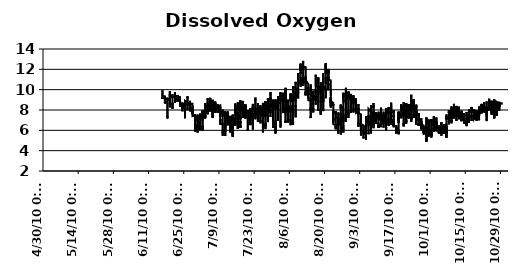
| Category | mg/L |
|---|---|
| 6/16/10 | 9.1 |
| 6/16/10 | 9.17 |
| 6/16/10 | 9.24 |
| 6/16/10 | 9.32 |
| 6/16/10 | 9.3 |
| 6/16/10 | 9.09 |
| 6/16/10 | 9.05 |
| 6/16/10 | 9.18 |
| 6/16/10 | 9.31 |
| 6/16/10 | 9.5 |
| 6/16/10 | 9.72 |
| 6/16/10 | 9.78 |
| 6/16/10 | 9.81 |
| 6/16/10 | 9.93 |
| 6/16/10 | 9.86 |
| 6/16/10 | 9.81 |
| 6/16/10 | 9.65 |
| 6/16/10 | 9.55 |
| 6/16/10 | 9.56 |
| 6/16/10 | 9.61 |
| 6/16/10 | 9.53 |
| 6/16/10 | 9.47 |
| 6/16/10 | 9.35 |
| 6/16/10 | 9.38 |
| 6/17/10 | 9.34 |
| 6/17/10 | 9.34 |
| 6/17/10 | 9.23 |
| 6/17/10 | 9.28 |
| 6/17/10 | 9.24 |
| 6/17/10 | 9.18 |
| 6/17/10 | 9.17 |
| 6/17/10 | 9.1 |
| 6/17/10 | 9.03 |
| 6/17/10 | 8.98 |
| 6/17/10 | 8.93 |
| 6/17/10 | 8.78 |
| 6/17/10 | 8.77 |
| 6/17/10 | 8.71 |
| 6/17/10 | 8.76 |
| 6/17/10 | 8.66 |
| 6/17/10 | 8.7 |
| 6/17/10 | 8.74 |
| 6/17/10 | 8.7 |
| 6/17/10 | 8.8 |
| 6/17/10 | 8.75 |
| 6/17/10 | 8.82 |
| 6/17/10 | 8.71 |
| 6/17/10 | 8.66 |
| 6/17/10 | 8.68 |
| 6/17/10 | 8.69 |
| 6/17/10 | 8.69 |
| 6/17/10 | 8.8 |
| 6/17/10 | 8.84 |
| 6/17/10 | 8.91 |
| 6/17/10 | 9 |
| 6/17/10 | 9.09 |
| 6/17/10 | 9.12 |
| 6/17/10 | 9.22 |
| 6/17/10 | 9.06 |
| 6/17/10 | 9.19 |
| 6/17/10 | 9.03 |
| 6/17/10 | 9.12 |
| 6/17/10 | 9.18 |
| 6/17/10 | 9.17 |
| 6/17/10 | 9.26 |
| 6/17/10 | 9.27 |
| 6/17/10 | 9.21 |
| 6/17/10 | 9.08 |
| 6/17/10 | 9.09 |
| 6/17/10 | 8.96 |
| 6/17/10 | 8.83 |
| 6/17/10 | 8.82 |
| 6/18/10 | 8.69 |
| 6/18/10 | 8.54 |
| 6/18/10 | 8.51 |
| 6/18/10 | 8.37 |
| 6/18/10 | 8.11 |
| 6/18/10 | 7.91 |
| 6/18/10 | 7.91 |
| 6/18/10 | 7.83 |
| 6/18/10 | 7.82 |
| 6/18/10 | 7.41 |
| 6/18/10 | 7.49 |
| 6/18/10 | 7.45 |
| 6/18/10 | 7.3 |
| 6/18/10 | 7.25 |
| 6/18/10 | 7.17 |
| 6/18/10 | 7.2 |
| 6/18/10 | 7.19 |
| 6/18/10 | 7.12 |
| 6/18/10 | 7.1 |
| 6/18/10 | 7.11 |
| 6/18/10 | 7.13 |
| 6/18/10 | 7.08 |
| 6/18/10 | 7.45 |
| 6/18/10 | 7.43 |
| 6/18/10 | 7.73 |
| 6/18/10 | 7.86 |
| 6/18/10 | 7.83 |
| 6/18/10 | 8.17 |
| 6/18/10 | 8.37 |
| 6/18/10 | 8.55 |
| 6/18/10 | 8.67 |
| 6/18/10 | 8.72 |
| 6/18/10 | 8.95 |
| 6/18/10 | 8.88 |
| 6/18/10 | 9 |
| 6/18/10 | 8.98 |
| 6/18/10 | 9.08 |
| 6/18/10 | 9.11 |
| 6/18/10 | 9.2 |
| 6/18/10 | 8.96 |
| 6/18/10 | 9.2 |
| 6/18/10 | 9.17 |
| 6/18/10 | 9.21 |
| 6/18/10 | 9.06 |
| 6/18/10 | 9.09 |
| 6/18/10 | 9.04 |
| 6/18/10 | 9.04 |
| 6/18/10 | 9.01 |
| 6/19/10 | 8.92 |
| 6/19/10 | 8.75 |
| 6/19/10 | 8.81 |
| 6/19/10 | 8.81 |
| 6/19/10 | 8.72 |
| 6/19/10 | 8.6 |
| 6/19/10 | 8.59 |
| 6/19/10 | 8.8 |
| 6/19/10 | 8.72 |
| 6/19/10 | 8.84 |
| 6/19/10 | 8.88 |
| 6/19/10 | 8.79 |
| 6/19/10 | 8.79 |
| 6/19/10 | 8.6 |
| 6/19/10 | 8.58 |
| 6/19/10 | 8.48 |
| 6/19/10 | 8.59 |
| 6/19/10 | 8.57 |
| 6/19/10 | 8.64 |
| 6/19/10 | 8.76 |
| 6/19/10 | 9 |
| 6/19/10 | 9.03 |
| 6/19/10 | 8.27 |
| 6/19/10 | 8.65 |
| 6/19/10 | 9.17 |
| 6/19/10 | 8.94 |
| 6/19/10 | 9.82 |
| 6/19/10 | 9.31 |
| 6/19/10 | 9.61 |
| 6/19/10 | 9.59 |
| 6/19/10 | 9.63 |
| 6/19/10 | 9.69 |
| 6/19/10 | 9.68 |
| 6/19/10 | 9.28 |
| 6/19/10 | 9.72 |
| 6/19/10 | 9.87 |
| 6/19/10 | 9.76 |
| 6/19/10 | 9.4 |
| 6/19/10 | 9.04 |
| 6/19/10 | 8.8 |
| 6/19/10 | 8.99 |
| 6/19/10 | 9 |
| 6/19/10 | 8.87 |
| 6/19/10 | 8.74 |
| 6/19/10 | 8.71 |
| 6/19/10 | 8.59 |
| 6/19/10 | 8.66 |
| 6/19/10 | 8.65 |
| 6/20/10 | 8.6 |
| 6/20/10 | 8.53 |
| 6/20/10 | 8.56 |
| 6/20/10 | 8.56 |
| 6/20/10 | 8.54 |
| 6/20/10 | 8.46 |
| 6/20/10 | 8.43 |
| 6/20/10 | 8.4 |
| 6/20/10 | 8.32 |
| 6/20/10 | 8.39 |
| 6/20/10 | 8.32 |
| 6/20/10 | 8.3 |
| 6/20/10 | 8.22 |
| 6/20/10 | 8.31 |
| 6/20/10 | 8.27 |
| 6/20/10 | 8.16 |
| 6/20/10 | 8.36 |
| 6/20/10 | 8.46 |
| 6/20/10 | 8.46 |
| 6/20/10 | 8.61 |
| 6/20/10 | 8.72 |
| 6/20/10 | 8.75 |
| 6/20/10 | 8.64 |
| 6/20/10 | 8.68 |
| 6/20/10 | 8.57 |
| 6/20/10 | 8.11 |
| 6/20/10 | 8.3 |
| 6/20/10 | 8.39 |
| 6/20/10 | 8.52 |
| 6/20/10 | 8.77 |
| 6/20/10 | 8.71 |
| 6/20/10 | 8.83 |
| 6/20/10 | 8.8 |
| 6/20/10 | 9.07 |
| 6/20/10 | 9.19 |
| 6/20/10 | 9.23 |
| 6/20/10 | 9.25 |
| 6/20/10 | 9.18 |
| 6/20/10 | 9.32 |
| 6/20/10 | 9.24 |
| 6/20/10 | 9.21 |
| 6/20/10 | 9.32 |
| 6/20/10 | 9.54 |
| 6/20/10 | 9.49 |
| 6/20/10 | 9.3 |
| 6/20/10 | 9.34 |
| 6/20/10 | 9.32 |
| 6/20/10 | 9.29 |
| 6/21/10 | 9.23 |
| 6/21/10 | 9.2 |
| 6/21/10 | 9.11 |
| 6/21/10 | 9.11 |
| 6/21/10 | 9.05 |
| 6/21/10 | 8.96 |
| 6/21/10 | 8.93 |
| 6/21/10 | 8.91 |
| 6/21/10 | 8.88 |
| 6/21/10 | 8.93 |
| 6/21/10 | 8.84 |
| 6/21/10 | 8.87 |
| 6/21/10 | 8.72 |
| 6/21/10 | 8.74 |
| 6/21/10 | 8.73 |
| 6/21/10 | 8.8 |
| 6/21/10 | 8.77 |
| 6/21/10 | 8.73 |
| 6/21/10 | 8.77 |
| 6/21/10 | 8.85 |
| 6/21/10 | 8.96 |
| 6/21/10 | 8.97 |
| 6/21/10 | 9 |
| 6/21/10 | 9.03 |
| 6/21/10 | 8.95 |
| 6/21/10 | 9.04 |
| 6/21/10 | 9.21 |
| 6/21/10 | 9.37 |
| 6/21/10 | 9.32 |
| 6/21/10 | 9.36 |
| 6/21/10 | 9.38 |
| 6/21/10 | 9.55 |
| 6/21/10 | 9.59 |
| 6/21/10 | 9.6 |
| 6/21/10 | 9.58 |
| 6/21/10 | 9.48 |
| 6/21/10 | 9.59 |
| 6/21/10 | 9.75 |
| 6/21/10 | 9.74 |
| 6/21/10 | 9.72 |
| 6/21/10 | 9.68 |
| 6/21/10 | 9.7 |
| 6/21/10 | 9.71 |
| 6/21/10 | 9.56 |
| 6/21/10 | 9.49 |
| 6/21/10 | 9.5 |
| 6/21/10 | 9.23 |
| 6/21/10 | 9.39 |
| 6/22/10 | 9.37 |
| 6/22/10 | 9.35 |
| 6/22/10 | 9.39 |
| 6/22/10 | 9.14 |
| 6/22/10 | 9.02 |
| 6/22/10 | 8.89 |
| 6/22/10 | 8.96 |
| 6/22/10 | 8.8 |
| 6/22/10 | 8.83 |
| 6/22/10 | 8.94 |
| 6/22/10 | 8.85 |
| 6/22/10 | 8.87 |
| 6/22/10 | 8.84 |
| 6/22/10 | 8.79 |
| 6/22/10 | 8.8 |
| 6/22/10 | 8.82 |
| 6/22/10 | 8.88 |
| 6/22/10 | 8.95 |
| 6/22/10 | 8.87 |
| 6/22/10 | 8.84 |
| 6/22/10 | 8.86 |
| 6/22/10 | 8.97 |
| 6/22/10 | 8.99 |
| 6/22/10 | 9.04 |
| 6/22/10 | 9.14 |
| 6/22/10 | 9.21 |
| 6/22/10 | 9.25 |
| 6/22/10 | 9.2 |
| 6/22/10 | 9.33 |
| 6/22/10 | 9.29 |
| 6/22/10 | 9.27 |
| 6/22/10 | 9.48 |
| 6/22/10 | 9.27 |
| 6/22/10 | 9.37 |
| 6/22/10 | 8.96 |
| 6/22/10 | 9.18 |
| 6/22/10 | 9.15 |
| 6/22/10 | 9.29 |
| 6/22/10 | 9.32 |
| 6/22/10 | 9.36 |
| 6/22/10 | 9.24 |
| 6/22/10 | 9.15 |
| 6/22/10 | 9.43 |
| 6/22/10 | 9.34 |
| 6/22/10 | 9.29 |
| 6/22/10 | 9.28 |
| 6/22/10 | 9.29 |
| 6/22/10 | 9.12 |
| 6/23/10 | 9.13 |
| 6/23/10 | 9.13 |
| 6/23/10 | 9.08 |
| 6/23/10 | 9.09 |
| 6/23/10 | 9.03 |
| 6/23/10 | 9.01 |
| 6/23/10 | 8.96 |
| 6/23/10 | 8.97 |
| 6/23/10 | 8.97 |
| 6/23/10 | 8.86 |
| 6/23/10 | 8.85 |
| 6/23/10 | 8.77 |
| 6/23/10 | 8.67 |
| 6/23/10 | 8.76 |
| 6/23/10 | 8.72 |
| 6/23/10 | 8.69 |
| 6/23/10 | 8.6 |
| 6/23/10 | 8.7 |
| 6/23/10 | 8.74 |
| 6/23/10 | 8.79 |
| 6/23/10 | 8.86 |
| 6/23/10 | 8.85 |
| 6/23/10 | 9.01 |
| 6/23/10 | 9.03 |
| 6/23/10 | 8.98 |
| 6/23/10 | 9.1 |
| 6/23/10 | 9.14 |
| 6/23/10 | 8.97 |
| 6/23/10 | 9.07 |
| 6/23/10 | 9.24 |
| 6/23/10 | 9.08 |
| 6/23/10 | 9.33 |
| 6/23/10 | 9.23 |
| 6/23/10 | 9.29 |
| 6/23/10 | 8.76 |
| 6/23/10 | 8.85 |
| 6/23/10 | 9 |
| 6/23/10 | 9.23 |
| 6/23/10 | 9.09 |
| 6/23/10 | 9 |
| 6/23/10 | 8.91 |
| 6/23/10 | 8.75 |
| 6/23/10 | 8.7 |
| 6/23/10 | 8.55 |
| 6/23/10 | 8.44 |
| 6/23/10 | 8.45 |
| 6/23/10 | 8.33 |
| 6/23/10 | 8.46 |
| 6/24/10 | 8.46 |
| 6/24/10 | 8.54 |
| 6/24/10 | 8.46 |
| 6/24/10 | 8.41 |
| 6/24/10 | 8.37 |
| 6/24/10 | 8.4 |
| 6/24/10 | 8.25 |
| 6/24/10 | 8.19 |
| 6/24/10 | 8.14 |
| 6/24/10 | 8.23 |
| 6/24/10 | 8.01 |
| 6/24/10 | 8.08 |
| 6/24/10 | 7.87 |
| 6/24/10 | 7.96 |
| 6/24/10 | 7.91 |
| 6/24/10 | 8.05 |
| 6/24/10 | 8.01 |
| 6/24/10 | 8.14 |
| 6/24/10 | 8.14 |
| 6/24/10 | 8.3 |
| 6/24/10 | 8.34 |
| 6/24/10 | 8.32 |
| 6/24/10 | 8.47 |
| 6/24/10 | 8.41 |
| 6/24/10 | 8.38 |
| 6/24/10 | 8.48 |
| 6/24/10 | 8.45 |
| 6/24/10 | 8.4 |
| 6/24/10 | 8.22 |
| 6/24/10 | 8.41 |
| 6/24/10 | 8.33 |
| 6/24/10 | 8.47 |
| 6/24/10 | 8.33 |
| 6/24/10 | 8.66 |
| 6/24/10 | 8.21 |
| 6/24/10 | 8.08 |
| 6/24/10 | 8.53 |
| 6/24/10 | 8.42 |
| 6/24/10 | 8.58 |
| 6/24/10 | 8.61 |
| 6/24/10 | 8.72 |
| 6/24/10 | 8.78 |
| 6/24/10 | 8.64 |
| 6/24/10 | 8.55 |
| 6/24/10 | 8.51 |
| 6/24/10 | 8.65 |
| 6/24/10 | 8.59 |
| 6/24/10 | 8.58 |
| 6/25/10 | 8.48 |
| 6/25/10 | 8.48 |
| 6/25/10 | 8.41 |
| 6/25/10 | 8.34 |
| 6/25/10 | 8.24 |
| 6/25/10 | 8.22 |
| 6/25/10 | 8.13 |
| 6/25/10 | 8.09 |
| 6/25/10 | 7.92 |
| 6/25/10 | 7.86 |
| 6/25/10 | 7.75 |
| 6/25/10 | 7.68 |
| 6/25/10 | 7.42 |
| 6/25/10 | 7.32 |
| 6/25/10 | 7.2 |
| 6/25/10 | 7.24 |
| 6/25/10 | 7.22 |
| 6/25/10 | 7.29 |
| 6/25/10 | 7.28 |
| 6/25/10 | 7.2 |
| 6/25/10 | 7.26 |
| 6/25/10 | 7.33 |
| 6/25/10 | 7.59 |
| 6/25/10 | 7.77 |
| 6/25/10 | 7.85 |
| 6/25/10 | 8.06 |
| 6/25/10 | 8.17 |
| 6/25/10 | 8.27 |
| 6/25/10 | 8.33 |
| 6/25/10 | 8.32 |
| 6/25/10 | 8.47 |
| 6/25/10 | 8.62 |
| 6/25/10 | 8.6 |
| 6/25/10 | 8.63 |
| 6/25/10 | 8.81 |
| 6/25/10 | 8.89 |
| 6/25/10 | 8.79 |
| 6/25/10 | 8.85 |
| 6/25/10 | 8.78 |
| 6/25/10 | 8.73 |
| 6/25/10 | 8.78 |
| 6/25/10 | 8.91 |
| 6/25/10 | 8.97 |
| 6/25/10 | 8.93 |
| 6/25/10 | 9 |
| 6/25/10 | 8.95 |
| 6/25/10 | 8.88 |
| 6/25/10 | 8.89 |
| 6/26/10 | 8.75 |
| 6/26/10 | 8.54 |
| 6/26/10 | 8.57 |
| 6/26/10 | 8.3 |
| 6/26/10 | 8.36 |
| 6/26/10 | 8.36 |
| 6/26/10 | 8.34 |
| 6/26/10 | 8.34 |
| 6/26/10 | 8.26 |
| 6/26/10 | 8.12 |
| 6/26/10 | 8.07 |
| 6/26/10 | 8.14 |
| 6/26/10 | 8.17 |
| 6/26/10 | 8.11 |
| 6/26/10 | 7.98 |
| 6/26/10 | 7.91 |
| 6/26/10 | 8.05 |
| 6/26/10 | 7.92 |
| 6/26/10 | 8.19 |
| 6/26/10 | 8.31 |
| 6/26/10 | 8.29 |
| 6/26/10 | 8.36 |
| 6/26/10 | 8.3 |
| 6/26/10 | 8.41 |
| 6/26/10 | 8.57 |
| 6/26/10 | 8.45 |
| 6/26/10 | 8.64 |
| 6/26/10 | 8.58 |
| 6/26/10 | 8.63 |
| 6/26/10 | 8.81 |
| 6/26/10 | 8.97 |
| 6/26/10 | 8.98 |
| 6/26/10 | 9 |
| 6/26/10 | 8.97 |
| 6/26/10 | 9.18 |
| 6/26/10 | 9.32 |
| 6/26/10 | 9.41 |
| 6/26/10 | 9.35 |
| 6/26/10 | 9.32 |
| 6/26/10 | 9.22 |
| 6/26/10 | 9.32 |
| 6/26/10 | 9.17 |
| 6/26/10 | 9.04 |
| 6/26/10 | 8.77 |
| 6/26/10 | 8.81 |
| 6/26/10 | 8.7 |
| 6/26/10 | 8.73 |
| 6/26/10 | 8.59 |
| 6/27/10 | 8.65 |
| 6/27/10 | 8.79 |
| 6/27/10 | 8.66 |
| 6/27/10 | 8.68 |
| 6/27/10 | 8.63 |
| 6/27/10 | 8.61 |
| 6/27/10 | 8.55 |
| 6/27/10 | 8.56 |
| 6/27/10 | 8.52 |
| 6/27/10 | 8.42 |
| 6/27/10 | 8.43 |
| 6/27/10 | 8.48 |
| 6/27/10 | 8.41 |
| 6/27/10 | 8.32 |
| 6/27/10 | 8.23 |
| 6/27/10 | 8.26 |
| 6/27/10 | 8.36 |
| 6/27/10 | 8.47 |
| 6/27/10 | 8.49 |
| 6/27/10 | 8.57 |
| 6/27/10 | 8.65 |
| 6/27/10 | 8.68 |
| 6/27/10 | 8.7 |
| 6/27/10 | 8.72 |
| 6/27/10 | 8.77 |
| 6/27/10 | 8.68 |
| 6/27/10 | 8.9 |
| 6/27/10 | 7.92 |
| 6/27/10 | 7.99 |
| 6/27/10 | 7.87 |
| 6/27/10 | 7.96 |
| 6/27/10 | 8.17 |
| 6/27/10 | 8.23 |
| 6/27/10 | 7.91 |
| 6/27/10 | 7.95 |
| 6/27/10 | 8.28 |
| 6/27/10 | 7.87 |
| 6/27/10 | 8.64 |
| 6/27/10 | 8.83 |
| 6/27/10 | 8.69 |
| 6/27/10 | 8.47 |
| 6/27/10 | 8.5 |
| 6/27/10 | 8.58 |
| 6/27/10 | 8.59 |
| 6/27/10 | 8.75 |
| 6/27/10 | 8.48 |
| 6/27/10 | 8.58 |
| 6/27/10 | 8.65 |
| 6/28/10 | 8.61 |
| 6/28/10 | 8.58 |
| 6/28/10 | 8.62 |
| 6/28/10 | 8.56 |
| 6/28/10 | 8.4 |
| 6/28/10 | 8.38 |
| 6/28/10 | 8.25 |
| 6/28/10 | 8.24 |
| 6/28/10 | 7.99 |
| 6/28/10 | 7.85 |
| 6/28/10 | 8.06 |
| 6/28/10 | 7.89 |
| 6/28/10 | 7.83 |
| 6/28/10 | 7.75 |
| 6/28/10 | 7.76 |
| 6/28/10 | 7.8 |
| 6/28/10 | 7.64 |
| 6/28/10 | 7.71 |
| 6/28/10 | 7.86 |
| 6/28/10 | 7.78 |
| 6/28/10 | 7.74 |
| 6/28/10 | 7.68 |
| 6/28/10 | 7.89 |
| 6/28/10 | 7.88 |
| 6/28/10 | 7.88 |
| 6/28/10 | 7.86 |
| 6/28/10 | 7.79 |
| 6/28/10 | 8.02 |
| 6/28/10 | 7.99 |
| 6/28/10 | 7.96 |
| 6/28/10 | 7.56 |
| 6/28/10 | 8.16 |
| 6/28/10 | 8.3 |
| 6/28/10 | 8.22 |
| 6/28/10 | 8.24 |
| 6/28/10 | 8.24 |
| 6/28/10 | 8.37 |
| 6/28/10 | 8.42 |
| 6/28/10 | 8.27 |
| 6/28/10 | 8.3 |
| 6/28/10 | 8.01 |
| 6/28/10 | 7.9 |
| 6/28/10 | 7.91 |
| 6/28/10 | 7.99 |
| 6/28/10 | 7.87 |
| 6/28/10 | 7.52 |
| 6/28/10 | 7.53 |
| 6/28/10 | 7.4 |
| 6/29/10 | 7.47 |
| 6/29/10 | 7.4 |
| 6/29/10 | 7.11 |
| 6/29/10 | 7.12 |
| 6/29/10 | 6.91 |
| 6/29/10 | 6.74 |
| 6/29/10 | 6.76 |
| 6/29/10 | 6.56 |
| 6/29/10 | 6.47 |
| 6/29/10 | 6.32 |
| 6/29/10 | 6.21 |
| 6/29/10 | 6.19 |
| 6/29/10 | 5.86 |
| 6/29/10 | 6.1 |
| 6/29/10 | 5.96 |
| 6/29/10 | 5.94 |
| 6/29/10 | 6.01 |
| 6/29/10 | 6.17 |
| 6/29/10 | 6.21 |
| 6/29/10 | 6.4 |
| 6/29/10 | 6.52 |
| 6/29/10 | 6.64 |
| 6/29/10 | 6.73 |
| 6/29/10 | 6.8 |
| 6/29/10 | 6.78 |
| 6/29/10 | 6.95 |
| 6/29/10 | 7.09 |
| 6/29/10 | 6.99 |
| 6/29/10 | 6.99 |
| 6/29/10 | 6.68 |
| 6/29/10 | 6.97 |
| 6/29/10 | 7.18 |
| 6/29/10 | 7.29 |
| 6/29/10 | 7.09 |
| 6/29/10 | 7.35 |
| 6/29/10 | 7.23 |
| 6/29/10 | 7.55 |
| 6/29/10 | 7.42 |
| 6/29/10 | 7.56 |
| 6/29/10 | 7.5 |
| 6/29/10 | 7.61 |
| 6/29/10 | 7.51 |
| 6/29/10 | 7.38 |
| 6/29/10 | 7.15 |
| 6/29/10 | 6.81 |
| 6/29/10 | 7.05 |
| 6/29/10 | 6.81 |
| 6/29/10 | 6.64 |
| 6/30/10 | 6.49 |
| 6/30/10 | 6.35 |
| 6/30/10 | 6.4 |
| 6/30/10 | 6.19 |
| 6/30/10 | 6.44 |
| 6/30/10 | 6.36 |
| 6/30/10 | 6.28 |
| 6/30/10 | 6.28 |
| 6/30/10 | 6.23 |
| 6/30/10 | 6.2 |
| 6/30/10 | 6.22 |
| 6/30/10 | 6.12 |
| 6/30/10 | 6.05 |
| 6/30/10 | 5.93 |
| 6/30/10 | 5.89 |
| 6/30/10 | 5.94 |
| 6/30/10 | 6.05 |
| 6/30/10 | 6.05 |
| 6/30/10 | 5.91 |
| 6/30/10 | 5.78 |
| 6/30/10 | 6.25 |
| 6/30/10 | 6.35 |
| 6/30/10 | 6.44 |
| 6/30/10 | 6.51 |
| 6/30/10 | 6.48 |
| 6/30/10 | 6.45 |
| 6/30/10 | 5.92 |
| 6/30/10 | 6.53 |
| 6/30/10 | 6.33 |
| 6/30/10 | 6.4 |
| 6/30/10 | 6.46 |
| 6/30/10 | 6.32 |
| 6/30/10 | 6.61 |
| 6/30/10 | 6.8 |
| 6/30/10 | 6.79 |
| 6/30/10 | 6.95 |
| 6/30/10 | 6.85 |
| 6/30/10 | 7.23 |
| 6/30/10 | 7.42 |
| 6/30/10 | 7.55 |
| 6/30/10 | 7.07 |
| 6/30/10 | 7.51 |
| 6/30/10 | 7.34 |
| 6/30/10 | 7.23 |
| 6/30/10 | 7.13 |
| 6/30/10 | 7 |
| 6/30/10 | 6.9 |
| 6/30/10 | 6.79 |
| 7/1/10 | 6.65 |
| 7/1/10 | 6.66 |
| 7/1/10 | 6.51 |
| 7/1/10 | 6.55 |
| 7/1/10 | 6.48 |
| 7/1/10 | 6.47 |
| 7/1/10 | 6.36 |
| 7/1/10 | 6.26 |
| 7/1/10 | 6.35 |
| 7/1/10 | 6.27 |
| 7/1/10 | 6.12 |
| 7/1/10 | 6.13 |
| 7/1/10 | 6.13 |
| 7/1/10 | 6.08 |
| 7/1/10 | 6.06 |
| 7/1/10 | 6.01 |
| 7/1/10 | 5.98 |
| 7/1/10 | 6.08 |
| 7/1/10 | 6.01 |
| 7/1/10 | 6.07 |
| 7/1/10 | 6.26 |
| 7/1/10 | 6.44 |
| 7/1/10 | 6.64 |
| 7/1/10 | 6.66 |
| 7/1/10 | 6.61 |
| 7/1/10 | 6.75 |
| 7/1/10 | 6.6 |
| 7/1/10 | 6.9 |
| 7/1/10 | 6.91 |
| 7/1/10 | 6.94 |
| 7/1/10 | 6.98 |
| 7/1/10 | 7.02 |
| 7/1/10 | 7.04 |
| 7/1/10 | 7.2 |
| 7/1/10 | 7.09 |
| 7/1/10 | 7.13 |
| 7/1/10 | 7.26 |
| 7/1/10 | 7.39 |
| 7/1/10 | 7.38 |
| 7/1/10 | 7.45 |
| 7/1/10 | 7.23 |
| 7/1/10 | 7.26 |
| 7/1/10 | 7.46 |
| 7/1/10 | 7.65 |
| 7/1/10 | 7.57 |
| 7/1/10 | 7.54 |
| 7/1/10 | 7.38 |
| 7/1/10 | 7.39 |
| 7/2/10 | 7.38 |
| 7/2/10 | 7.34 |
| 7/2/10 | 7.14 |
| 7/2/10 | 7.21 |
| 7/2/10 | 7.12 |
| 7/2/10 | 6.99 |
| 7/2/10 | 6.8 |
| 7/2/10 | 6.84 |
| 7/2/10 | 6.66 |
| 7/2/10 | 6.11 |
| 7/2/10 | 6.43 |
| 7/2/10 | 6.34 |
| 7/2/10 | 6.36 |
| 7/2/10 | 6.39 |
| 7/2/10 | 6.23 |
| 7/2/10 | 6.14 |
| 7/2/10 | 6.21 |
| 7/2/10 | 6.28 |
| 7/2/10 | 6.22 |
| 7/2/10 | 6.21 |
| 7/2/10 | 5.95 |
| 7/2/10 | 6.09 |
| 7/2/10 | 6.6 |
| 7/2/10 | 6.68 |
| 7/2/10 | 6.74 |
| 7/2/10 | 6.69 |
| 7/2/10 | 6.88 |
| 7/2/10 | 6.88 |
| 7/2/10 | 7.15 |
| 7/2/10 | 7.23 |
| 7/2/10 | 7.31 |
| 7/2/10 | 6.95 |
| 7/2/10 | 7.08 |
| 7/2/10 | 7.14 |
| 7/2/10 | 7.54 |
| 7/2/10 | 7.08 |
| 7/2/10 | 7.87 |
| 7/2/10 | 7.8 |
| 7/2/10 | 7.82 |
| 7/2/10 | 7.92 |
| 7/2/10 | 7.98 |
| 7/2/10 | 7.84 |
| 7/2/10 | 7.7 |
| 7/2/10 | 7.77 |
| 7/2/10 | 7.88 |
| 7/2/10 | 7.55 |
| 7/2/10 | 7.48 |
| 7/2/10 | 7.3 |
| 7/3/10 | 7.48 |
| 7/3/10 | 7.25 |
| 7/3/10 | 7.52 |
| 7/3/10 | 7.5 |
| 7/3/10 | 7.39 |
| 7/3/10 | 7.54 |
| 7/3/10 | 7.76 |
| 7/3/10 | 7.7 |
| 7/3/10 | 7.24 |
| 7/3/10 | 7.3 |
| 7/3/10 | 7.43 |
| 7/3/10 | 7.42 |
| 7/3/10 | 7.38 |
| 7/3/10 | 7.36 |
| 7/3/10 | 7.33 |
| 7/3/10 | 7.32 |
| 7/3/10 | 7.27 |
| 7/3/10 | 7.34 |
| 7/3/10 | 7.45 |
| 7/3/10 | 7.17 |
| 7/3/10 | 7.37 |
| 7/3/10 | 7.27 |
| 7/3/10 | 7.32 |
| 7/3/10 | 7.44 |
| 7/3/10 | 7.72 |
| 7/3/10 | 7.58 |
| 7/3/10 | 7.83 |
| 7/3/10 | 7.74 |
| 7/3/10 | 7.91 |
| 7/3/10 | 7.99 |
| 7/3/10 | 7.62 |
| 7/3/10 | 8.06 |
| 7/3/10 | 8.19 |
| 7/3/10 | 8.28 |
| 7/3/10 | 8.44 |
| 7/3/10 | 8.54 |
| 7/3/10 | 8.57 |
| 7/3/10 | 8.45 |
| 7/3/10 | 8.69 |
| 7/3/10 | 8.38 |
| 7/3/10 | 7.91 |
| 7/3/10 | 8.59 |
| 7/3/10 | 8.48 |
| 7/3/10 | 8.56 |
| 7/3/10 | 7.81 |
| 7/3/10 | 8.16 |
| 7/3/10 | 8.07 |
| 7/3/10 | 8.22 |
| 7/4/10 | 8.29 |
| 7/4/10 | 8.35 |
| 7/4/10 | 8.42 |
| 7/4/10 | 8.34 |
| 7/4/10 | 8.25 |
| 7/4/10 | 8.42 |
| 7/4/10 | 8.2 |
| 7/4/10 | 8.15 |
| 7/4/10 | 8.22 |
| 7/4/10 | 8.15 |
| 7/4/10 | 8.08 |
| 7/4/10 | 7.94 |
| 7/4/10 | 7.81 |
| 7/4/10 | 7.8 |
| 7/4/10 | 7.85 |
| 7/4/10 | 7.84 |
| 7/4/10 | 7.92 |
| 7/4/10 | 8.01 |
| 7/4/10 | 8.06 |
| 7/4/10 | 8.01 |
| 7/4/10 | 7.9 |
| 7/4/10 | 7.87 |
| 7/4/10 | 7.57 |
| 7/4/10 | 8.22 |
| 7/4/10 | 8.36 |
| 7/4/10 | 8.46 |
| 7/4/10 | 8.28 |
| 7/4/10 | 8.27 |
| 7/4/10 | 8.28 |
| 7/4/10 | 8.43 |
| 7/4/10 | 8.34 |
| 7/4/10 | 8.75 |
| 7/4/10 | 8.84 |
| 7/4/10 | 8.91 |
| 7/4/10 | 8.98 |
| 7/4/10 | 8.86 |
| 7/4/10 | 9.01 |
| 7/4/10 | 9.16 |
| 7/4/10 | 9.14 |
| 7/4/10 | 9.18 |
| 7/4/10 | 9.02 |
| 7/4/10 | 8.94 |
| 7/4/10 | 8.84 |
| 7/4/10 | 8.76 |
| 7/4/10 | 8.46 |
| 7/4/10 | 8.72 |
| 7/4/10 | 8.5 |
| 7/4/10 | 8.43 |
| 7/5/10 | 8.25 |
| 7/5/10 | 8.66 |
| 7/5/10 | 8.46 |
| 7/5/10 | 8.32 |
| 7/5/10 | 8.5 |
| 7/5/10 | 8.58 |
| 7/5/10 | 8.28 |
| 7/5/10 | 8.34 |
| 7/5/10 | 8.41 |
| 7/5/10 | 8.33 |
| 7/5/10 | 8.26 |
| 7/5/10 | 8.27 |
| 7/5/10 | 8.2 |
| 7/5/10 | 8.09 |
| 7/5/10 | 8.05 |
| 7/5/10 | 8.14 |
| 7/5/10 | 8.04 |
| 7/5/10 | 7.84 |
| 7/5/10 | 8.07 |
| 7/5/10 | 8.32 |
| 7/5/10 | 8.33 |
| 7/5/10 | 8.11 |
| 7/5/10 | 8.37 |
| 7/5/10 | 8.28 |
| 7/5/10 | 8.32 |
| 7/5/10 | 8.32 |
| 7/5/10 | 8.53 |
| 7/5/10 | 8.53 |
| 7/5/10 | 8.75 |
| 7/5/10 | 8.76 |
| 7/5/10 | 8.8 |
| 7/5/10 | 8.86 |
| 7/5/10 | 8.98 |
| 7/5/10 | 9.01 |
| 7/5/10 | 9.2 |
| 7/5/10 | 9.19 |
| 7/5/10 | 9.29 |
| 7/5/10 | 9.18 |
| 7/5/10 | 9.01 |
| 7/5/10 | 9.18 |
| 7/5/10 | 8.86 |
| 7/5/10 | 8.96 |
| 7/5/10 | 9.05 |
| 7/5/10 | 8.97 |
| 7/5/10 | 8.86 |
| 7/5/10 | 9.03 |
| 7/5/10 | 8.2 |
| 7/5/10 | 8.87 |
| 7/6/10 | 8.93 |
| 7/6/10 | 8.42 |
| 7/6/10 | 8.94 |
| 7/6/10 | 8.51 |
| 7/6/10 | 8.77 |
| 7/6/10 | 8.7 |
| 7/6/10 | 8.39 |
| 7/6/10 | 8.46 |
| 7/6/10 | 8.5 |
| 7/6/10 | 8.33 |
| 7/6/10 | 8.33 |
| 7/6/10 | 8.34 |
| 7/6/10 | 8.38 |
| 7/6/10 | 8.3 |
| 7/6/10 | 8.32 |
| 7/6/10 | 8.32 |
| 7/6/10 | 8.26 |
| 7/6/10 | 8.42 |
| 7/6/10 | 8.42 |
| 7/6/10 | 8.42 |
| 7/6/10 | 8.38 |
| 7/6/10 | 8.25 |
| 7/6/10 | 7.86 |
| 7/6/10 | 7.96 |
| 7/6/10 | 7.85 |
| 7/6/10 | 7.98 |
| 7/6/10 | 7.85 |
| 7/6/10 | 8.12 |
| 7/6/10 | 7.86 |
| 7/6/10 | 8.1 |
| 7/6/10 | 8.15 |
| 7/6/10 | 8.27 |
| 7/6/10 | 8.33 |
| 7/6/10 | 7.88 |
| 7/6/10 | 8 |
| 7/6/10 | 7.28 |
| 7/6/10 | 8.43 |
| 7/6/10 | 8.5 |
| 7/6/10 | 8.7 |
| 7/6/10 | 8.68 |
| 7/6/10 | 8.78 |
| 7/6/10 | 8.6 |
| 7/6/10 | 8.43 |
| 7/6/10 | 8.11 |
| 7/6/10 | 8.03 |
| 7/6/10 | 7.21 |
| 7/6/10 | 7.8 |
| 7/6/10 | 8.1 |
| 7/7/10 | 8.2 |
| 7/7/10 | 8.38 |
| 7/7/10 | 8.46 |
| 7/7/10 | 8.21 |
| 7/7/10 | 8.38 |
| 7/7/10 | 8.34 |
| 7/7/10 | 7.96 |
| 7/7/10 | 8.32 |
| 7/7/10 | 8.36 |
| 7/7/10 | 8.32 |
| 7/7/10 | 8.19 |
| 7/7/10 | 8.26 |
| 7/7/10 | 8.24 |
| 7/7/10 | 8.25 |
| 7/7/10 | 8.16 |
| 7/7/10 | 8.23 |
| 7/7/10 | 8.25 |
| 7/7/10 | 8.21 |
| 7/7/10 | 8.48 |
| 7/7/10 | 8.06 |
| 7/7/10 | 8.22 |
| 7/7/10 | 8.29 |
| 7/7/10 | 7.71 |
| 7/7/10 | 7.93 |
| 7/7/10 | 8.14 |
| 7/7/10 | 8.47 |
| 7/7/10 | 8.42 |
| 7/7/10 | 8.34 |
| 7/7/10 | 8.39 |
| 7/7/10 | 8.47 |
| 7/7/10 | 8.59 |
| 7/7/10 | 8.56 |
| 7/7/10 | 8.71 |
| 7/7/10 | 8.5 |
| 7/7/10 | 8.57 |
| 7/7/10 | 8.83 |
| 7/7/10 | 8.81 |
| 7/7/10 | 8.81 |
| 7/7/10 | 8.82 |
| 7/7/10 | 8.76 |
| 7/7/10 | 8.75 |
| 7/7/10 | 8.32 |
| 7/7/10 | 8.56 |
| 7/7/10 | 8.44 |
| 7/7/10 | 8.71 |
| 7/7/10 | 8.53 |
| 7/7/10 | 8.37 |
| 7/7/10 | 8.5 |
| 7/8/10 | 8.4 |
| 7/8/10 | 8.33 |
| 7/8/10 | 8.39 |
| 7/8/10 | 8.05 |
| 7/8/10 | 8.44 |
| 7/8/10 | 8.22 |
| 7/8/10 | 8.16 |
| 7/8/10 | 8.13 |
| 7/8/10 | 8.1 |
| 7/8/10 | 8.12 |
| 7/8/10 | 7.86 |
| 7/8/10 | 7.94 |
| 7/8/10 | 8.07 |
| 7/8/10 | 8.13 |
| 7/8/10 | 8.06 |
| 7/8/10 | 8 |
| 7/8/10 | 8.04 |
| 7/8/10 | 8.02 |
| 7/8/10 | 7.73 |
| 7/8/10 | 8.14 |
| 7/8/10 | 7.97 |
| 7/8/10 | 7.8 |
| 7/8/10 | 7.83 |
| 7/8/10 | 8.02 |
| 7/8/10 | 8.13 |
| 7/8/10 | 7.98 |
| 7/8/10 | 7.98 |
| 7/8/10 | 8 |
| 7/8/10 | 7.86 |
| 7/8/10 | 7.96 |
| 7/8/10 | 8.21 |
| 7/8/10 | 8.25 |
| 7/8/10 | 8.36 |
| 7/8/10 | 8.27 |
| 7/8/10 | 8.05 |
| 7/8/10 | 8.36 |
| 7/8/10 | 8.13 |
| 7/8/10 | 8.13 |
| 7/8/10 | 8.09 |
| 7/8/10 | 8.1 |
| 7/8/10 | 8.45 |
| 7/8/10 | 8.2 |
| 7/8/10 | 8.58 |
| 7/8/10 | 8.61 |
| 7/8/10 | 8.57 |
| 7/8/10 | 8.44 |
| 7/8/10 | 8.32 |
| 7/8/10 | 8.24 |
| 7/9/10 | 8.45 |
| 7/9/10 | 8.35 |
| 7/9/10 | 8.34 |
| 7/9/10 | 8.2 |
| 7/9/10 | 8.23 |
| 7/9/10 | 8.12 |
| 7/9/10 | 7.74 |
| 7/9/10 | 7.94 |
| 7/9/10 | 8.04 |
| 7/9/10 | 8.1 |
| 7/9/10 | 7.99 |
| 7/9/10 | 7.81 |
| 7/9/10 | 7.74 |
| 7/9/10 | 7.88 |
| 7/9/10 | 7.65 |
| 7/9/10 | 7.7 |
| 7/9/10 | 7.84 |
| 7/9/10 | 7.66 |
| 7/9/10 | 7.9 |
| 7/9/10 | 7.85 |
| 7/9/10 | 7.64 |
| 7/9/10 | 7.8 |
| 7/9/10 | 7.83 |
| 7/9/10 | 7.83 |
| 7/9/10 | 7.85 |
| 7/9/10 | 7.96 |
| 7/9/10 | 8.04 |
| 7/9/10 | 8.24 |
| 7/9/10 | 8.38 |
| 7/9/10 | 8.04 |
| 7/9/10 | 8.09 |
| 7/9/10 | 7.32 |
| 7/9/10 | 7.68 |
| 7/9/10 | 7.68 |
| 7/9/10 | 7.5 |
| 7/9/10 | 7.41 |
| 7/9/10 | 7.45 |
| 7/9/10 | 7.62 |
| 7/9/10 | 7.38 |
| 7/9/10 | 7.14 |
| 7/9/10 | 6.96 |
| 7/9/10 | 7.09 |
| 7/9/10 | 7.1 |
| 7/9/10 | 6.89 |
| 7/9/10 | 6.65 |
| 7/9/10 | 7.08 |
| 7/9/10 | 6.62 |
| 7/9/10 | 6.68 |
| 7/10/10 | 6.64 |
| 7/10/10 | 6.54 |
| 7/10/10 | 6.46 |
| 7/10/10 | 6.56 |
| 7/10/10 | 6.47 |
| 7/10/10 | 6.21 |
| 7/10/10 | 6.27 |
| 7/10/10 | 6.24 |
| 7/10/10 | 6.04 |
| 7/10/10 | 5.9 |
| 7/10/10 | 5.94 |
| 7/10/10 | 5.68 |
| 7/10/10 | 5.57 |
| 7/10/10 | 5.59 |
| 7/10/10 | 5.55 |
| 7/10/10 | 5.47 |
| 7/10/10 | 5.71 |
| 7/10/10 | 5.86 |
| 7/10/10 | 5.86 |
| 7/10/10 | 5.73 |
| 7/10/10 | 5.96 |
| 7/10/10 | 6.19 |
| 7/10/10 | 6.44 |
| 7/10/10 | 6.91 |
| 7/10/10 | 7.01 |
| 7/10/10 | 7.1 |
| 7/10/10 | 7.22 |
| 7/10/10 | 7.35 |
| 7/10/10 | 7.5 |
| 7/10/10 | 7.4 |
| 7/10/10 | 7.39 |
| 7/10/10 | 7.49 |
| 7/10/10 | 7.63 |
| 7/10/10 | 7.74 |
| 7/10/10 | 7.77 |
| 7/10/10 | 7.91 |
| 7/10/10 | 8.03 |
| 7/10/10 | 7.85 |
| 7/10/10 | 7.6 |
| 7/10/10 | 7.76 |
| 7/10/10 | 7.66 |
| 7/10/10 | 7.65 |
| 7/10/10 | 7.66 |
| 7/10/10 | 7.57 |
| 7/10/10 | 7.48 |
| 7/10/10 | 7.49 |
| 7/10/10 | 7.45 |
| 7/10/10 | 7.49 |
| 7/11/10 | 7.4 |
| 7/11/10 | 7.21 |
| 7/11/10 | 7.14 |
| 7/11/10 | 6.94 |
| 7/11/10 | 7.01 |
| 7/11/10 | 7 |
| 7/11/10 | 6.81 |
| 7/11/10 | 6.89 |
| 7/11/10 | 7 |
| 7/11/10 | 6.84 |
| 7/11/10 | 6.69 |
| 7/11/10 | 6.59 |
| 7/11/10 | 6.52 |
| 7/11/10 | 6.35 |
| 7/11/10 | 6.32 |
| 7/11/10 | 6.22 |
| 7/11/10 | 6.16 |
| 7/11/10 | 6.2 |
| 7/11/10 | 6.25 |
| 7/11/10 | 6.27 |
| 7/11/10 | 6.15 |
| 7/11/10 | 5.96 |
| 7/11/10 | 5.44 |
| 7/11/10 | 6.52 |
| 7/11/10 | 6.23 |
| 7/11/10 | 5.86 |
| 7/11/10 | 6.63 |
| 7/11/10 | 6.6 |
| 7/11/10 | 7.11 |
| 7/11/10 | 7.04 |
| 7/11/10 | 7.25 |
| 7/11/10 | 7.22 |
| 7/11/10 | 7.49 |
| 7/11/10 | 7.5 |
| 7/11/10 | 7.48 |
| 7/11/10 | 6.35 |
| 7/11/10 | 7.56 |
| 7/11/10 | 7.84 |
| 7/11/10 | 7.79 |
| 7/11/10 | 7.58 |
| 7/11/10 | 7.48 |
| 7/11/10 | 7.86 |
| 7/11/10 | 7.6 |
| 7/11/10 | 7.65 |
| 7/11/10 | 7.61 |
| 7/11/10 | 7.64 |
| 7/11/10 | 7.57 |
| 7/11/10 | 7.68 |
| 7/12/10 | 7.39 |
| 7/12/10 | 6.89 |
| 7/12/10 | 7.39 |
| 7/12/10 | 7.33 |
| 7/12/10 | 7.17 |
| 7/12/10 | 7.24 |
| 7/12/10 | 7.36 |
| 7/12/10 | 7.37 |
| 7/12/10 | 7.38 |
| 7/12/10 | 7.31 |
| 7/12/10 | 7.28 |
| 7/12/10 | 7.19 |
| 7/12/10 | 7.12 |
| 7/12/10 | 7 |
| 7/12/10 | 6.87 |
| 7/12/10 | 6.81 |
| 7/12/10 | 6.95 |
| 7/12/10 | 6.9 |
| 7/12/10 | 6.91 |
| 7/12/10 | 6.95 |
| 7/12/10 | 6.49 |
| 7/12/10 | 6.98 |
| 7/12/10 | 6.85 |
| 7/12/10 | 6.63 |
| 7/12/10 | 6.88 |
| 7/12/10 | 7.31 |
| 7/12/10 | 7.38 |
| 7/12/10 | 7.42 |
| 7/12/10 | 7.34 |
| 7/12/10 | 7.2 |
| 7/12/10 | 7.39 |
| 7/12/10 | 7.56 |
| 7/12/10 | 7.5 |
| 7/12/10 | 7.69 |
| 7/12/10 | 7.86 |
| 7/12/10 | 7.82 |
| 7/12/10 | 7.05 |
| 7/12/10 | 7.71 |
| 7/12/10 | 7.55 |
| 7/12/10 | 7.48 |
| 7/12/10 | 7.73 |
| 7/12/10 | 7.56 |
| 7/12/10 | 7.44 |
| 7/12/10 | 7.01 |
| 7/12/10 | 6.97 |
| 7/12/10 | 7.5 |
| 7/12/10 | 7.71 |
| 7/12/10 | 7.34 |
| 7/13/10 | 7.19 |
| 7/13/10 | 7.37 |
| 7/13/10 | 7.19 |
| 7/13/10 | 7.09 |
| 7/13/10 | 6.9 |
| 7/13/10 | 6.88 |
| 7/13/10 | 6.57 |
| 7/13/10 | 6.75 |
| 7/13/10 | 6.53 |
| 7/13/10 | 6.54 |
| 7/13/10 | 6.65 |
| 7/13/10 | 6.3 |
| 7/13/10 | 6.24 |
| 7/13/10 | 6.14 |
| 7/13/10 | 6.02 |
| 7/13/10 | 5.85 |
| 7/13/10 | 6.26 |
| 7/13/10 | 5.96 |
| 7/13/10 | 5.79 |
| 7/13/10 | 6.01 |
| 7/13/10 | 6.07 |
| 7/13/10 | 6.33 |
| 7/13/10 | 6.45 |
| 7/13/10 | 6.46 |
| 7/13/10 | 6.46 |
| 7/13/10 | 6.58 |
| 7/13/10 | 6.62 |
| 7/13/10 | 6 |
| 7/13/10 | 6.84 |
| 7/13/10 | 6.72 |
| 7/13/10 | 6.43 |
| 7/13/10 | 6.43 |
| 7/13/10 | 6.02 |
| 7/13/10 | 6.71 |
| 7/13/10 | 6.5 |
| 7/13/10 | 6.92 |
| 7/13/10 | 7.2 |
| 7/13/10 | 6.85 |
| 7/13/10 | 6.84 |
| 7/13/10 | 6.54 |
| 7/13/10 | 6.67 |
| 7/13/10 | 6.42 |
| 7/13/10 | 7.15 |
| 7/13/10 | 6.93 |
| 7/13/10 | 7.13 |
| 7/13/10 | 7.31 |
| 7/13/10 | 7.19 |
| 7/13/10 | 7.34 |
| 7/14/10 | 7.27 |
| 7/14/10 | 7.08 |
| 7/14/10 | 6.96 |
| 7/14/10 | 6.43 |
| 7/14/10 | 6.06 |
| 7/14/10 | 6.33 |
| 7/14/10 | 6.35 |
| 7/14/10 | 6.2 |
| 7/14/10 | 6.25 |
| 7/14/10 | 6.08 |
| 7/14/10 | 5.48 |
| 7/14/10 | 5.89 |
| 7/14/10 | 5.79 |
| 7/14/10 | 5.7 |
| 7/14/10 | 5.35 |
| 7/14/10 | 5.36 |
| 7/14/10 | 5.53 |
| 7/14/10 | 5.57 |
| 7/14/10 | 5.47 |
| 7/14/10 | 5.85 |
| 7/14/10 | 5.41 |
| 7/14/10 | 5.43 |
| 7/14/10 | 5.46 |
| 7/14/10 | 5.59 |
| 7/14/10 | 5.72 |
| 7/14/10 | 6.36 |
| 7/14/10 | 6.13 |
| 7/14/10 | 5.87 |
| 7/14/10 | 5.63 |
| 7/14/10 | 7.02 |
| 7/14/10 | 6.98 |
| 7/14/10 | 7.07 |
| 7/14/10 | 6.88 |
| 7/14/10 | 6.74 |
| 7/14/10 | 7.18 |
| 7/14/10 | 7.51 |
| 7/14/10 | 7.39 |
| 7/14/10 | 7.54 |
| 7/14/10 | 7.2 |
| 7/14/10 | 7.14 |
| 7/14/10 | 7.16 |
| 7/14/10 | 7.01 |
| 7/14/10 | 7.21 |
| 7/14/10 | 5.73 |
| 7/14/10 | 6.42 |
| 7/14/10 | 6.62 |
| 7/14/10 | 6.77 |
| 7/14/10 | 6.91 |
| 7/15/10 | 6.89 |
| 7/15/10 | 7.01 |
| 7/15/10 | 6.92 |
| 7/15/10 | 7.29 |
| 7/15/10 | 7.25 |
| 7/15/10 | 7.31 |
| 7/15/10 | 7.28 |
| 7/15/10 | 7.27 |
| 7/15/10 | 7 |
| 7/15/10 | 7.12 |
| 7/15/10 | 7.12 |
| 7/15/10 | 6.98 |
| 7/15/10 | 6.8 |
| 7/15/10 | 6.84 |
| 7/15/10 | 6.82 |
| 7/15/10 | 6.74 |
| 7/15/10 | 6.66 |
| 7/15/10 | 6.56 |
| 7/15/10 | 6.9 |
| 7/15/10 | 6.98 |
| 7/15/10 | 6.45 |
| 7/15/10 | 6.76 |
| 7/15/10 | 6.82 |
| 7/15/10 | 7.54 |
| 7/15/10 | 7.85 |
| 7/15/10 | 7.62 |
| 7/15/10 | 7.41 |
| 7/15/10 | 7.64 |
| 7/15/10 | 7.65 |
| 7/15/10 | 7.92 |
| 7/15/10 | 7.92 |
| 7/15/10 | 8.05 |
| 7/15/10 | 8.49 |
| 7/15/10 | 8.38 |
| 7/15/10 | 8.02 |
| 7/15/10 | 8.63 |
| 7/15/10 | 8.48 |
| 7/15/10 | 8.41 |
| 7/15/10 | 8.06 |
| 7/15/10 | 8.27 |
| 7/15/10 | 8.01 |
| 7/15/10 | 7.75 |
| 7/15/10 | 8.28 |
| 7/15/10 | 8.23 |
| 7/15/10 | 8.2 |
| 7/15/10 | 8.03 |
| 7/15/10 | 7.7 |
| 7/15/10 | 7.69 |
| 7/16/10 | 7.75 |
| 7/16/10 | 7.26 |
| 7/16/10 | 7.72 |
| 7/16/10 | 6.14 |
| 7/16/10 | 6.61 |
| 7/16/10 | 6.98 |
| 7/16/10 | 7.35 |
| 7/16/10 | 7.36 |
| 7/16/10 | 7.6 |
| 7/16/10 | 7.52 |
| 7/16/10 | 7.52 |
| 7/16/10 | 7.63 |
| 7/16/10 | 7.61 |
| 7/16/10 | 7.67 |
| 7/16/10 | 7.6 |
| 7/16/10 | 7.38 |
| 7/16/10 | 7.34 |
| 7/16/10 | 7.37 |
| 7/16/10 | 7.44 |
| 7/16/10 | 7.71 |
| 7/16/10 | 7.54 |
| 7/16/10 | 6.83 |
| 7/16/10 | 7.66 |
| 7/16/10 | 7.39 |
| 7/16/10 | 7.39 |
| 7/16/10 | 7.52 |
| 7/16/10 | 7.69 |
| 7/16/10 | 7.76 |
| 7/16/10 | 7.6 |
| 7/16/10 | 7.68 |
| 7/16/10 | 7.77 |
| 7/16/10 | 7.61 |
| 7/16/10 | 7.64 |
| 7/16/10 | 8.18 |
| 7/16/10 | 8.33 |
| 7/16/10 | 8.44 |
| 7/16/10 | 8.6 |
| 7/16/10 | 8.76 |
| 7/16/10 | 8.59 |
| 7/16/10 | 8.26 |
| 7/16/10 | 7.95 |
| 7/16/10 | 7.96 |
| 7/16/10 | 8.14 |
| 7/16/10 | 8.25 |
| 7/16/10 | 8.02 |
| 7/16/10 | 8.12 |
| 7/16/10 | 8.13 |
| 7/16/10 | 8.06 |
| 7/17/10 | 7.99 |
| 7/17/10 | 7.82 |
| 7/17/10 | 7.79 |
| 7/17/10 | 7.75 |
| 7/17/10 | 7.67 |
| 7/17/10 | 7.1 |
| 7/17/10 | 7.33 |
| 7/17/10 | 7.49 |
| 7/17/10 | 7.13 |
| 7/17/10 | 6.86 |
| 7/17/10 | 6.94 |
| 7/17/10 | 6.84 |
| 7/17/10 | 6.69 |
| 7/17/10 | 6.43 |
| 7/17/10 | 6.25 |
| 7/17/10 | 6.27 |
| 7/17/10 | 6.5 |
| 7/17/10 | 6.44 |
| 7/17/10 | 6.26 |
| 7/17/10 | 6.9 |
| 7/17/10 | 6.66 |
| 7/17/10 | 6.84 |
| 7/17/10 | 7.09 |
| 7/17/10 | 7.14 |
| 7/17/10 | 7.33 |
| 7/17/10 | 7.26 |
| 7/17/10 | 7.43 |
| 7/17/10 | 7.66 |
| 7/17/10 | 7.9 |
| 7/17/10 | 8.19 |
| 7/17/10 | 8.22 |
| 7/17/10 | 8.19 |
| 7/17/10 | 8.22 |
| 7/17/10 | 8.54 |
| 7/17/10 | 8.65 |
| 7/17/10 | 8.44 |
| 7/17/10 | 7.88 |
| 7/17/10 | 8.61 |
| 7/17/10 | 8.64 |
| 7/17/10 | 8.81 |
| 7/17/10 | 8.94 |
| 7/17/10 | 8.8 |
| 7/17/10 | 8.91 |
| 7/17/10 | 8.68 |
| 7/17/10 | 8.7 |
| 7/17/10 | 8.63 |
| 7/17/10 | 8.3 |
| 7/17/10 | 8.29 |
| 7/18/10 | 8.06 |
| 7/18/10 | 7.89 |
| 7/18/10 | 7.79 |
| 7/18/10 | 7.95 |
| 7/18/10 | 7.55 |
| 7/18/10 | 7.75 |
| 7/18/10 | 7.62 |
| 7/18/10 | 7.91 |
| 7/18/10 | 7.91 |
| 7/18/10 | 7.88 |
| 7/18/10 | 7.74 |
| 7/18/10 | 7.77 |
| 7/18/10 | 7.44 |
| 7/18/10 | 7.38 |
| 7/18/10 | 7.58 |
| 7/18/10 | 7.48 |
| 7/18/10 | 7.24 |
| 7/18/10 | 7.24 |
| 7/18/10 | 7.28 |
| 7/18/10 | 7.37 |
| 7/18/10 | 7.44 |
| 7/18/10 | 7.55 |
| 7/18/10 | 7.86 |
| 7/18/10 | 7.84 |
| 7/18/10 | 8.01 |
| 7/18/10 | 8.11 |
| 7/18/10 | 8.19 |
| 7/18/10 | 8.1 |
| 7/18/10 | 8.18 |
| 7/18/10 | 8.23 |
| 7/18/10 | 8.05 |
| 7/18/10 | 8.07 |
| 7/18/10 | 8.34 |
| 7/18/10 | 8.45 |
| 7/18/10 | 8.73 |
| 7/18/10 | 8.83 |
| 7/18/10 | 8.66 |
| 7/18/10 | 8.79 |
| 7/18/10 | 8.77 |
| 7/18/10 | 8.65 |
| 7/18/10 | 8.89 |
| 7/18/10 | 8.69 |
| 7/18/10 | 7.85 |
| 7/18/10 | 8.48 |
| 7/18/10 | 8.56 |
| 7/18/10 | 8.26 |
| 7/18/10 | 8.17 |
| 7/18/10 | 8.26 |
| 7/19/10 | 8.33 |
| 7/19/10 | 8.15 |
| 7/19/10 | 8.19 |
| 7/19/10 | 8.4 |
| 7/19/10 | 8.03 |
| 7/19/10 | 7.95 |
| 7/19/10 | 8.04 |
| 7/19/10 | 7.87 |
| 7/19/10 | 7.77 |
| 7/19/10 | 7.84 |
| 7/19/10 | 7.78 |
| 7/19/10 | 7.93 |
| 7/19/10 | 7.79 |
| 7/19/10 | 7.69 |
| 7/19/10 | 7.43 |
| 7/19/10 | 7.41 |
| 7/19/10 | 7.16 |
| 7/19/10 | 7.54 |
| 7/19/10 | 7.68 |
| 7/19/10 | 7.84 |
| 7/19/10 | 7.9 |
| 7/19/10 | 8 |
| 7/19/10 | 7.87 |
| 7/19/10 | 8.09 |
| 7/19/10 | 8.05 |
| 7/19/10 | 8 |
| 7/19/10 | 8.2 |
| 7/19/10 | 8.36 |
| 7/19/10 | 8.47 |
| 7/19/10 | 8.59 |
| 7/19/10 | 8.35 |
| 7/19/10 | 8.36 |
| 7/19/10 | 8.24 |
| 7/19/10 | 8.5 |
| 7/19/10 | 8.4 |
| 7/19/10 | 7.19 |
| 7/19/10 | 7.42 |
| 7/19/10 | 7.92 |
| 7/19/10 | 7.59 |
| 7/19/10 | 8.38 |
| 7/19/10 | 8.22 |
| 7/19/10 | 8.35 |
| 7/19/10 | 8.18 |
| 7/19/10 | 8.04 |
| 7/19/10 | 8.02 |
| 7/19/10 | 8.01 |
| 7/19/10 | 7.94 |
| 7/19/10 | 7.84 |
| 7/20/10 | 7.68 |
| 7/20/10 | 7.7 |
| 7/20/10 | 7.59 |
| 7/20/10 | 7.54 |
| 7/20/10 | 7.43 |
| 7/20/10 | 7.38 |
| 7/20/10 | 7.21 |
| 7/20/10 | 6.98 |
| 7/20/10 | 6.73 |
| 7/20/10 | 6.77 |
| 7/20/10 | 6.59 |
| 7/20/10 | 6.49 |
| 7/20/10 | 6.35 |
| 7/20/10 | 6.23 |
| 7/20/10 | 6.09 |
| 7/20/10 | 5.95 |
| 7/20/10 | 6.14 |
| 7/20/10 | 6.13 |
| 7/20/10 | 6.08 |
| 7/20/10 | 5.95 |
| 7/20/10 | 5.96 |
| 7/20/10 | 5.93 |
| 7/20/10 | 6.1 |
| 7/20/10 | 6.3 |
| 7/20/10 | 6.38 |
| 7/20/10 | 6.61 |
| 7/20/10 | 7.1 |
| 7/20/10 | 7.4 |
| 7/20/10 | 7.35 |
| 7/20/10 | 7.51 |
| 7/20/10 | 7.55 |
| 7/20/10 | 7.47 |
| 7/20/10 | 7.48 |
| 7/20/10 | 7.99 |
| 7/20/10 | 7.84 |
| 7/20/10 | 7.56 |
| 7/20/10 | 7.54 |
| 7/20/10 | 7.16 |
| 7/20/10 | 7.35 |
| 7/20/10 | 7.32 |
| 7/20/10 | 7.48 |
| 7/20/10 | 7.94 |
| 7/20/10 | 7.73 |
| 7/20/10 | 7.96 |
| 7/20/10 | 7.7 |
| 7/20/10 | 7.77 |
| 7/20/10 | 7.67 |
| 7/20/10 | 7.77 |
| 7/21/10 | 7.77 |
| 7/21/10 | 7.7 |
| 7/21/10 | 7.69 |
| 7/21/10 | 7.46 |
| 7/21/10 | 7.6 |
| 7/21/10 | 7.43 |
| 7/21/10 | 7.18 |
| 7/21/10 | 7.1 |
| 7/21/10 | 6.96 |
| 7/21/10 | 7.44 |
| 7/21/10 | 7.05 |
| 7/21/10 | 6.92 |
| 7/21/10 | 6.73 |
| 7/21/10 | 6.61 |
| 7/21/10 | 6.51 |
| 7/21/10 | 6.66 |
| 7/21/10 | 6.64 |
| 7/21/10 | 6.74 |
| 7/21/10 | 6.8 |
| 7/21/10 | 6.74 |
| 7/21/10 | 6.76 |
| 7/21/10 | 6.79 |
| 7/21/10 | 6.78 |
| 7/21/10 | 6.67 |
| 7/21/10 | 6.54 |
| 7/21/10 | 7.07 |
| 7/21/10 | 7.19 |
| 7/21/10 | 7.29 |
| 7/21/10 | 7.52 |
| 7/21/10 | 7.6 |
| 7/21/10 | 7.75 |
| 7/21/10 | 7.26 |
| 7/21/10 | 7.17 |
| 7/21/10 | 7.32 |
| 7/21/10 | 8.18 |
| 7/21/10 | 8.18 |
| 7/21/10 | 8.19 |
| 7/21/10 | 7.89 |
| 7/21/10 | 7.95 |
| 7/21/10 | 7.84 |
| 7/21/10 | 7.97 |
| 7/21/10 | 8.01 |
| 7/21/10 | 7.67 |
| 7/21/10 | 8.16 |
| 7/21/10 | 7.98 |
| 7/21/10 | 7.65 |
| 7/21/10 | 7.5 |
| 7/21/10 | 7.72 |
| 7/22/10 | 7.61 |
| 7/22/10 | 7.45 |
| 7/22/10 | 7.2 |
| 7/22/10 | 7.16 |
| 7/22/10 | 7.25 |
| 7/22/10 | 7.13 |
| 7/22/10 | 7.11 |
| 7/22/10 | 7.05 |
| 7/22/10 | 7.17 |
| 7/22/10 | 6.84 |
| 7/22/10 | 6.83 |
| 7/22/10 | 6.73 |
| 7/22/10 | 6.53 |
| 7/22/10 | 6.6 |
| 7/22/10 | 6.24 |
| 7/22/10 | 6.09 |
| 7/22/10 | 6.08 |
| 7/22/10 | 6.05 |
| 7/22/10 | 6.09 |
| 7/22/10 | 6.47 |
| 7/22/10 | 6.39 |
| 7/22/10 | 6.5 |
| 7/22/10 | 6.54 |
| 7/22/10 | 7.08 |
| 7/22/10 | 7.22 |
| 7/22/10 | 7.38 |
| 7/22/10 | 7.15 |
| 7/22/10 | 7.31 |
| 7/22/10 | 8.05 |
| 7/22/10 | 7.9 |
| 7/22/10 | 8.13 |
| 7/22/10 | 8.17 |
| 7/22/10 | 8.39 |
| 7/22/10 | 8.27 |
| 7/22/10 | 8.3 |
| 7/22/10 | 8.24 |
| 7/22/10 | 8.11 |
| 7/22/10 | 8.22 |
| 7/22/10 | 8.24 |
| 7/22/10 | 8.33 |
| 7/22/10 | 8.46 |
| 7/22/10 | 8.43 |
| 7/22/10 | 8.6 |
| 7/22/10 | 7.93 |
| 7/22/10 | 8.3 |
| 7/22/10 | 8.41 |
| 7/22/10 | 8.3 |
| 7/22/10 | 8.13 |
| 7/23/10 | 7.96 |
| 7/23/10 | 7.98 |
| 7/23/10 | 8.05 |
| 7/23/10 | 8.04 |
| 7/23/10 | 7.96 |
| 7/23/10 | 8.04 |
| 7/23/10 | 7.95 |
| 7/23/10 | 7.86 |
| 7/23/10 | 7.76 |
| 7/23/10 | 7.6 |
| 7/23/10 | 7.53 |
| 7/23/10 | 7.64 |
| 7/23/10 | 7.6 |
| 7/23/10 | 7.57 |
| 7/23/10 | 7.48 |
| 7/23/10 | 7.54 |
| 7/23/10 | 7.65 |
| 7/23/10 | 7.52 |
| 7/23/10 | 7.63 |
| 7/23/10 | 7.67 |
| 7/23/10 | 7.92 |
| 7/23/10 | 7.75 |
| 7/23/10 | 7.67 |
| 7/23/10 | 7.96 |
| 7/23/10 | 7.51 |
| 7/23/10 | 7.51 |
| 7/23/10 | 7.41 |
| 7/23/10 | 7.4 |
| 7/23/10 | 7.09 |
| 7/23/10 | 7.86 |
| 7/23/10 | 7.68 |
| 7/23/10 | 8.15 |
| 7/23/10 | 8.06 |
| 7/23/10 | 8.15 |
| 7/23/10 | 8 |
| 7/23/10 | 8.17 |
| 7/23/10 | 8.4 |
| 7/23/10 | 8.47 |
| 7/23/10 | 8.48 |
| 7/23/10 | 8.51 |
| 7/23/10 | 8.52 |
| 7/23/10 | 9.22 |
| 7/23/10 | 8.87 |
| 7/23/10 | 8.79 |
| 7/23/10 | 8.71 |
| 7/23/10 | 7.53 |
| 7/23/10 | 8.02 |
| 7/23/10 | 8.2 |
| 7/24/10 | 8.07 |
| 7/24/10 | 7.89 |
| 7/24/10 | 8.02 |
| 7/24/10 | 7.88 |
| 7/24/10 | 7.78 |
| 7/24/10 | 7.45 |
| 7/24/10 | 7.56 |
| 7/24/10 | 7.46 |
| 7/24/10 | 7.33 |
| 7/24/10 | 7.27 |
| 7/24/10 | 7.34 |
| 7/24/10 | 7.27 |
| 7/24/10 | 7.22 |
| 7/24/10 | 7.09 |
| 7/24/10 | 7 |
| 7/24/10 | 6.83 |
| 7/24/10 | 6.85 |
| 7/24/10 | 6.89 |
| 7/24/10 | 6.96 |
| 7/24/10 | 7.07 |
| 7/24/10 | 7.4 |
| 7/24/10 | 7.41 |
| 7/24/10 | 7.72 |
| 7/24/10 | 7.84 |
| 7/24/10 | 7.92 |
| 7/24/10 | 7.96 |
| 7/24/10 | 7.77 |
| 7/24/10 | 7.62 |
| 7/24/10 | 7.27 |
| 7/24/10 | 7.37 |
| 7/24/10 | 7.19 |
| 7/24/10 | 7.45 |
| 7/24/10 | 8.05 |
| 7/24/10 | 7.96 |
| 7/24/10 | 7.99 |
| 7/24/10 | 8.47 |
| 7/24/10 | 8.69 |
| 7/24/10 | 8.69 |
| 7/24/10 | 8.62 |
| 7/24/10 | 8.72 |
| 7/24/10 | 8.56 |
| 7/24/10 | 8.52 |
| 7/24/10 | 8.45 |
| 7/24/10 | 8.58 |
| 7/24/10 | 8.33 |
| 7/24/10 | 8.18 |
| 7/24/10 | 8.39 |
| 7/24/10 | 7.91 |
| 7/25/10 | 7.78 |
| 7/25/10 | 7.9 |
| 7/25/10 | 7.77 |
| 7/25/10 | 7.82 |
| 7/25/10 | 7.64 |
| 7/25/10 | 7.56 |
| 7/25/10 | 7.59 |
| 7/25/10 | 7.36 |
| 7/25/10 | 7.35 |
| 7/25/10 | 7.24 |
| 7/25/10 | 7.18 |
| 7/25/10 | 7.04 |
| 7/25/10 | 7.12 |
| 7/25/10 | 6.84 |
| 7/25/10 | 6.69 |
| 7/25/10 | 7.02 |
| 7/25/10 | 7.06 |
| 7/25/10 | 7.09 |
| 7/25/10 | 6.91 |
| 7/25/10 | 6.96 |
| 7/25/10 | 6.91 |
| 7/25/10 | 6.99 |
| 7/25/10 | 7.01 |
| 7/25/10 | 6.83 |
| 7/25/10 | 6.88 |
| 7/25/10 | 7.02 |
| 7/25/10 | 7.14 |
| 7/25/10 | 7.18 |
| 7/25/10 | 7.23 |
| 7/25/10 | 7.58 |
| 7/25/10 | 7.68 |
| 7/25/10 | 7.84 |
| 7/25/10 | 7.83 |
| 7/25/10 | 7.97 |
| 7/25/10 | 8.47 |
| 7/25/10 | 8.51 |
| 7/25/10 | 8.44 |
| 7/25/10 | 7.99 |
| 7/25/10 | 8.23 |
| 7/25/10 | 7.61 |
| 7/25/10 | 8.18 |
| 7/25/10 | 8.04 |
| 7/25/10 | 8.23 |
| 7/25/10 | 7.84 |
| 7/25/10 | 7.96 |
| 7/25/10 | 7.81 |
| 7/25/10 | 7.76 |
| 7/25/10 | 7.33 |
| 7/26/10 | 7.64 |
| 7/26/10 | 7.35 |
| 7/26/10 | 7.03 |
| 7/26/10 | 7.23 |
| 7/26/10 | 6.54 |
| 7/26/10 | 6.53 |
| 7/26/10 | 6.49 |
| 7/26/10 | 6.53 |
| 7/26/10 | 6.46 |
| 7/26/10 | 6.39 |
| 7/26/10 | 6.2 |
| 7/26/10 | 6.13 |
| 7/26/10 | 6.17 |
| 7/26/10 | 5.98 |
| 7/26/10 | 5.79 |
| 7/26/10 | 5.79 |
| 7/26/10 | 5.96 |
| 7/26/10 | 5.91 |
| 7/26/10 | 5.93 |
| 7/26/10 | 6.08 |
| 7/26/10 | 6.1 |
| 7/26/10 | 6.3 |
| 7/26/10 | 6.63 |
| 7/26/10 | 6.6 |
| 7/26/10 | 6.68 |
| 7/26/10 | 6.88 |
| 7/26/10 | 7.2 |
| 7/26/10 | 7.16 |
| 7/26/10 | 7.35 |
| 7/26/10 | 7.4 |
| 7/26/10 | 7.41 |
| 7/26/10 | 7.85 |
| 7/26/10 | 7.97 |
| 7/26/10 | 8.13 |
| 7/26/10 | 8.03 |
| 7/26/10 | 7.99 |
| 7/26/10 | 8.23 |
| 7/26/10 | 7.81 |
| 7/26/10 | 8.3 |
| 7/26/10 | 8.22 |
| 7/26/10 | 8.5 |
| 7/26/10 | 8.7 |
| 7/26/10 | 7.91 |
| 7/26/10 | 8.26 |
| 7/26/10 | 8.14 |
| 7/26/10 | 7.85 |
| 7/26/10 | 7.81 |
| 7/26/10 | 7.79 |
| 7/27/10 | 7.73 |
| 7/27/10 | 7.71 |
| 7/27/10 | 7.61 |
| 7/27/10 | 7.54 |
| 7/27/10 | 7.47 |
| 7/27/10 | 7.53 |
| 7/27/10 | 7.5 |
| 7/27/10 | 7.36 |
| 7/27/10 | 7.3 |
| 7/27/10 | 7.27 |
| 7/27/10 | 7.14 |
| 7/27/10 | 7.05 |
| 7/27/10 | 6.51 |
| 7/27/10 | 6.68 |
| 7/27/10 | 6.39 |
| 7/27/10 | 6.4 |
| 7/27/10 | 6.36 |
| 7/27/10 | 6.34 |
| 7/27/10 | 6.33 |
| 7/27/10 | 6.24 |
| 7/27/10 | 6.17 |
| 7/27/10 | 6.12 |
| 7/27/10 | 6.53 |
| 7/27/10 | 6.9 |
| 7/27/10 | 7.08 |
| 7/27/10 | 7.26 |
| 7/27/10 | 7.33 |
| 7/27/10 | 7.28 |
| 7/27/10 | 7.38 |
| 7/27/10 | 7.66 |
| 7/27/10 | 7.52 |
| 7/27/10 | 7.75 |
| 7/27/10 | 8.25 |
| 7/27/10 | 7.99 |
| 7/27/10 | 8.28 |
| 7/27/10 | 8.66 |
| 7/27/10 | 8.34 |
| 7/27/10 | 8.88 |
| 7/27/10 | 8.45 |
| 7/27/10 | 8.32 |
| 7/27/10 | 8.49 |
| 7/27/10 | 8.7 |
| 7/27/10 | 7.32 |
| 7/27/10 | 7.86 |
| 7/27/10 | 8.03 |
| 7/27/10 | 8.38 |
| 7/27/10 | 8.1 |
| 7/27/10 | 8.07 |
| 7/28/10 | 8.23 |
| 7/28/10 | 8.06 |
| 7/28/10 | 7.81 |
| 7/28/10 | 8.08 |
| 7/28/10 | 8.1 |
| 7/28/10 | 8.02 |
| 7/28/10 | 7.96 |
| 7/28/10 | 8.06 |
| 7/28/10 | 7.91 |
| 7/28/10 | 7.96 |
| 7/28/10 | 7.85 |
| 7/28/10 | 7.63 |
| 7/28/10 | 7.59 |
| 7/28/10 | 7.32 |
| 7/28/10 | 7.23 |
| 7/28/10 | 6.81 |
| 7/28/10 | 6.97 |
| 7/28/10 | 7.05 |
| 7/28/10 | 7.26 |
| 7/28/10 | 7.05 |
| 7/28/10 | 7.2 |
| 7/28/10 | 7.34 |
| 7/28/10 | 7.43 |
| 7/28/10 | 7.69 |
| 7/28/10 | 7.69 |
| 7/28/10 | 7.63 |
| 7/28/10 | 7.93 |
| 7/28/10 | 7.88 |
| 7/28/10 | 8.32 |
| 7/28/10 | 8.35 |
| 7/28/10 | 8.56 |
| 7/28/10 | 8.51 |
| 7/28/10 | 8.63 |
| 7/28/10 | 8.75 |
| 7/28/10 | 9.17 |
| 7/28/10 | 9 |
| 7/28/10 | 9.05 |
| 7/28/10 | 9.04 |
| 7/28/10 | 8.93 |
| 7/28/10 | 9.18 |
| 7/28/10 | 9 |
| 7/28/10 | 9.14 |
| 7/28/10 | 9.04 |
| 7/28/10 | 8.96 |
| 7/28/10 | 8.71 |
| 7/28/10 | 7.43 |
| 7/28/10 | 7.81 |
| 7/28/10 | 8.06 |
| 7/29/10 | 8.36 |
| 7/29/10 | 8.22 |
| 7/29/10 | 8.61 |
| 7/29/10 | 8.19 |
| 7/29/10 | 8.36 |
| 7/29/10 | 8.33 |
| 7/29/10 | 8.3 |
| 7/29/10 | 7.92 |
| 7/29/10 | 7.71 |
| 7/29/10 | 7.86 |
| 7/29/10 | 8.06 |
| 7/29/10 | 7.94 |
| 7/29/10 | 7.79 |
| 7/29/10 | 7.72 |
| 7/29/10 | 7.82 |
| 7/29/10 | 7.69 |
| 7/29/10 | 7.48 |
| 7/29/10 | 7.33 |
| 7/29/10 | 7.35 |
| 7/29/10 | 7.44 |
| 7/29/10 | 7.42 |
| 7/29/10 | 7.83 |
| 7/29/10 | 8.02 |
| 7/29/10 | 7.98 |
| 7/29/10 | 8.05 |
| 7/29/10 | 8.27 |
| 7/29/10 | 8.64 |
| 7/29/10 | 8.67 |
| 7/29/10 | 8.9 |
| 7/29/10 | 9.27 |
| 7/29/10 | 8.54 |
| 7/29/10 | 8.2 |
| 7/29/10 | 8.56 |
| 7/29/10 | 9.28 |
| 7/29/10 | 9.38 |
| 7/29/10 | 9.63 |
| 7/29/10 | 9.76 |
| 7/29/10 | 9.68 |
| 7/29/10 | 9.42 |
| 7/29/10 | 8.9 |
| 7/29/10 | 8.92 |
| 7/29/10 | 8.87 |
| 7/29/10 | 8.89 |
| 7/29/10 | 8.72 |
| 7/29/10 | 8.63 |
| 7/29/10 | 8.58 |
| 7/29/10 | 8.34 |
| 7/29/10 | 8.3 |
| 7/30/10 | 8.31 |
| 7/30/10 | 8.01 |
| 7/30/10 | 7.92 |
| 7/30/10 | 7.85 |
| 7/30/10 | 7.61 |
| 7/30/10 | 7.41 |
| 7/30/10 | 7.32 |
| 7/30/10 | 7.17 |
| 7/30/10 | 7 |
| 7/30/10 | 6.9 |
| 7/30/10 | 6.7 |
| 7/30/10 | 6.66 |
| 7/30/10 | 6.5 |
| 7/30/10 | 6.4 |
| 7/30/10 | 6.41 |
| 7/30/10 | 6.29 |
| 7/30/10 | 6.34 |
| 7/30/10 | 6.37 |
| 7/30/10 | 6.32 |
| 7/30/10 | 6.41 |
| 7/30/10 | 6.39 |
| 7/30/10 | 6.23 |
| 7/30/10 | 6.6 |
| 7/30/10 | 6.62 |
| 7/30/10 | 7.44 |
| 7/30/10 | 7.68 |
| 7/30/10 | 7.54 |
| 7/30/10 | 7.61 |
| 7/30/10 | 7.93 |
| 7/30/10 | 7.92 |
| 7/30/10 | 8.18 |
| 7/30/10 | 8.1 |
| 7/30/10 | 8.15 |
| 7/30/10 | 8.39 |
| 7/30/10 | 8.68 |
| 7/30/10 | 8.96 |
| 7/30/10 | 8.89 |
| 7/30/10 | 8.78 |
| 7/30/10 | 8.85 |
| 7/30/10 | 8.8 |
| 7/30/10 | 8.5 |
| 7/30/10 | 8.67 |
| 7/30/10 | 8.83 |
| 7/30/10 | 9.02 |
| 7/30/10 | 8.85 |
| 7/30/10 | 8.98 |
| 7/30/10 | 8.66 |
| 7/30/10 | 8.51 |
| 7/31/10 | 8.31 |
| 7/31/10 | 8.29 |
| 7/31/10 | 8.15 |
| 7/31/10 | 8.01 |
| 7/31/10 | 8.02 |
| 7/31/10 | 7.71 |
| 7/31/10 | 7.69 |
| 7/31/10 | 7.43 |
| 7/31/10 | 7.02 |
| 7/31/10 | 6.99 |
| 7/31/10 | 6.81 |
| 7/31/10 | 6.72 |
| 7/31/10 | 6.74 |
| 7/31/10 | 6.65 |
| 7/31/10 | 6.56 |
| 7/31/10 | 6.43 |
| 7/31/10 | 6.47 |
| 7/31/10 | 6.52 |
| 7/31/10 | 6.56 |
| 7/31/10 | 6.26 |
| 7/31/10 | 6.2 |
| 7/31/10 | 6.19 |
| 7/31/10 | 6.5 |
| 7/31/10 | 6.97 |
| 7/31/10 | 5.69 |
| 7/31/10 | 6.56 |
| 7/31/10 | 6.63 |
| 7/31/10 | 8.02 |
| 7/31/10 | 7.96 |
| 7/31/10 | 8.19 |
| 7/31/10 | 8.05 |
| 7/31/10 | 8.26 |
| 7/31/10 | 8.87 |
| 7/31/10 | 8.9 |
| 7/31/10 | 8.94 |
| 7/31/10 | 8.78 |
| 7/31/10 | 8.58 |
| 7/31/10 | 8.35 |
| 7/31/10 | 8.23 |
| 7/31/10 | 9.04 |
| 7/31/10 | 8.64 |
| 7/31/10 | 8.62 |
| 7/31/10 | 8.68 |
| 7/31/10 | 8.53 |
| 7/31/10 | 8.41 |
| 7/31/10 | 8.41 |
| 7/31/10 | 8.46 |
| 7/31/10 | 8.34 |
| 8/1/10 | 8.19 |
| 8/1/10 | 8.22 |
| 8/1/10 | 8.31 |
| 8/1/10 | 8.33 |
| 8/1/10 | 8.36 |
| 8/1/10 | 8.44 |
| 8/1/10 | 8.34 |
| 8/1/10 | 8.25 |
| 8/1/10 | 8.09 |
| 8/1/10 | 8.06 |
| 8/1/10 | 7.96 |
| 8/1/10 | 7.7 |
| 8/1/10 | 7.62 |
| 8/1/10 | 7.31 |
| 8/1/10 | 7.22 |
| 8/1/10 | 7.03 |
| 8/1/10 | 6.93 |
| 8/1/10 | 7.01 |
| 8/1/10 | 7.04 |
| 8/1/10 | 7.01 |
| 8/1/10 | 7 |
| 8/1/10 | 6.97 |
| 8/1/10 | 7.12 |
| 8/1/10 | 7.25 |
| 8/1/10 | 7.64 |
| 8/1/10 | 8.06 |
| 8/1/10 | 8.09 |
| 8/1/10 | 8.2 |
| 8/1/10 | 8.44 |
| 8/1/10 | 8.52 |
| 8/1/10 | 8.7 |
| 8/1/10 | 8.74 |
| 8/1/10 | 8.94 |
| 8/1/10 | 9.04 |
| 8/1/10 | 9.24 |
| 8/1/10 | 9.21 |
| 8/1/10 | 9.22 |
| 8/1/10 | 9.36 |
| 8/1/10 | 9.4 |
| 8/1/10 | 9.35 |
| 8/1/10 | 8.75 |
| 8/1/10 | 9.03 |
| 8/1/10 | 8.91 |
| 8/1/10 | 8.7 |
| 8/1/10 | 8.69 |
| 8/1/10 | 8.54 |
| 8/1/10 | 8.67 |
| 8/1/10 | 8.72 |
| 8/2/10 | 8.7 |
| 8/2/10 | 8.73 |
| 8/2/10 | 8.57 |
| 8/2/10 | 8.38 |
| 8/2/10 | 8.31 |
| 8/2/10 | 8.33 |
| 8/2/10 | 8.33 |
| 8/2/10 | 8.21 |
| 8/2/10 | 8.06 |
| 8/2/10 | 7.98 |
| 8/2/10 | 7.71 |
| 8/2/10 | 7.56 |
| 8/2/10 | 7.33 |
| 8/2/10 | 7.3 |
| 8/2/10 | 7.02 |
| 8/2/10 | 6.28 |
| 8/2/10 | 6.96 |
| 8/2/10 | 6.91 |
| 8/2/10 | 6.99 |
| 8/2/10 | 6.96 |
| 8/2/10 | 6.91 |
| 8/2/10 | 6.91 |
| 8/2/10 | 6.99 |
| 8/2/10 | 7.23 |
| 8/2/10 | 7.42 |
| 8/2/10 | 7.39 |
| 8/2/10 | 7.84 |
| 8/2/10 | 7.9 |
| 8/2/10 | 8.06 |
| 8/2/10 | 8.17 |
| 8/2/10 | 8.24 |
| 8/2/10 | 8.36 |
| 8/2/10 | 8.39 |
| 8/2/10 | 8.74 |
| 8/2/10 | 8.85 |
| 8/2/10 | 9.37 |
| 8/2/10 | 9.41 |
| 8/2/10 | 9.5 |
| 8/2/10 | 9.56 |
| 8/2/10 | 9.33 |
| 8/2/10 | 9.74 |
| 8/2/10 | 9.56 |
| 8/2/10 | 9.45 |
| 8/2/10 | 8.91 |
| 8/2/10 | 9.24 |
| 8/2/10 | 9 |
| 8/2/10 | 8.82 |
| 8/2/10 | 8.97 |
| 8/3/10 | 8.91 |
| 8/3/10 | 8.73 |
| 8/3/10 | 8.67 |
| 8/3/10 | 8.57 |
| 8/3/10 | 8.47 |
| 8/3/10 | 8.34 |
| 8/3/10 | 8.06 |
| 8/3/10 | 8.21 |
| 8/3/10 | 7.97 |
| 8/3/10 | 8.14 |
| 8/3/10 | 8.07 |
| 8/3/10 | 8.24 |
| 8/3/10 | 8.22 |
| 8/3/10 | 8.31 |
| 8/3/10 | 8.19 |
| 8/3/10 | 8.24 |
| 8/3/10 | 8.22 |
| 8/3/10 | 8.16 |
| 8/3/10 | 8.12 |
| 8/3/10 | 8.38 |
| 8/3/10 | 8.3 |
| 8/3/10 | 7.97 |
| 8/3/10 | 7.7 |
| 8/3/10 | 8.13 |
| 8/3/10 | 8.13 |
| 8/3/10 | 8.17 |
| 8/3/10 | 8.12 |
| 8/3/10 | 8.32 |
| 8/3/10 | 8.3 |
| 8/3/10 | 8.23 |
| 8/3/10 | 8.24 |
| 8/3/10 | 8.42 |
| 8/3/10 | 8.5 |
| 8/3/10 | 8.3 |
| 8/3/10 | 8.69 |
| 8/3/10 | 8.69 |
| 8/3/10 | 8.98 |
| 8/3/10 | 9.41 |
| 8/3/10 | 9.18 |
| 8/3/10 | 9.04 |
| 8/3/10 | 9.16 |
| 8/3/10 | 8.94 |
| 8/3/10 | 9.48 |
| 8/3/10 | 9.7 |
| 8/3/10 | 9.47 |
| 8/3/10 | 9.37 |
| 8/3/10 | 9.26 |
| 8/3/10 | 9.11 |
| 8/4/10 | 9.06 |
| 8/4/10 | 8.83 |
| 8/4/10 | 8.56 |
| 8/4/10 | 8.33 |
| 8/4/10 | 8.36 |
| 8/4/10 | 8.11 |
| 8/4/10 | 7.68 |
| 8/4/10 | 7.55 |
| 8/4/10 | 7.48 |
| 8/4/10 | 7.4 |
| 8/4/10 | 7.31 |
| 8/4/10 | 7.27 |
| 8/4/10 | 6.95 |
| 8/4/10 | 6.74 |
| 8/4/10 | 6.76 |
| 8/4/10 | 6.82 |
| 8/4/10 | 6.69 |
| 8/4/10 | 6.81 |
| 8/4/10 | 6.9 |
| 8/4/10 | 6.78 |
| 8/4/10 | 6.82 |
| 8/4/10 | 6.97 |
| 8/4/10 | 7.1 |
| 8/4/10 | 7.63 |
| 8/4/10 | 7.59 |
| 8/4/10 | 7.8 |
| 8/4/10 | 8.08 |
| 8/4/10 | 8.14 |
| 8/4/10 | 8.13 |
| 8/4/10 | 8.36 |
| 8/4/10 | 8.42 |
| 8/4/10 | 8.41 |
| 8/4/10 | 9.27 |
| 8/4/10 | 9.73 |
| 8/4/10 | 9.12 |
| 8/4/10 | 10.18 |
| 8/4/10 | 8.71 |
| 8/4/10 | 9.55 |
| 8/4/10 | 9.12 |
| 8/4/10 | 9.41 |
| 8/4/10 | 9.22 |
| 8/4/10 | 9.06 |
| 8/4/10 | 8.32 |
| 8/4/10 | 8.25 |
| 8/4/10 | 7.83 |
| 8/4/10 | 7.66 |
| 8/4/10 | 8.28 |
| 8/4/10 | 8.54 |
| 8/5/10 | 7.63 |
| 8/5/10 | 8.15 |
| 8/5/10 | 8.4 |
| 8/5/10 | 8.39 |
| 8/5/10 | 8.2 |
| 8/5/10 | 8.18 |
| 8/5/10 | 8.26 |
| 8/5/10 | 8.09 |
| 8/5/10 | 7.86 |
| 8/5/10 | 7.76 |
| 8/5/10 | 7.74 |
| 8/5/10 | 7.93 |
| 8/5/10 | 6.79 |
| 8/5/10 | 6.86 |
| 8/5/10 | 6.96 |
| 8/5/10 | 7.37 |
| 8/5/10 | 7.48 |
| 8/5/10 | 7.35 |
| 8/5/10 | 7.29 |
| 8/5/10 | 7.37 |
| 8/5/10 | 7.28 |
| 8/5/10 | 7.28 |
| 8/5/10 | 7.42 |
| 8/5/10 | 7.41 |
| 8/5/10 | 7.29 |
| 8/5/10 | 7.46 |
| 8/5/10 | 7.62 |
| 8/5/10 | 7.59 |
| 8/5/10 | 6.8 |
| 8/5/10 | 7.33 |
| 8/5/10 | 7.7 |
| 8/5/10 | 8.13 |
| 8/5/10 | 8.49 |
| 8/5/10 | 8.54 |
| 8/5/10 | 8.92 |
| 8/5/10 | 9.02 |
| 8/5/10 | 9.01 |
| 8/5/10 | 8.56 |
| 8/5/10 | 8.44 |
| 8/5/10 | 8.26 |
| 8/5/10 | 8.96 |
| 8/5/10 | 9 |
| 8/5/10 | 8.79 |
| 8/5/10 | 8.78 |
| 8/5/10 | 8.73 |
| 8/5/10 | 8.16 |
| 8/5/10 | 7.83 |
| 8/5/10 | 7.85 |
| 8/6/10 | 7.86 |
| 8/6/10 | 8 |
| 8/6/10 | 8.19 |
| 8/6/10 | 8.34 |
| 8/6/10 | 8.04 |
| 8/6/10 | 7.93 |
| 8/6/10 | 7.84 |
| 8/6/10 | 7.67 |
| 8/6/10 | 7.38 |
| 8/6/10 | 7.32 |
| 8/6/10 | 7.2 |
| 8/6/10 | 6.97 |
| 8/6/10 | 6.75 |
| 8/6/10 | 6.68 |
| 8/6/10 | 6.51 |
| 8/6/10 | 6.53 |
| 8/6/10 | 6.81 |
| 8/6/10 | 7.03 |
| 8/6/10 | 6.81 |
| 8/6/10 | 7.09 |
| 8/6/10 | 7.27 |
| 8/6/10 | 7.37 |
| 8/6/10 | 7.5 |
| 8/6/10 | 7.44 |
| 8/6/10 | 7.76 |
| 8/6/10 | 8.17 |
| 8/6/10 | 7.97 |
| 8/6/10 | 8.21 |
| 8/6/10 | 8.44 |
| 8/6/10 | 8.43 |
| 8/6/10 | 8.31 |
| 8/6/10 | 8.32 |
| 8/6/10 | 8.03 |
| 8/6/10 | 8.05 |
| 8/6/10 | 8.45 |
| 8/6/10 | 8.49 |
| 8/6/10 | 8.94 |
| 8/6/10 | 9.03 |
| 8/6/10 | 9.65 |
| 8/6/10 | 9.46 |
| 8/6/10 | 9.38 |
| 8/6/10 | 8.83 |
| 8/6/10 | 9.53 |
| 8/6/10 | 9.3 |
| 8/6/10 | 9.06 |
| 8/6/10 | 9.17 |
| 8/6/10 | 9.04 |
| 8/6/10 | 8.89 |
| 8/7/10 | 8.81 |
| 8/7/10 | 8.57 |
| 8/7/10 | 8.2 |
| 8/7/10 | 8.1 |
| 8/7/10 | 7.97 |
| 8/7/10 | 7.83 |
| 8/7/10 | 7.66 |
| 8/7/10 | 7.51 |
| 8/7/10 | 7.39 |
| 8/7/10 | 7.34 |
| 8/7/10 | 7.1 |
| 8/7/10 | 7 |
| 8/7/10 | 6.81 |
| 8/7/10 | 6.72 |
| 8/7/10 | 6.81 |
| 8/7/10 | 6.77 |
| 8/7/10 | 6.76 |
| 8/7/10 | 6.55 |
| 8/7/10 | 6.68 |
| 8/7/10 | 7.04 |
| 8/7/10 | 7.31 |
| 8/7/10 | 7.52 |
| 8/7/10 | 7.7 |
| 8/7/10 | 7.94 |
| 8/7/10 | 8.21 |
| 8/7/10 | 8.11 |
| 8/7/10 | 8.51 |
| 8/7/10 | 8.55 |
| 8/7/10 | 8.66 |
| 8/7/10 | 9.1 |
| 8/7/10 | 9.05 |
| 8/7/10 | 8.92 |
| 8/7/10 | 9.39 |
| 8/7/10 | 9.9 |
| 8/7/10 | 9.7 |
| 8/7/10 | 9.95 |
| 8/7/10 | 9.91 |
| 8/7/10 | 10.33 |
| 8/7/10 | 10.34 |
| 8/7/10 | 10.32 |
| 8/7/10 | 10.2 |
| 8/7/10 | 10.15 |
| 8/7/10 | 10.36 |
| 8/7/10 | 10.2 |
| 8/7/10 | 10.34 |
| 8/7/10 | 10.2 |
| 8/7/10 | 10.11 |
| 8/7/10 | 9.85 |
| 8/8/10 | 9.58 |
| 8/8/10 | 9.25 |
| 8/8/10 | 9.02 |
| 8/8/10 | 8.84 |
| 8/8/10 | 9.57 |
| 8/8/10 | 9.5 |
| 8/8/10 | 9.31 |
| 8/8/10 | 9.15 |
| 8/8/10 | 9.25 |
| 8/8/10 | 9.07 |
| 8/8/10 | 8.81 |
| 8/8/10 | 8.49 |
| 8/8/10 | 8.32 |
| 8/8/10 | 8.09 |
| 8/8/10 | 8.02 |
| 8/8/10 | 7.9 |
| 8/8/10 | 7.81 |
| 8/8/10 | 7.85 |
| 8/8/10 | 7.71 |
| 8/8/10 | 7.71 |
| 8/8/10 | 7.66 |
| 8/8/10 | 7.72 |
| 8/8/10 | 7.28 |
| 8/8/10 | 8.09 |
| 8/8/10 | 8.42 |
| 8/8/10 | 8.29 |
| 8/8/10 | 8.42 |
| 8/8/10 | 8.86 |
| 8/8/10 | 9.19 |
| 8/8/10 | 9.67 |
| 8/8/10 | 9.59 |
| 8/8/10 | 9.75 |
| 8/8/10 | 10.27 |
| 8/8/10 | 10.43 |
| 8/8/10 | 10.43 |
| 8/8/10 | 10.49 |
| 8/8/10 | 10.55 |
| 8/8/10 | 10.77 |
| 8/8/10 | 10.55 |
| 8/8/10 | 10.63 |
| 8/8/10 | 10.63 |
| 8/8/10 | 9.31 |
| 8/8/10 | 9.21 |
| 8/8/10 | 9.84 |
| 8/8/10 | 9.9 |
| 8/8/10 | 10.06 |
| 8/8/10 | 9.96 |
| 8/8/10 | 10.14 |
| 8/9/10 | 9.94 |
| 8/9/10 | 10.06 |
| 8/9/10 | 10.04 |
| 8/9/10 | 10.07 |
| 8/9/10 | 10.09 |
| 8/9/10 | 10.19 |
| 8/9/10 | 10.03 |
| 8/9/10 | 9.61 |
| 8/9/10 | 9.61 |
| 8/9/10 | 9.84 |
| 8/9/10 | 9.87 |
| 8/9/10 | 9.86 |
| 8/9/10 | 9.59 |
| 8/9/10 | 9.55 |
| 8/9/10 | 9.44 |
| 8/9/10 | 9.35 |
| 8/9/10 | 9.47 |
| 8/9/10 | 9.37 |
| 8/9/10 | 9.39 |
| 8/9/10 | 9.42 |
| 8/9/10 | 9.14 |
| 8/9/10 | 9.14 |
| 8/9/10 | 9.19 |
| 8/9/10 | 9.47 |
| 8/9/10 | 9.69 |
| 8/9/10 | 9.63 |
| 8/9/10 | 9.74 |
| 8/9/10 | 10.06 |
| 8/9/10 | 10.3 |
| 8/9/10 | 10.51 |
| 8/9/10 | 10.63 |
| 8/9/10 | 10.85 |
| 8/9/10 | 10.85 |
| 8/9/10 | 11.48 |
| 8/9/10 | 11.15 |
| 8/9/10 | 11.22 |
| 8/9/10 | 11.51 |
| 8/9/10 | 11.4 |
| 8/9/10 | 11.3 |
| 8/9/10 | 11.6 |
| 8/9/10 | 11.58 |
| 8/9/10 | 11.61 |
| 8/9/10 | 11.21 |
| 8/9/10 | 11.24 |
| 8/9/10 | 10.99 |
| 8/9/10 | 10.44 |
| 8/9/10 | 10.78 |
| 8/9/10 | 10.86 |
| 8/10/10 | 10.65 |
| 8/10/10 | 10.89 |
| 8/10/10 | 10.59 |
| 8/10/10 | 10.7 |
| 8/10/10 | 11.1 |
| 8/10/10 | 11.09 |
| 8/10/10 | 11.24 |
| 8/10/10 | 11.24 |
| 8/10/10 | 11.09 |
| 8/10/10 | 11.02 |
| 8/10/10 | 10.89 |
| 8/10/10 | 10.8 |
| 8/10/10 | 10.67 |
| 8/10/10 | 10.64 |
| 8/10/10 | 10.52 |
| 8/10/10 | 10.29 |
| 8/10/10 | 10.29 |
| 8/10/10 | 10.34 |
| 8/10/10 | 10.39 |
| 8/10/10 | 10.55 |
| 8/10/10 | 10.54 |
| 8/10/10 | 10.59 |
| 8/10/10 | 10.74 |
| 8/10/10 | 10.82 |
| 8/10/10 | 10.85 |
| 8/10/10 | 10.84 |
| 8/10/10 | 10.95 |
| 8/10/10 | 10.71 |
| 8/10/10 | 10.48 |
| 8/10/10 | 10.55 |
| 8/10/10 | 11.01 |
| 8/10/10 | 11.7 |
| 8/10/10 | 11.55 |
| 8/10/10 | 11.66 |
| 8/10/10 | 11.59 |
| 8/10/10 | 11.55 |
| 8/10/10 | 12.17 |
| 8/10/10 | 12.01 |
| 8/10/10 | 12.14 |
| 8/10/10 | 12.5 |
| 8/10/10 | 11.86 |
| 8/10/10 | 12.33 |
| 8/10/10 | 12.09 |
| 8/10/10 | 12.25 |
| 8/10/10 | 12.57 |
| 8/10/10 | 11.88 |
| 8/10/10 | 12.27 |
| 8/10/10 | 12.03 |
| 8/11/10 | 12.05 |
| 8/11/10 | 11.89 |
| 8/11/10 | 11.85 |
| 8/11/10 | 11.81 |
| 8/11/10 | 11.66 |
| 8/11/10 | 11.75 |
| 8/11/10 | 11.64 |
| 8/11/10 | 11.69 |
| 8/11/10 | 11.6 |
| 8/11/10 | 11.1 |
| 8/11/10 | 10.73 |
| 8/11/10 | 10.62 |
| 8/11/10 | 10.6 |
| 8/11/10 | 10.5 |
| 8/11/10 | 10.48 |
| 8/11/10 | 10.5 |
| 8/11/10 | 10.41 |
| 8/11/10 | 10.49 |
| 8/11/10 | 10.56 |
| 8/11/10 | 10.85 |
| 8/11/10 | 10.79 |
| 8/11/10 | 10.38 |
| 8/11/10 | 10.3 |
| 8/11/10 | 10.66 |
| 8/11/10 | 10.72 |
| 8/11/10 | 10.91 |
| 8/11/10 | 11.22 |
| 8/11/10 | 11.31 |
| 8/11/10 | 11.62 |
| 8/11/10 | 11.65 |
| 8/11/10 | 11.85 |
| 8/11/10 | 12.06 |
| 8/11/10 | 12.12 |
| 8/11/10 | 12.18 |
| 8/11/10 | 12.27 |
| 8/11/10 | 12.46 |
| 8/11/10 | 12.62 |
| 8/11/10 | 12.53 |
| 8/11/10 | 12.83 |
| 8/11/10 | 12.66 |
| 8/11/10 | 12.75 |
| 8/11/10 | 12.63 |
| 8/11/10 | 12.46 |
| 8/11/10 | 12.33 |
| 8/11/10 | 12.07 |
| 8/11/10 | 12.27 |
| 8/11/10 | 12.31 |
| 8/11/10 | 12.22 |
| 8/12/10 | 12.21 |
| 8/12/10 | 12.19 |
| 8/12/10 | 12.21 |
| 8/12/10 | 11.96 |
| 8/12/10 | 11.93 |
| 8/12/10 | 11.26 |
| 8/12/10 | 10.4 |
| 8/12/10 | 10.12 |
| 8/12/10 | 10.02 |
| 8/12/10 | 10.02 |
| 8/12/10 | 10 |
| 8/12/10 | 9.8 |
| 8/12/10 | 9.67 |
| 8/12/10 | 9.65 |
| 8/12/10 | 9.58 |
| 8/12/10 | 9.63 |
| 8/12/10 | 9.7 |
| 8/12/10 | 9.8 |
| 8/12/10 | 9.86 |
| 8/12/10 | 9.78 |
| 8/12/10 | 9.46 |
| 8/12/10 | 9.66 |
| 8/12/10 | 9.61 |
| 8/12/10 | 9.66 |
| 8/12/10 | 9.61 |
| 8/12/10 | 9.45 |
| 8/12/10 | 9.49 |
| 8/12/10 | 9.45 |
| 8/12/10 | 9.49 |
| 8/12/10 | 9.65 |
| 8/12/10 | 9.61 |
| 8/12/10 | 10.21 |
| 8/12/10 | 10.61 |
| 8/12/10 | 11.2 |
| 8/12/10 | 10.96 |
| 8/12/10 | 10.96 |
| 8/12/10 | 10.86 |
| 8/12/10 | 11.12 |
| 8/12/10 | 10.66 |
| 8/12/10 | 11.32 |
| 8/12/10 | 11.01 |
| 8/12/10 | 11.03 |
| 8/12/10 | 10.97 |
| 8/12/10 | 10.86 |
| 8/12/10 | 10.84 |
| 8/12/10 | 10.96 |
| 8/12/10 | 10.84 |
| 8/12/10 | 10.94 |
| 8/13/10 | 10.58 |
| 8/13/10 | 10.54 |
| 8/13/10 | 10.42 |
| 8/13/10 | 10.29 |
| 8/13/10 | 10.17 |
| 8/13/10 | 10.06 |
| 8/13/10 | 10 |
| 8/13/10 | 9.87 |
| 8/13/10 | 9.66 |
| 8/13/10 | 9.55 |
| 8/13/10 | 9.48 |
| 8/13/10 | 9.37 |
| 8/13/10 | 9.45 |
| 8/13/10 | 9.36 |
| 8/13/10 | 9.35 |
| 8/13/10 | 9.12 |
| 8/13/10 | 9.14 |
| 8/13/10 | 9.09 |
| 8/13/10 | 9.11 |
| 8/13/10 | 9.24 |
| 8/13/10 | 9.24 |
| 8/13/10 | 9.33 |
| 8/13/10 | 9.45 |
| 8/13/10 | 9.53 |
| 8/13/10 | 9.52 |
| 8/13/10 | 9.7 |
| 8/13/10 | 9.77 |
| 8/13/10 | 9.78 |
| 8/13/10 | 9.88 |
| 8/13/10 | 9.95 |
| 8/13/10 | 9.88 |
| 8/13/10 | 10.09 |
| 8/13/10 | 10.22 |
| 8/13/10 | 10.12 |
| 8/13/10 | 10.27 |
| 8/13/10 | 10.21 |
| 8/13/10 | 10.13 |
| 8/13/10 | 9.98 |
| 8/13/10 | 9.94 |
| 8/13/10 | 9.96 |
| 8/13/10 | 9.79 |
| 8/13/10 | 9.88 |
| 8/13/10 | 9.68 |
| 8/13/10 | 9.5 |
| 8/13/10 | 9.23 |
| 8/13/10 | 9.1 |
| 8/13/10 | 9.09 |
| 8/13/10 | 8.97 |
| 8/14/10 | 8.86 |
| 8/14/10 | 8.77 |
| 8/14/10 | 8.66 |
| 8/14/10 | 8.62 |
| 8/14/10 | 8.47 |
| 8/14/10 | 8.34 |
| 8/14/10 | 8.22 |
| 8/14/10 | 8.18 |
| 8/14/10 | 7.99 |
| 8/14/10 | 7.99 |
| 8/14/10 | 7.9 |
| 8/14/10 | 7.87 |
| 8/14/10 | 7.69 |
| 8/14/10 | 7.57 |
| 8/14/10 | 7.49 |
| 8/14/10 | 7.4 |
| 8/14/10 | 7.21 |
| 8/14/10 | 7.33 |
| 8/14/10 | 7.21 |
| 8/14/10 | 7.38 |
| 8/14/10 | 7.99 |
| 8/14/10 | 8.08 |
| 8/14/10 | 8.22 |
| 8/14/10 | 7.93 |
| 8/14/10 | 8.71 |
| 8/14/10 | 8.82 |
| 8/14/10 | 9.14 |
| 8/14/10 | 8.85 |
| 8/14/10 | 9.23 |
| 8/14/10 | 9.64 |
| 8/14/10 | 9.48 |
| 8/14/10 | 9.93 |
| 8/14/10 | 9.98 |
| 8/14/10 | 9.79 |
| 8/14/10 | 10.23 |
| 8/14/10 | 10.51 |
| 8/14/10 | 10.43 |
| 8/14/10 | 10.36 |
| 8/14/10 | 10.2 |
| 8/14/10 | 10.24 |
| 8/14/10 | 10.09 |
| 8/14/10 | 10.02 |
| 8/14/10 | 10.02 |
| 8/14/10 | 9.75 |
| 8/14/10 | 9.44 |
| 8/14/10 | 9.41 |
| 8/14/10 | 9.41 |
| 8/14/10 | 9.5 |
| 8/15/10 | 9.28 |
| 8/15/10 | 9.13 |
| 8/15/10 | 9.04 |
| 8/15/10 | 8.91 |
| 8/15/10 | 8.75 |
| 8/15/10 | 8.61 |
| 8/15/10 | 8.66 |
| 8/15/10 | 8.69 |
| 8/15/10 | 8.57 |
| 8/15/10 | 8.57 |
| 8/15/10 | 8.61 |
| 8/15/10 | 8.51 |
| 8/15/10 | 8.4 |
| 8/15/10 | 8.36 |
| 8/15/10 | 8.28 |
| 8/15/10 | 8.23 |
| 8/15/10 | 8.23 |
| 8/15/10 | 8.17 |
| 8/15/10 | 8.2 |
| 8/15/10 | 8.03 |
| 8/15/10 | 8.15 |
| 8/15/10 | 8.15 |
| 8/15/10 | 8.18 |
| 8/15/10 | 7.77 |
| 8/15/10 | 7.71 |
| 8/15/10 | 7.7 |
| 8/15/10 | 7.99 |
| 8/15/10 | 8.18 |
| 8/15/10 | 8.41 |
| 8/15/10 | 8.57 |
| 8/15/10 | 8.63 |
| 8/15/10 | 8.99 |
| 8/15/10 | 9.65 |
| 8/15/10 | 9.71 |
| 8/15/10 | 9.61 |
| 8/15/10 | 9.67 |
| 8/15/10 | 9.74 |
| 8/15/10 | 9.41 |
| 8/15/10 | 9.67 |
| 8/15/10 | 9.77 |
| 8/15/10 | 9.9 |
| 8/15/10 | 9.9 |
| 8/15/10 | 9.86 |
| 8/15/10 | 9.87 |
| 8/15/10 | 9.49 |
| 8/15/10 | 9.23 |
| 8/15/10 | 9 |
| 8/15/10 | 9.26 |
| 8/16/10 | 9.38 |
| 8/16/10 | 9.29 |
| 8/16/10 | 9.08 |
| 8/16/10 | 9.01 |
| 8/16/10 | 8.95 |
| 8/16/10 | 9.47 |
| 8/16/10 | 9.29 |
| 8/16/10 | 9.4 |
| 8/16/10 | 9.26 |
| 8/16/10 | 9.29 |
| 8/16/10 | 9.25 |
| 8/16/10 | 8.91 |
| 8/16/10 | 8.85 |
| 8/16/10 | 8.69 |
| 8/16/10 | 8.74 |
| 8/16/10 | 8.53 |
| 8/16/10 | 8.52 |
| 8/16/10 | 8.61 |
| 8/16/10 | 8.67 |
| 8/16/10 | 8.79 |
| 8/16/10 | 8.96 |
| 8/16/10 | 8.99 |
| 8/16/10 | 8.93 |
| 8/16/10 | 9.42 |
| 8/16/10 | 9.39 |
| 8/16/10 | 8.88 |
| 8/16/10 | 9.95 |
| 8/16/10 | 10.05 |
| 8/16/10 | 10.01 |
| 8/16/10 | 9.84 |
| 8/16/10 | 9.7 |
| 8/16/10 | 9.79 |
| 8/16/10 | 9.69 |
| 8/16/10 | 9.87 |
| 8/16/10 | 10.01 |
| 8/16/10 | 10.04 |
| 8/16/10 | 10.54 |
| 8/16/10 | 10.76 |
| 8/16/10 | 11.14 |
| 8/16/10 | 11.47 |
| 8/16/10 | 11.44 |
| 8/16/10 | 11.22 |
| 8/16/10 | 10.94 |
| 8/16/10 | 10.64 |
| 8/16/10 | 10.58 |
| 8/16/10 | 10.64 |
| 8/16/10 | 10.52 |
| 8/16/10 | 10.34 |
| 8/17/10 | 10.29 |
| 8/17/10 | 10.2 |
| 8/17/10 | 10 |
| 8/17/10 | 9.79 |
| 8/17/10 | 9.72 |
| 8/17/10 | 9.68 |
| 8/17/10 | 9.51 |
| 8/17/10 | 9.43 |
| 8/17/10 | 9.27 |
| 8/17/10 | 9.04 |
| 8/17/10 | 9.06 |
| 8/17/10 | 8.92 |
| 8/17/10 | 8.68 |
| 8/17/10 | 8.5 |
| 8/17/10 | 8.53 |
| 8/17/10 | 8.19 |
| 8/17/10 | 8.06 |
| 8/17/10 | 7.9 |
| 8/17/10 | 7.94 |
| 8/17/10 | 8.11 |
| 8/17/10 | 8.33 |
| 8/17/10 | 8.47 |
| 8/17/10 | 8.59 |
| 8/17/10 | 8.91 |
| 8/17/10 | 9.22 |
| 8/17/10 | 9.23 |
| 8/17/10 | 9.33 |
| 8/17/10 | 9.25 |
| 8/17/10 | 9.72 |
| 8/17/10 | 9.54 |
| 8/17/10 | 9.87 |
| 8/17/10 | 10.34 |
| 8/17/10 | 10.05 |
| 8/17/10 | 10.29 |
| 8/17/10 | 10.85 |
| 8/17/10 | 11.2 |
| 8/17/10 | 11.06 |
| 8/17/10 | 10.79 |
| 8/17/10 | 11.17 |
| 8/17/10 | 11.11 |
| 8/17/10 | 11.25 |
| 8/17/10 | 11.03 |
| 8/17/10 | 10.65 |
| 8/17/10 | 10.75 |
| 8/17/10 | 10.62 |
| 8/17/10 | 10.52 |
| 8/17/10 | 10.55 |
| 8/17/10 | 10.31 |
| 8/18/10 | 10.32 |
| 8/18/10 | 10.29 |
| 8/18/10 | 10.19 |
| 8/18/10 | 10.1 |
| 8/18/10 | 10.01 |
| 8/18/10 | 9.95 |
| 8/18/10 | 9.68 |
| 8/18/10 | 9.61 |
| 8/18/10 | 9.4 |
| 8/18/10 | 9.23 |
| 8/18/10 | 9.09 |
| 8/18/10 | 8.88 |
| 8/18/10 | 8.47 |
| 8/18/10 | 8.05 |
| 8/18/10 | 7.9 |
| 8/18/10 | 7.78 |
| 8/18/10 | 7.74 |
| 8/18/10 | 7.68 |
| 8/18/10 | 7.8 |
| 8/18/10 | 7.86 |
| 8/18/10 | 8.08 |
| 8/18/10 | 8.02 |
| 8/18/10 | 8.02 |
| 8/18/10 | 7.83 |
| 8/18/10 | 7.51 |
| 8/18/10 | 8.08 |
| 8/18/10 | 8.36 |
| 8/18/10 | 8.74 |
| 8/18/10 | 8.88 |
| 8/18/10 | 8.75 |
| 8/18/10 | 9.91 |
| 8/18/10 | 9.82 |
| 8/18/10 | 9.8 |
| 8/18/10 | 10.17 |
| 8/18/10 | 9.91 |
| 8/18/10 | 9.69 |
| 8/18/10 | 10 |
| 8/18/10 | 10.02 |
| 8/18/10 | 10.32 |
| 8/18/10 | 10.07 |
| 8/18/10 | 10.38 |
| 8/18/10 | 10.55 |
| 8/18/10 | 10.72 |
| 8/18/10 | 10.48 |
| 8/18/10 | 10.5 |
| 8/18/10 | 10.47 |
| 8/18/10 | 10.48 |
| 8/18/10 | 10.28 |
| 8/19/10 | 10.31 |
| 8/19/10 | 10.26 |
| 8/19/10 | 10.24 |
| 8/19/10 | 10.16 |
| 8/19/10 | 10.01 |
| 8/19/10 | 9.94 |
| 8/19/10 | 9.78 |
| 8/19/10 | 9.64 |
| 8/19/10 | 9.49 |
| 8/19/10 | 9.24 |
| 8/19/10 | 8.99 |
| 8/19/10 | 8.85 |
| 8/19/10 | 8.71 |
| 8/19/10 | 8.58 |
| 8/19/10 | 8.52 |
| 8/19/10 | 8.47 |
| 8/19/10 | 8.38 |
| 8/19/10 | 8.36 |
| 8/19/10 | 8.1 |
| 8/19/10 | 7.89 |
| 8/19/10 | 7.81 |
| 8/19/10 | 8.01 |
| 8/19/10 | 8.31 |
| 8/19/10 | 8.73 |
| 8/19/10 | 8.98 |
| 8/19/10 | 8.81 |
| 8/19/10 | 9.15 |
| 8/19/10 | 9.04 |
| 8/19/10 | 9.75 |
| 8/19/10 | 10.18 |
| 8/19/10 | 9.92 |
| 8/19/10 | 10.34 |
| 8/19/10 | 10.6 |
| 8/19/10 | 10.82 |
| 8/19/10 | 11.22 |
| 8/19/10 | 11.31 |
| 8/19/10 | 11.45 |
| 8/19/10 | 11.61 |
| 8/19/10 | 11.53 |
| 8/19/10 | 11.61 |
| 8/19/10 | 11.41 |
| 8/19/10 | 11.11 |
| 8/19/10 | 10.68 |
| 8/19/10 | 10.51 |
| 8/19/10 | 10.2 |
| 8/19/10 | 10.39 |
| 8/19/10 | 10.36 |
| 8/19/10 | 10.31 |
| 8/20/10 | 10.04 |
| 8/20/10 | 10.04 |
| 8/20/10 | 9.93 |
| 8/20/10 | 10.08 |
| 8/20/10 | 9.9 |
| 8/20/10 | 10.08 |
| 8/20/10 | 10.13 |
| 8/20/10 | 10.03 |
| 8/20/10 | 10.04 |
| 8/20/10 | 9.88 |
| 8/20/10 | 9.86 |
| 8/20/10 | 9.62 |
| 8/20/10 | 9.61 |
| 8/20/10 | 9.53 |
| 8/20/10 | 9.4 |
| 8/20/10 | 9.33 |
| 8/20/10 | 9.16 |
| 8/20/10 | 9.29 |
| 8/20/10 | 9.51 |
| 8/20/10 | 9.42 |
| 8/20/10 | 9.63 |
| 8/20/10 | 9.61 |
| 8/20/10 | 9.73 |
| 8/20/10 | 10.08 |
| 8/20/10 | 10.43 |
| 8/20/10 | 10.79 |
| 8/20/10 | 10.75 |
| 8/20/10 | 10.96 |
| 8/20/10 | 11.26 |
| 8/20/10 | 10.61 |
| 8/20/10 | 11.14 |
| 8/20/10 | 11.44 |
| 8/20/10 | 11.75 |
| 8/20/10 | 11.84 |
| 8/20/10 | 12.4 |
| 8/20/10 | 11.54 |
| 8/20/10 | 12.62 |
| 8/20/10 | 12.67 |
| 8/20/10 | 12.14 |
| 8/20/10 | 12.39 |
| 8/20/10 | 12.5 |
| 8/20/10 | 12.29 |
| 8/20/10 | 12.01 |
| 8/20/10 | 12.17 |
| 8/20/10 | 12.07 |
| 8/20/10 | 12.01 |
| 8/20/10 | 11.67 |
| 8/20/10 | 11.6 |
| 8/21/10 | 11.68 |
| 8/21/10 | 11.44 |
| 8/21/10 | 11.31 |
| 8/21/10 | 11.18 |
| 8/21/10 | 11.24 |
| 8/21/10 | 11.32 |
| 8/21/10 | 11.37 |
| 8/21/10 | 11.24 |
| 8/21/10 | 11.17 |
| 8/21/10 | 11.18 |
| 8/21/10 | 11.08 |
| 8/21/10 | 11.08 |
| 8/21/10 | 10.84 |
| 8/21/10 | 10.65 |
| 8/21/10 | 10.55 |
| 8/21/10 | 10.43 |
| 8/21/10 | 10.4 |
| 8/21/10 | 10.52 |
| 8/21/10 | 10.61 |
| 8/21/10 | 10.53 |
| 8/21/10 | 10.35 |
| 8/21/10 | 9.94 |
| 8/21/10 | 10.4 |
| 8/21/10 | 10.39 |
| 8/21/10 | 11.21 |
| 8/21/10 | 11.88 |
| 8/21/10 | 11.84 |
| 8/21/10 | 11.65 |
| 8/21/10 | 11.77 |
| 8/21/10 | 11.61 |
| 8/21/10 | 11.92 |
| 8/21/10 | 11.42 |
| 8/21/10 | 11.73 |
| 8/21/10 | 12.04 |
| 8/21/10 | 12 |
| 8/21/10 | 11.94 |
| 8/21/10 | 11.78 |
| 8/21/10 | 11.99 |
| 8/21/10 | 11.7 |
| 8/21/10 | 11.63 |
| 8/21/10 | 11.53 |
| 8/21/10 | 11.46 |
| 8/21/10 | 11.15 |
| 8/21/10 | 11.2 |
| 8/21/10 | 11.25 |
| 8/21/10 | 10.92 |
| 8/21/10 | 11.15 |
| 8/21/10 | 11.04 |
| 8/22/10 | 10.9 |
| 8/22/10 | 10.62 |
| 8/22/10 | 10.35 |
| 8/22/10 | 10.23 |
| 8/22/10 | 10.18 |
| 8/22/10 | 10.06 |
| 8/22/10 | 10.12 |
| 8/22/10 | 9.94 |
| 8/22/10 | 10.04 |
| 8/22/10 | 9.95 |
| 8/22/10 | 9.39 |
| 8/22/10 | 9.43 |
| 8/22/10 | 9.2 |
| 8/22/10 | 8.94 |
| 8/22/10 | 8.88 |
| 8/22/10 | 8.6 |
| 8/22/10 | 8.55 |
| 8/22/10 | 8.4 |
| 8/22/10 | 8.42 |
| 8/22/10 | 8.52 |
| 8/22/10 | 8.51 |
| 8/22/10 | 8.68 |
| 8/22/10 | 8.4 |
| 8/22/10 | 8.23 |
| 8/22/10 | 8.3 |
| 8/22/10 | 8.5 |
| 8/22/10 | 8.62 |
| 8/22/10 | 8.61 |
| 8/22/10 | 8.56 |
| 8/22/10 | 8.78 |
| 8/22/10 | 9.15 |
| 8/22/10 | 9.24 |
| 8/22/10 | 8.86 |
| 8/22/10 | 8.84 |
| 8/22/10 | 9.1 |
| 8/22/10 | 9.24 |
| 8/22/10 | 8.63 |
| 8/22/10 | 8.85 |
| 8/22/10 | 8.7 |
| 8/22/10 | 8.76 |
| 8/22/10 | 8.85 |
| 8/22/10 | 8.71 |
| 8/22/10 | 9.03 |
| 8/22/10 | 9.27 |
| 8/22/10 | 9.23 |
| 8/22/10 | 9.15 |
| 8/22/10 | 8.77 |
| 8/22/10 | 8.91 |
| 8/23/10 | 8.67 |
| 8/23/10 | 8.44 |
| 8/23/10 | 8.56 |
| 8/23/10 | 8.38 |
| 8/23/10 | 8.19 |
| 8/23/10 | 8.07 |
| 8/23/10 | 8 |
| 8/23/10 | 7.79 |
| 8/23/10 | 7.52 |
| 8/23/10 | 7.27 |
| 8/23/10 | 7.15 |
| 8/23/10 | 7.11 |
| 8/23/10 | 7.2 |
| 8/23/10 | 7.13 |
| 8/23/10 | 7.03 |
| 8/23/10 | 7.1 |
| 8/23/10 | 7.05 |
| 8/23/10 | 7.02 |
| 8/23/10 | 7 |
| 8/23/10 | 7.13 |
| 8/23/10 | 7.08 |
| 8/23/10 | 7.18 |
| 8/23/10 | 7.26 |
| 8/23/10 | 7.19 |
| 8/23/10 | 6.89 |
| 8/23/10 | 6.74 |
| 8/23/10 | 6.86 |
| 8/23/10 | 6.94 |
| 8/23/10 | 7.41 |
| 8/23/10 | 7.95 |
| 8/23/10 | 7.58 |
| 8/23/10 | 7.83 |
| 8/23/10 | 7.66 |
| 8/23/10 | 7.9 |
| 8/23/10 | 7.95 |
| 8/23/10 | 7.9 |
| 8/23/10 | 7.69 |
| 8/23/10 | 7.62 |
| 8/23/10 | 7.47 |
| 8/23/10 | 7.51 |
| 8/23/10 | 7.4 |
| 8/23/10 | 7.09 |
| 8/23/10 | 6.84 |
| 8/23/10 | 6.85 |
| 8/23/10 | 6.75 |
| 8/23/10 | 6.76 |
| 8/23/10 | 6.74 |
| 8/23/10 | 6.6 |
| 8/24/10 | 6.54 |
| 8/24/10 | 6.47 |
| 8/24/10 | 6.52 |
| 8/24/10 | 6.39 |
| 8/24/10 | 6.37 |
| 8/24/10 | 6.36 |
| 8/24/10 | 6.21 |
| 8/24/10 | 6.18 |
| 8/24/10 | 6.29 |
| 8/24/10 | 6.19 |
| 8/24/10 | 6.17 |
| 8/24/10 | 6.14 |
| 8/24/10 | 6.11 |
| 8/24/10 | 6.13 |
| 8/24/10 | 6.21 |
| 8/24/10 | 6.28 |
| 8/24/10 | 6.28 |
| 8/24/10 | 6.39 |
| 8/24/10 | 6.29 |
| 8/24/10 | 6.29 |
| 8/24/10 | 6.34 |
| 8/24/10 | 6.5 |
| 8/24/10 | 6.12 |
| 8/24/10 | 6.13 |
| 8/24/10 | 6.15 |
| 8/24/10 | 6.26 |
| 8/24/10 | 6.58 |
| 8/24/10 | 6.7 |
| 8/24/10 | 6.76 |
| 8/24/10 | 6.88 |
| 8/24/10 | 7.1 |
| 8/24/10 | 7.15 |
| 8/24/10 | 7.17 |
| 8/24/10 | 7.41 |
| 8/24/10 | 7.56 |
| 8/24/10 | 7.5 |
| 8/24/10 | 7.57 |
| 8/24/10 | 7.76 |
| 8/24/10 | 7.89 |
| 8/24/10 | 7.93 |
| 8/24/10 | 7.88 |
| 8/24/10 | 7.64 |
| 8/24/10 | 7.52 |
| 8/24/10 | 7.6 |
| 8/24/10 | 7.51 |
| 8/24/10 | 7.43 |
| 8/24/10 | 7.38 |
| 8/24/10 | 7.25 |
| 8/25/10 | 7.17 |
| 8/25/10 | 7.15 |
| 8/25/10 | 7.06 |
| 8/25/10 | 7 |
| 8/25/10 | 6.87 |
| 8/25/10 | 6.78 |
| 8/25/10 | 6.59 |
| 8/25/10 | 6.5 |
| 8/25/10 | 6.5 |
| 8/25/10 | 6.39 |
| 8/25/10 | 6.3 |
| 8/25/10 | 6.26 |
| 8/25/10 | 6.12 |
| 8/25/10 | 6.07 |
| 8/25/10 | 6.01 |
| 8/25/10 | 5.77 |
| 8/25/10 | 5.71 |
| 8/25/10 | 5.67 |
| 8/25/10 | 5.69 |
| 8/25/10 | 5.91 |
| 8/25/10 | 6.03 |
| 8/25/10 | 6.2 |
| 8/25/10 | 6.4 |
| 8/25/10 | 6.55 |
| 8/25/10 | 6.68 |
| 8/25/10 | 6.56 |
| 8/25/10 | 6.57 |
| 8/25/10 | 6.66 |
| 8/25/10 | 6.66 |
| 8/25/10 | 6.48 |
| 8/25/10 | 6.5 |
| 8/25/10 | 6.72 |
| 8/25/10 | 6.63 |
| 8/25/10 | 6.61 |
| 8/25/10 | 6.99 |
| 8/25/10 | 6.83 |
| 8/25/10 | 7.26 |
| 8/25/10 | 7.76 |
| 8/25/10 | 7.8 |
| 8/25/10 | 7.71 |
| 8/25/10 | 7.57 |
| 8/25/10 | 7.39 |
| 8/25/10 | 7.11 |
| 8/25/10 | 7.1 |
| 8/25/10 | 7.01 |
| 8/25/10 | 6.74 |
| 8/25/10 | 6.83 |
| 8/25/10 | 6.9 |
| 8/26/10 | 7.22 |
| 8/26/10 | 7.66 |
| 8/26/10 | 7.42 |
| 8/26/10 | 7.49 |
| 8/26/10 | 7.12 |
| 8/26/10 | 6.97 |
| 8/26/10 | 6.97 |
| 8/26/10 | 6.9 |
| 8/26/10 | 6.58 |
| 8/26/10 | 6.4 |
| 8/26/10 | 6.27 |
| 8/26/10 | 5.78 |
| 8/26/10 | 5.59 |
| 8/26/10 | 5.65 |
| 8/26/10 | 5.6 |
| 8/26/10 | 5.58 |
| 8/26/10 | 5.5 |
| 8/26/10 | 5.63 |
| 8/26/10 | 5.68 |
| 8/26/10 | 5.74 |
| 8/26/10 | 5.84 |
| 8/26/10 | 5.78 |
| 8/26/10 | 5.88 |
| 8/26/10 | 6.16 |
| 8/26/10 | 6.12 |
| 8/26/10 | 6.23 |
| 8/26/10 | 6.32 |
| 8/26/10 | 6.39 |
| 8/26/10 | 6.62 |
| 8/26/10 | 6.5 |
| 8/26/10 | 7.12 |
| 8/26/10 | 7.32 |
| 8/26/10 | 7.24 |
| 8/26/10 | 7.19 |
| 8/26/10 | 7.37 |
| 8/26/10 | 7.62 |
| 8/26/10 | 7.46 |
| 8/26/10 | 7.67 |
| 8/26/10 | 8.31 |
| 8/26/10 | 8.1 |
| 8/26/10 | 8.31 |
| 8/26/10 | 8.49 |
| 8/26/10 | 8.2 |
| 8/26/10 | 8.53 |
| 8/26/10 | 8.59 |
| 8/26/10 | 8.51 |
| 8/26/10 | 8.55 |
| 8/26/10 | 8.38 |
| 8/27/10 | 8.21 |
| 8/27/10 | 8.01 |
| 8/27/10 | 7.87 |
| 8/27/10 | 7.88 |
| 8/27/10 | 7.66 |
| 8/27/10 | 7.38 |
| 8/27/10 | 7.15 |
| 8/27/10 | 7.03 |
| 8/27/10 | 6.87 |
| 8/27/10 | 6.66 |
| 8/27/10 | 6.62 |
| 8/27/10 | 6.51 |
| 8/27/10 | 6.33 |
| 8/27/10 | 6.32 |
| 8/27/10 | 6.32 |
| 8/27/10 | 6.28 |
| 8/27/10 | 6.35 |
| 8/27/10 | 6.32 |
| 8/27/10 | 6.29 |
| 8/27/10 | 6.14 |
| 8/27/10 | 6.15 |
| 8/27/10 | 5.96 |
| 8/27/10 | 5.79 |
| 8/27/10 | 6.53 |
| 8/27/10 | 6.98 |
| 8/27/10 | 7.53 |
| 8/27/10 | 7.39 |
| 8/27/10 | 6.81 |
| 8/27/10 | 7.68 |
| 8/27/10 | 7.84 |
| 8/27/10 | 8.09 |
| 8/27/10 | 8.15 |
| 8/27/10 | 8.63 |
| 8/27/10 | 8.68 |
| 8/27/10 | 8.67 |
| 8/27/10 | 9.24 |
| 8/27/10 | 9.62 |
| 8/27/10 | 9.17 |
| 8/27/10 | 9.25 |
| 8/27/10 | 9.47 |
| 8/27/10 | 9.7 |
| 8/27/10 | 9.69 |
| 8/27/10 | 9.35 |
| 8/27/10 | 9.5 |
| 8/27/10 | 9.38 |
| 8/27/10 | 9.19 |
| 8/27/10 | 9.1 |
| 8/27/10 | 8.86 |
| 8/28/10 | 9.05 |
| 8/28/10 | 8.81 |
| 8/28/10 | 8.7 |
| 8/28/10 | 8.79 |
| 8/28/10 | 8.95 |
| 8/28/10 | 8.93 |
| 8/28/10 | 8.76 |
| 8/28/10 | 8.51 |
| 8/28/10 | 8.3 |
| 8/28/10 | 8.16 |
| 8/28/10 | 7.82 |
| 8/28/10 | 7.81 |
| 8/28/10 | 7.55 |
| 8/28/10 | 7.45 |
| 8/28/10 | 7.29 |
| 8/28/10 | 7.2 |
| 8/28/10 | 7.14 |
| 8/28/10 | 7.04 |
| 8/28/10 | 7.15 |
| 8/28/10 | 7.04 |
| 8/28/10 | 6.85 |
| 8/28/10 | 6.85 |
| 8/28/10 | 7.17 |
| 8/28/10 | 7.15 |
| 8/28/10 | 7.26 |
| 8/28/10 | 7.37 |
| 8/28/10 | 7.53 |
| 8/28/10 | 7.77 |
| 8/28/10 | 8.4 |
| 8/28/10 | 8.48 |
| 8/28/10 | 8.36 |
| 8/28/10 | 8.88 |
| 8/28/10 | 9.28 |
| 8/28/10 | 8.79 |
| 8/28/10 | 8.7 |
| 8/28/10 | 8.56 |
| 8/28/10 | 8.83 |
| 8/28/10 | 8.78 |
| 8/28/10 | 8.86 |
| 8/28/10 | 9.08 |
| 8/28/10 | 9.7 |
| 8/28/10 | 9.72 |
| 8/28/10 | 9.44 |
| 8/28/10 | 9.25 |
| 8/28/10 | 9.38 |
| 8/28/10 | 10.01 |
| 8/28/10 | 10.18 |
| 8/28/10 | 9.61 |
| 8/29/10 | 9.38 |
| 8/29/10 | 9.39 |
| 8/29/10 | 9.22 |
| 8/29/10 | 9.36 |
| 8/29/10 | 9.58 |
| 8/29/10 | 9.31 |
| 8/29/10 | 9.21 |
| 8/29/10 | 9.26 |
| 8/29/10 | 9.22 |
| 8/29/10 | 9.27 |
| 8/29/10 | 9.1 |
| 8/29/10 | 9.1 |
| 8/29/10 | 8.87 |
| 8/29/10 | 8.75 |
| 8/29/10 | 8.41 |
| 8/29/10 | 8.23 |
| 8/29/10 | 7.82 |
| 8/29/10 | 7.51 |
| 8/29/10 | 7.45 |
| 8/29/10 | 7.21 |
| 8/29/10 | 7.85 |
| 8/29/10 | 7.56 |
| 8/29/10 | 7.66 |
| 8/29/10 | 7.82 |
| 8/29/10 | 7.95 |
| 8/29/10 | 7.98 |
| 8/29/10 | 8.19 |
| 8/29/10 | 8.41 |
| 8/29/10 | 8.47 |
| 8/29/10 | 8.61 |
| 8/29/10 | 8.92 |
| 8/29/10 | 8.88 |
| 8/29/10 | 9.28 |
| 8/29/10 | 9.84 |
| 8/29/10 | 9.07 |
| 8/29/10 | 9.79 |
| 8/29/10 | 9.7 |
| 8/29/10 | 9.65 |
| 8/29/10 | 9.6 |
| 8/29/10 | 9.58 |
| 8/29/10 | 9.46 |
| 8/29/10 | 9.77 |
| 8/29/10 | 9.33 |
| 8/29/10 | 9.7 |
| 8/29/10 | 9.41 |
| 8/29/10 | 9.59 |
| 8/29/10 | 9.19 |
| 8/29/10 | 9.32 |
| 8/30/10 | 9.02 |
| 8/30/10 | 9.05 |
| 8/30/10 | 8.92 |
| 8/30/10 | 9.15 |
| 8/30/10 | 9.36 |
| 8/30/10 | 9.25 |
| 8/30/10 | 9.27 |
| 8/30/10 | 9.12 |
| 8/30/10 | 9.33 |
| 8/30/10 | 9.24 |
| 8/30/10 | 8.98 |
| 8/30/10 | 8.95 |
| 8/30/10 | 8.78 |
| 8/30/10 | 8.63 |
| 8/30/10 | 8.4 |
| 8/30/10 | 8.51 |
| 8/30/10 | 8.35 |
| 8/30/10 | 8.22 |
| 8/30/10 | 7.84 |
| 8/30/10 | 7.77 |
| 8/30/10 | 7.76 |
| 8/30/10 | 7.83 |
| 8/30/10 | 7.72 |
| 8/30/10 | 7.85 |
| 8/30/10 | 7.9 |
| 8/30/10 | 8.42 |
| 8/30/10 | 8.23 |
| 8/30/10 | 8.41 |
| 8/30/10 | 8.53 |
| 8/30/10 | 8.94 |
| 8/30/10 | 9.3 |
| 8/30/10 | 8.95 |
| 8/30/10 | 9.38 |
| 8/30/10 | 8.99 |
| 8/30/10 | 9.5 |
| 8/30/10 | 9.52 |
| 8/30/10 | 9.29 |
| 8/30/10 | 9.58 |
| 8/30/10 | 9.59 |
| 8/30/10 | 9.4 |
| 8/30/10 | 9.34 |
| 8/30/10 | 9.17 |
| 8/30/10 | 9.33 |
| 8/30/10 | 9.39 |
| 8/30/10 | 9.27 |
| 8/30/10 | 9.43 |
| 8/30/10 | 9.4 |
| 8/30/10 | 9.31 |
| 8/31/10 | 9.3 |
| 8/31/10 | 9.33 |
| 8/31/10 | 9.46 |
| 8/31/10 | 9.21 |
| 8/31/10 | 9.17 |
| 8/31/10 | 9.1 |
| 8/31/10 | 9.12 |
| 8/31/10 | 9.12 |
| 8/31/10 | 8.73 |
| 8/31/10 | 8.68 |
| 8/31/10 | 8.64 |
| 8/31/10 | 8.8 |
| 8/31/10 | 8.82 |
| 8/31/10 | 8.68 |
| 8/31/10 | 8.38 |
| 8/31/10 | 8.16 |
| 8/31/10 | 7.96 |
| 8/31/10 | 7.76 |
| 8/31/10 | 7.71 |
| 8/31/10 | 7.73 |
| 8/31/10 | 7.7 |
| 8/31/10 | 8.05 |
| 8/31/10 | 7.91 |
| 8/31/10 | 8.13 |
| 8/31/10 | 7.9 |
| 8/31/10 | 8.01 |
| 8/31/10 | 8.04 |
| 8/31/10 | 8.14 |
| 8/31/10 | 8.47 |
| 8/31/10 | 8.63 |
| 8/31/10 | 8.8 |
| 8/31/10 | 8.6 |
| 8/31/10 | 8.98 |
| 8/31/10 | 8.98 |
| 8/31/10 | 9.14 |
| 8/31/10 | 9.1 |
| 8/31/10 | 8.76 |
| 8/31/10 | 9.2 |
| 8/31/10 | 9.3 |
| 8/31/10 | 9.21 |
| 8/31/10 | 9.08 |
| 8/31/10 | 9.15 |
| 8/31/10 | 8.86 |
| 8/31/10 | 9.09 |
| 8/31/10 | 8.85 |
| 8/31/10 | 9.08 |
| 8/31/10 | 8.93 |
| 8/31/10 | 9.02 |
| 9/1/10 | 8.86 |
| 9/1/10 | 8.98 |
| 9/1/10 | 8.84 |
| 9/1/10 | 8.96 |
| 9/1/10 | 8.84 |
| 9/1/10 | 8.7 |
| 9/1/10 | 8.5 |
| 9/1/10 | 8.76 |
| 9/1/10 | 8.52 |
| 9/1/10 | 8.61 |
| 9/1/10 | 8.54 |
| 9/1/10 | 8.56 |
| 9/1/10 | 8.42 |
| 9/1/10 | 8.24 |
| 9/1/10 | 8.07 |
| 9/1/10 | 8.1 |
| 9/1/10 | 7.93 |
| 9/1/10 | 7.93 |
| 9/1/10 | 7.84 |
| 9/1/10 | 7.94 |
| 9/1/10 | 7.99 |
| 9/1/10 | 7.78 |
| 9/1/10 | 7.87 |
| 9/1/10 | 7.71 |
| 9/1/10 | 7.98 |
| 9/1/10 | 7.86 |
| 9/1/10 | 8.15 |
| 9/1/10 | 8.28 |
| 9/1/10 | 8.23 |
| 9/1/10 | 8.41 |
| 9/1/10 | 8.25 |
| 9/1/10 | 8.22 |
| 9/1/10 | 8.68 |
| 9/1/10 | 8.85 |
| 9/1/10 | 8.84 |
| 9/1/10 | 9.14 |
| 9/1/10 | 8.98 |
| 9/1/10 | 8.71 |
| 9/1/10 | 8.69 |
| 9/1/10 | 8.68 |
| 9/1/10 | 8.54 |
| 9/1/10 | 8.06 |
| 9/1/10 | 8.11 |
| 9/1/10 | 8.03 |
| 9/1/10 | 8.19 |
| 9/1/10 | 7.93 |
| 9/1/10 | 8.07 |
| 9/1/10 | 7.7 |
| 9/2/10 | 7.86 |
| 9/2/10 | 7.92 |
| 9/2/10 | 7.79 |
| 9/2/10 | 7.85 |
| 9/2/10 | 7.57 |
| 9/2/10 | 7.71 |
| 9/2/10 | 7.71 |
| 9/2/10 | 7.71 |
| 9/2/10 | 7.82 |
| 9/2/10 | 7.68 |
| 9/2/10 | 7.67 |
| 9/2/10 | 7.6 |
| 9/2/10 | 7.38 |
| 9/2/10 | 7.17 |
| 9/2/10 | 7.08 |
| 9/2/10 | 7.04 |
| 9/2/10 | 6.97 |
| 9/2/10 | 6.95 |
| 9/2/10 | 6.61 |
| 9/2/10 | 6.69 |
| 9/2/10 | 6.74 |
| 9/2/10 | 6.36 |
| 9/2/10 | 6.32 |
| 9/2/10 | 6.75 |
| 9/2/10 | 6.79 |
| 9/2/10 | 6.94 |
| 9/2/10 | 7.24 |
| 9/2/10 | 7.37 |
| 9/2/10 | 7.52 |
| 9/2/10 | 7.79 |
| 9/2/10 | 7.83 |
| 9/2/10 | 7.77 |
| 9/2/10 | 7.81 |
| 9/2/10 | 7.9 |
| 9/2/10 | 8.15 |
| 9/2/10 | 8.02 |
| 9/2/10 | 8.03 |
| 9/2/10 | 8.24 |
| 9/2/10 | 8.2 |
| 9/2/10 | 8.21 |
| 9/2/10 | 8.58 |
| 9/2/10 | 8.44 |
| 9/2/10 | 8.18 |
| 9/2/10 | 7.81 |
| 9/2/10 | 7.78 |
| 9/2/10 | 7.66 |
| 9/2/10 | 7.56 |
| 9/2/10 | 7.71 |
| 9/3/10 | 7.56 |
| 9/3/10 | 7.59 |
| 9/3/10 | 7.38 |
| 9/3/10 | 7.26 |
| 9/3/10 | 7.09 |
| 9/3/10 | 6.95 |
| 9/3/10 | 7.1 |
| 9/3/10 | 7.03 |
| 9/3/10 | 6.79 |
| 9/3/10 | 6.79 |
| 9/3/10 | 6.72 |
| 9/3/10 | 6.59 |
| 9/3/10 | 6.47 |
| 9/3/10 | 6.39 |
| 9/3/10 | 6.23 |
| 9/3/10 | 6.09 |
| 9/3/10 | 5.73 |
| 9/3/10 | 5.68 |
| 9/3/10 | 5.62 |
| 9/3/10 | 5.49 |
| 9/3/10 | 5.65 |
| 9/3/10 | 5.77 |
| 9/3/10 | 5.75 |
| 9/3/10 | 6.12 |
| 9/3/10 | 6.36 |
| 9/3/10 | 6.63 |
| 9/3/10 | 6.59 |
| 9/3/10 | 6.89 |
| 9/3/10 | 7.02 |
| 9/3/10 | 6.76 |
| 9/3/10 | 7.09 |
| 9/3/10 | 7.25 |
| 9/3/10 | 7.11 |
| 9/3/10 | 5.92 |
| 9/3/10 | 6.52 |
| 9/3/10 | 6.89 |
| 9/3/10 | 7.23 |
| 9/3/10 | 7.29 |
| 9/3/10 | 7.06 |
| 9/3/10 | 6.9 |
| 9/3/10 | 6.88 |
| 9/3/10 | 6.93 |
| 9/3/10 | 7.07 |
| 9/3/10 | 6.92 |
| 9/3/10 | 6.81 |
| 9/3/10 | 6.86 |
| 9/3/10 | 6.74 |
| 9/3/10 | 6.61 |
| 9/4/10 | 6.49 |
| 9/4/10 | 6.28 |
| 9/4/10 | 6.15 |
| 9/4/10 | 6.08 |
| 9/4/10 | 6.09 |
| 9/4/10 | 6.01 |
| 9/4/10 | 5.94 |
| 9/4/10 | 5.79 |
| 9/4/10 | 5.94 |
| 9/4/10 | 5.96 |
| 9/4/10 | 5.87 |
| 9/4/10 | 5.82 |
| 9/4/10 | 5.75 |
| 9/4/10 | 5.72 |
| 9/4/10 | 5.64 |
| 9/4/10 | 5.61 |
| 9/4/10 | 5.6 |
| 9/4/10 | 5.7 |
| 9/4/10 | 5.61 |
| 9/4/10 | 5.7 |
| 9/4/10 | 5.4 |
| 9/4/10 | 5.2 |
| 9/4/10 | 5.29 |
| 9/4/10 | 5.36 |
| 9/4/10 | 5.47 |
| 9/4/10 | 5.63 |
| 9/4/10 | 5.69 |
| 9/4/10 | 5.62 |
| 9/4/10 | 5.72 |
| 9/4/10 | 5.85 |
| 9/4/10 | 6.09 |
| 9/4/10 | 6.31 |
| 9/4/10 | 6.31 |
| 9/4/10 | 6.32 |
| 9/4/10 | 6.4 |
| 9/4/10 | 6.38 |
| 9/4/10 | 6.48 |
| 9/4/10 | 6.35 |
| 9/4/10 | 6.31 |
| 9/4/10 | 6.34 |
| 9/4/10 | 6.39 |
| 9/4/10 | 6.22 |
| 9/4/10 | 6.12 |
| 9/4/10 | 6.08 |
| 9/4/10 | 5.93 |
| 9/4/10 | 5.88 |
| 9/4/10 | 5.79 |
| 9/4/10 | 5.66 |
| 9/5/10 | 5.69 |
| 9/5/10 | 5.6 |
| 9/5/10 | 5.06 |
| 9/5/10 | 5.41 |
| 9/5/10 | 5.35 |
| 9/5/10 | 5.33 |
| 9/5/10 | 5.27 |
| 9/5/10 | 5.33 |
| 9/5/10 | 5.45 |
| 9/5/10 | 5.32 |
| 9/5/10 | 5.41 |
| 9/5/10 | 5.4 |
| 9/5/10 | 5.36 |
| 9/5/10 | 5.47 |
| 9/5/10 | 5.37 |
| 9/5/10 | 5.32 |
| 9/5/10 | 5.31 |
| 9/5/10 | 5.33 |
| 9/5/10 | 5.51 |
| 9/5/10 | 5.43 |
| 9/5/10 | 5.22 |
| 9/5/10 | 5.56 |
| 9/5/10 | 5.66 |
| 9/5/10 | 5.89 |
| 9/5/10 | 5.95 |
| 9/5/10 | 6.16 |
| 9/5/10 | 6.25 |
| 9/5/10 | 5.59 |
| 9/5/10 | 5.41 |
| 9/5/10 | 6.21 |
| 9/5/10 | 6.3 |
| 9/5/10 | 6.31 |
| 9/5/10 | 6.39 |
| 9/5/10 | 6.77 |
| 9/5/10 | 6.96 |
| 9/5/10 | 6.78 |
| 9/5/10 | 6.92 |
| 9/5/10 | 6.89 |
| 9/5/10 | 6.83 |
| 9/5/10 | 7.16 |
| 9/5/10 | 7.41 |
| 9/5/10 | 7.33 |
| 9/5/10 | 7.42 |
| 9/5/10 | 7.2 |
| 9/5/10 | 7.17 |
| 9/5/10 | 7.06 |
| 9/5/10 | 6.99 |
| 9/5/10 | 6.88 |
| 9/6/10 | 6.72 |
| 9/6/10 | 6.56 |
| 9/6/10 | 6.5 |
| 9/6/10 | 6.47 |
| 9/6/10 | 6.36 |
| 9/6/10 | 6.25 |
| 9/6/10 | 6.25 |
| 9/6/10 | 6.18 |
| 9/6/10 | 6.17 |
| 9/6/10 | 6.12 |
| 9/6/10 | 6.04 |
| 9/6/10 | 6.01 |
| 9/6/10 | 5.97 |
| 9/6/10 | 5.93 |
| 9/6/10 | 5.88 |
| 9/6/10 | 5.74 |
| 9/6/10 | 5.77 |
| 9/6/10 | 5.78 |
| 9/6/10 | 5.81 |
| 9/6/10 | 5.67 |
| 9/6/10 | 5.72 |
| 9/6/10 | 5.62 |
| 9/6/10 | 5.74 |
| 9/6/10 | 5.88 |
| 9/6/10 | 6.28 |
| 9/6/10 | 6.39 |
| 9/6/10 | 6.61 |
| 9/6/10 | 6.61 |
| 9/6/10 | 7 |
| 9/6/10 | 7.07 |
| 9/6/10 | 7.04 |
| 9/6/10 | 6.69 |
| 9/6/10 | 6.81 |
| 9/6/10 | 6.44 |
| 9/6/10 | 7.05 |
| 9/6/10 | 7.4 |
| 9/6/10 | 7.5 |
| 9/6/10 | 7.29 |
| 9/6/10 | 6.93 |
| 9/6/10 | 6.72 |
| 9/6/10 | 7.13 |
| 9/6/10 | 6.86 |
| 9/6/10 | 6.7 |
| 9/6/10 | 6.8 |
| 9/6/10 | 6.68 |
| 9/6/10 | 7.06 |
| 9/6/10 | 7.79 |
| 9/6/10 | 8.12 |
| 9/7/10 | 7.84 |
| 9/7/10 | 7.7 |
| 9/7/10 | 7.45 |
| 9/7/10 | 7.13 |
| 9/7/10 | 6.88 |
| 9/7/10 | 6.56 |
| 9/7/10 | 6.46 |
| 9/7/10 | 6.19 |
| 9/7/10 | 6.13 |
| 9/7/10 | 5.99 |
| 9/7/10 | 5.99 |
| 9/7/10 | 5.97 |
| 9/7/10 | 5.91 |
| 9/7/10 | 5.88 |
| 9/7/10 | 5.94 |
| 9/7/10 | 5.87 |
| 9/7/10 | 5.86 |
| 9/7/10 | 5.69 |
| 9/7/10 | 5.74 |
| 9/7/10 | 5.69 |
| 9/7/10 | 5.73 |
| 9/7/10 | 5.69 |
| 9/7/10 | 6.09 |
| 9/7/10 | 6.49 |
| 9/7/10 | 6.41 |
| 9/7/10 | 6.66 |
| 9/7/10 | 6.65 |
| 9/7/10 | 6.45 |
| 9/7/10 | 6.47 |
| 9/7/10 | 7.58 |
| 9/7/10 | 8.16 |
| 9/7/10 | 7.46 |
| 9/7/10 | 8.04 |
| 9/7/10 | 7.35 |
| 9/7/10 | 7.23 |
| 9/7/10 | 7.98 |
| 9/7/10 | 7.9 |
| 9/7/10 | 8.46 |
| 9/7/10 | 8.05 |
| 9/7/10 | 7.83 |
| 9/7/10 | 7.77 |
| 9/7/10 | 7.64 |
| 9/7/10 | 7.72 |
| 9/7/10 | 7.3 |
| 9/7/10 | 7.36 |
| 9/7/10 | 7.39 |
| 9/7/10 | 7.46 |
| 9/7/10 | 7.81 |
| 9/8/10 | 7.68 |
| 9/8/10 | 7.12 |
| 9/8/10 | 7.6 |
| 9/8/10 | 7.53 |
| 9/8/10 | 6.83 |
| 9/8/10 | 7.6 |
| 9/8/10 | 7.45 |
| 9/8/10 | 7.47 |
| 9/8/10 | 7.03 |
| 9/8/10 | 7.18 |
| 9/8/10 | 7.43 |
| 9/8/10 | 7.07 |
| 9/8/10 | 6.43 |
| 9/8/10 | 6.56 |
| 9/8/10 | 6.5 |
| 9/8/10 | 6.58 |
| 9/8/10 | 6.57 |
| 9/8/10 | 7.08 |
| 9/8/10 | 6.4 |
| 9/8/10 | 6.21 |
| 9/8/10 | 6.64 |
| 9/8/10 | 6.66 |
| 9/8/10 | 6.87 |
| 9/8/10 | 6.94 |
| 9/8/10 | 7.14 |
| 9/8/10 | 7 |
| 9/8/10 | 7.2 |
| 9/8/10 | 7.38 |
| 9/8/10 | 7.21 |
| 9/8/10 | 7.56 |
| 9/8/10 | 7.13 |
| 9/8/10 | 7.52 |
| 9/8/10 | 7.3 |
| 9/8/10 | 7.43 |
| 9/8/10 | 7.87 |
| 9/8/10 | 7.29 |
| 9/8/10 | 7.52 |
| 9/8/10 | 7.72 |
| 9/8/10 | 8.54 |
| 9/8/10 | 8.69 |
| 9/8/10 | 8.77 |
| 9/8/10 | 8.27 |
| 9/8/10 | 8.45 |
| 9/8/10 | 8.48 |
| 9/8/10 | 8.25 |
| 9/8/10 | 7.99 |
| 9/8/10 | 7.65 |
| 9/8/10 | 7.6 |
| 9/9/10 | 7.54 |
| 9/9/10 | 7.31 |
| 9/9/10 | 7.22 |
| 9/9/10 | 7.22 |
| 9/9/10 | 7.14 |
| 9/9/10 | 7.23 |
| 9/9/10 | 7.1 |
| 9/9/10 | 7.18 |
| 9/9/10 | 7.02 |
| 9/9/10 | 7.09 |
| 9/9/10 | 7.02 |
| 9/9/10 | 6.84 |
| 9/9/10 | 6.84 |
| 9/9/10 | 6.95 |
| 9/9/10 | 6.96 |
| 9/9/10 | 6.84 |
| 9/9/10 | 6.93 |
| 9/9/10 | 6.85 |
| 9/9/10 | 6.96 |
| 9/9/10 | 6.77 |
| 9/9/10 | 6.68 |
| 9/9/10 | 6.84 |
| 9/9/10 | 7 |
| 9/9/10 | 6.99 |
| 9/9/10 | 6.98 |
| 9/9/10 | 6.66 |
| 9/9/10 | 6.71 |
| 9/9/10 | 7.05 |
| 9/9/10 | 7.12 |
| 9/9/10 | 7.19 |
| 9/9/10 | 7.39 |
| 9/9/10 | 7.28 |
| 9/9/10 | 7.41 |
| 9/9/10 | 7.37 |
| 9/9/10 | 7.5 |
| 9/9/10 | 7.34 |
| 9/9/10 | 7.56 |
| 9/9/10 | 7.78 |
| 9/9/10 | 7.58 |
| 9/9/10 | 7.46 |
| 9/9/10 | 7.58 |
| 9/9/10 | 7.26 |
| 9/9/10 | 7.18 |
| 9/9/10 | 6.97 |
| 9/9/10 | 6.93 |
| 9/9/10 | 6.84 |
| 9/9/10 | 6.86 |
| 9/9/10 | 6.72 |
| 9/10/10 | 6.68 |
| 9/10/10 | 6.68 |
| 9/10/10 | 6.66 |
| 9/10/10 | 6.6 |
| 9/10/10 | 6.49 |
| 9/10/10 | 6.45 |
| 9/10/10 | 6.42 |
| 9/10/10 | 6.28 |
| 9/10/10 | 6.48 |
| 9/10/10 | 6.37 |
| 9/10/10 | 6.25 |
| 9/10/10 | 6.25 |
| 9/10/10 | 6.18 |
| 9/10/10 | 6.28 |
| 9/10/10 | 6.2 |
| 9/10/10 | 6.21 |
| 9/10/10 | 6.34 |
| 9/10/10 | 6.3 |
| 9/10/10 | 6.26 |
| 9/10/10 | 6.51 |
| 9/10/10 | 6.56 |
| 9/10/10 | 6.52 |
| 9/10/10 | 6.57 |
| 9/10/10 | 6.4 |
| 9/10/10 | 6.28 |
| 9/10/10 | 6.27 |
| 9/10/10 | 6.71 |
| 9/10/10 | 6.84 |
| 9/10/10 | 6.93 |
| 9/10/10 | 6.8 |
| 9/10/10 | 7.18 |
| 9/10/10 | 7.46 |
| 9/10/10 | 7.27 |
| 9/10/10 | 7.39 |
| 9/10/10 | 7.35 |
| 9/10/10 | 7.83 |
| 9/10/10 | 7.74 |
| 9/10/10 | 7.92 |
| 9/10/10 | 7.28 |
| 9/10/10 | 6.96 |
| 9/10/10 | 7.12 |
| 9/10/10 | 7.49 |
| 9/10/10 | 7.3 |
| 9/10/10 | 7.24 |
| 9/10/10 | 7.59 |
| 9/10/10 | 7.65 |
| 9/10/10 | 7.45 |
| 9/10/10 | 7.14 |
| 9/11/10 | 7.09 |
| 9/11/10 | 6.9 |
| 9/11/10 | 6.63 |
| 9/11/10 | 6.48 |
| 9/11/10 | 6.66 |
| 9/11/10 | 6.75 |
| 9/11/10 | 6.63 |
| 9/11/10 | 6.61 |
| 9/11/10 | 6.63 |
| 9/11/10 | 6.55 |
| 9/11/10 | 6.46 |
| 9/11/10 | 6.31 |
| 9/11/10 | 6.58 |
| 9/11/10 | 6.49 |
| 9/11/10 | 6.52 |
| 9/11/10 | 6.39 |
| 9/11/10 | 6.44 |
| 9/11/10 | 6.41 |
| 9/11/10 | 6.38 |
| 9/11/10 | 6.4 |
| 9/11/10 | 6.49 |
| 9/11/10 | 6.64 |
| 9/11/10 | 6.72 |
| 9/11/10 | 6.78 |
| 9/11/10 | 6.98 |
| 9/11/10 | 7.1 |
| 9/11/10 | 7.22 |
| 9/11/10 | 7.37 |
| 9/11/10 | 7.48 |
| 9/11/10 | 7.64 |
| 9/11/10 | 7.68 |
| 9/11/10 | 7.7 |
| 9/11/10 | 7.77 |
| 9/11/10 | 8.01 |
| 9/11/10 | 8.23 |
| 9/11/10 | 8.27 |
| 9/11/10 | 8.19 |
| 9/11/10 | 8.23 |
| 9/11/10 | 8.03 |
| 9/11/10 | 7.85 |
| 9/11/10 | 7.78 |
| 9/11/10 | 7.55 |
| 9/11/10 | 7.62 |
| 9/11/10 | 7.61 |
| 9/11/10 | 7.38 |
| 9/11/10 | 6.95 |
| 9/11/10 | 7.06 |
| 9/11/10 | 7.4 |
| 9/12/10 | 7.19 |
| 9/12/10 | 7.35 |
| 9/12/10 | 7.55 |
| 9/12/10 | 7.52 |
| 9/12/10 | 7.46 |
| 9/12/10 | 7.4 |
| 9/12/10 | 7.29 |
| 9/12/10 | 7 |
| 9/12/10 | 6.77 |
| 9/12/10 | 6.77 |
| 9/12/10 | 6.72 |
| 9/12/10 | 6.77 |
| 9/12/10 | 6.85 |
| 9/12/10 | 6.69 |
| 9/12/10 | 6.65 |
| 9/12/10 | 6.46 |
| 9/12/10 | 6.55 |
| 9/12/10 | 6.51 |
| 9/12/10 | 6.27 |
| 9/12/10 | 6.4 |
| 9/12/10 | 6.35 |
| 9/12/10 | 6.4 |
| 9/12/10 | 6.4 |
| 9/12/10 | 6.73 |
| 9/12/10 | 6.74 |
| 9/12/10 | 6.79 |
| 9/12/10 | 6.88 |
| 9/12/10 | 6.92 |
| 9/12/10 | 6.91 |
| 9/12/10 | 7.14 |
| 9/12/10 | 7.52 |
| 9/12/10 | 7.23 |
| 9/12/10 | 7.29 |
| 9/12/10 | 7.35 |
| 9/12/10 | 7.13 |
| 9/12/10 | 6.88 |
| 9/12/10 | 7.06 |
| 9/12/10 | 7.32 |
| 9/12/10 | 6.82 |
| 9/12/10 | 6.61 |
| 9/12/10 | 7.28 |
| 9/12/10 | 7.83 |
| 9/12/10 | 7.85 |
| 9/12/10 | 7.79 |
| 9/12/10 | 7.76 |
| 9/12/10 | 7.59 |
| 9/12/10 | 7.33 |
| 9/12/10 | 7.38 |
| 9/13/10 | 7.12 |
| 9/13/10 | 7.16 |
| 9/13/10 | 6.9 |
| 9/13/10 | 6.8 |
| 9/13/10 | 6.35 |
| 9/13/10 | 6.31 |
| 9/13/10 | 6.41 |
| 9/13/10 | 6.34 |
| 9/13/10 | 6.36 |
| 9/13/10 | 6.28 |
| 9/13/10 | 6.2 |
| 9/13/10 | 6.32 |
| 9/13/10 | 6.23 |
| 9/13/10 | 6.25 |
| 9/13/10 | 6.1 |
| 9/13/10 | 5.94 |
| 9/13/10 | 6 |
| 9/13/10 | 5.96 |
| 9/13/10 | 5.97 |
| 9/13/10 | 6.1 |
| 9/13/10 | 6.08 |
| 9/13/10 | 6.37 |
| 9/13/10 | 6.38 |
| 9/13/10 | 6.41 |
| 9/13/10 | 6.54 |
| 9/13/10 | 6.54 |
| 9/13/10 | 6.76 |
| 9/13/10 | 7.08 |
| 9/13/10 | 6.79 |
| 9/13/10 | 7.26 |
| 9/13/10 | 6.84 |
| 9/13/10 | 6.85 |
| 9/13/10 | 7.19 |
| 9/13/10 | 6.96 |
| 9/13/10 | 6.93 |
| 9/13/10 | 7.92 |
| 9/13/10 | 7.57 |
| 9/13/10 | 7.8 |
| 9/13/10 | 7.31 |
| 9/13/10 | 7.79 |
| 9/13/10 | 7.99 |
| 9/13/10 | 8.17 |
| 9/13/10 | 7.96 |
| 9/13/10 | 8.08 |
| 9/13/10 | 8.05 |
| 9/13/10 | 8.01 |
| 9/13/10 | 7.82 |
| 9/13/10 | 7.75 |
| 9/14/10 | 7.81 |
| 9/14/10 | 7.74 |
| 9/14/10 | 7.74 |
| 9/14/10 | 7.7 |
| 9/14/10 | 7.51 |
| 9/14/10 | 7.46 |
| 9/14/10 | 7.43 |
| 9/14/10 | 7.28 |
| 9/14/10 | 7.12 |
| 9/14/10 | 7.12 |
| 9/14/10 | 6.96 |
| 9/14/10 | 6.83 |
| 9/14/10 | 6.64 |
| 9/14/10 | 6.58 |
| 9/14/10 | 6.51 |
| 9/14/10 | 6.57 |
| 9/14/10 | 6.58 |
| 9/14/10 | 6.55 |
| 9/14/10 | 6.55 |
| 9/14/10 | 6.6 |
| 9/14/10 | 6.83 |
| 9/14/10 | 6.75 |
| 9/14/10 | 6.91 |
| 9/14/10 | 7.12 |
| 9/14/10 | 7.16 |
| 9/14/10 | 6.94 |
| 9/14/10 | 6.43 |
| 9/14/10 | 7.03 |
| 9/14/10 | 7.1 |
| 9/14/10 | 7.04 |
| 9/14/10 | 6.85 |
| 9/14/10 | 7.3 |
| 9/14/10 | 7.31 |
| 9/14/10 | 7.28 |
| 9/14/10 | 7.36 |
| 9/14/10 | 7.25 |
| 9/14/10 | 7.4 |
| 9/14/10 | 7.79 |
| 9/14/10 | 8.1 |
| 9/14/10 | 8.3 |
| 9/14/10 | 7.96 |
| 9/14/10 | 7.64 |
| 9/14/10 | 8.14 |
| 9/14/10 | 8.04 |
| 9/14/10 | 7.99 |
| 9/14/10 | 7.81 |
| 9/14/10 | 7.81 |
| 9/14/10 | 7.74 |
| 9/15/10 | 7.63 |
| 9/15/10 | 7.65 |
| 9/15/10 | 7.68 |
| 9/15/10 | 7.69 |
| 9/15/10 | 7.69 |
| 9/15/10 | 7.47 |
| 9/15/10 | 7.23 |
| 9/15/10 | 7.26 |
| 9/15/10 | 7.21 |
| 9/15/10 | 6.82 |
| 9/15/10 | 7.05 |
| 9/15/10 | 6.82 |
| 9/15/10 | 6.81 |
| 9/15/10 | 6.74 |
| 9/15/10 | 6.76 |
| 9/15/10 | 6.68 |
| 9/15/10 | 6.66 |
| 9/15/10 | 6.66 |
| 9/15/10 | 6.59 |
| 9/15/10 | 6.53 |
| 9/15/10 | 6.64 |
| 9/15/10 | 6.87 |
| 9/15/10 | 6.95 |
| 9/15/10 | 7.03 |
| 9/15/10 | 7.29 |
| 9/15/10 | 7.69 |
| 9/15/10 | 7.82 |
| 9/15/10 | 7.57 |
| 9/15/10 | 7.59 |
| 9/15/10 | 7.77 |
| 9/15/10 | 7.81 |
| 9/15/10 | 8.04 |
| 9/15/10 | 8.44 |
| 9/15/10 | 8.51 |
| 9/15/10 | 8.04 |
| 9/15/10 | 8.62 |
| 9/15/10 | 8.72 |
| 9/15/10 | 8.46 |
| 9/15/10 | 8.38 |
| 9/15/10 | 8.43 |
| 9/15/10 | 8.5 |
| 9/15/10 | 8.28 |
| 9/15/10 | 8.29 |
| 9/15/10 | 8.19 |
| 9/15/10 | 7.65 |
| 9/15/10 | 8.04 |
| 9/15/10 | 7.86 |
| 9/15/10 | 7.9 |
| 9/16/10 | 7.68 |
| 9/16/10 | 7.98 |
| 9/16/10 | 7.9 |
| 9/16/10 | 8.07 |
| 9/16/10 | 7.82 |
| 9/16/10 | 7.76 |
| 9/16/10 | 7.6 |
| 9/16/10 | 7.3 |
| 9/16/10 | 7.5 |
| 9/16/10 | 7.22 |
| 9/16/10 | 7.31 |
| 9/16/10 | 7.11 |
| 9/16/10 | 7.13 |
| 9/16/10 | 6.95 |
| 9/16/10 | 7.15 |
| 9/16/10 | 6.94 |
| 9/16/10 | 6.79 |
| 9/16/10 | 6.94 |
| 9/16/10 | 7.02 |
| 9/16/10 | 6.82 |
| 9/16/10 | 6.75 |
| 9/16/10 | 6.77 |
| 9/16/10 | 6.84 |
| 9/16/10 | 6.81 |
| 9/16/10 | 6.95 |
| 9/16/10 | 7.02 |
| 9/16/10 | 6.97 |
| 9/16/10 | 6.72 |
| 9/16/10 | 6.84 |
| 9/16/10 | 6.57 |
| 9/16/10 | 6.82 |
| 9/16/10 | 6.9 |
| 9/16/10 | 6.96 |
| 9/16/10 | 6.76 |
| 9/16/10 | 6.9 |
| 9/16/10 | 6.75 |
| 9/16/10 | 6.93 |
| 9/16/10 | 6.7 |
| 9/16/10 | 6.68 |
| 9/16/10 | 6.37 |
| 9/16/10 | 6.63 |
| 9/16/10 | 6.42 |
| 9/16/10 | 6.5 |
| 9/16/10 | 6.67 |
| 9/16/10 | 6.76 |
| 9/16/10 | 6.63 |
| 9/16/10 | 6.58 |
| 9/16/10 | 6.37 |
| 9/17/10 | 6.42 |
| 9/17/10 | 6.41 |
| 9/17/10 | 6.23 |
| 9/17/10 | 6.09 |
| 9/17/10 | 6.25 |
| 9/17/10 | 6.12 |
| 9/17/10 | 6.31 |
| 9/17/10 | 6.34 |
| 9/17/10 | 6.04 |
| 9/17/10 | 6.31 |
| 9/17/10 | 6.27 |
| 9/17/10 | 6.19 |
| 9/17/10 | 6.18 |
| 9/17/10 | 6.02 |
| 9/17/10 | 5.92 |
| 9/17/10 | 5.7 |
| 9/17/10 | 6.09 |
| 9/17/10 | 5.85 |
| 9/17/10 | 5.93 |
| 9/17/10 | 6.01 |
| 9/17/10 | 5.86 |
| 9/17/10 | 5.77 |
| 9/17/10 | 6.15 |
| 9/17/10 | 5.72 |
| 9/17/10 | 5.82 |
| 9/17/10 | 5.94 |
| 9/17/10 | 6.14 |
| 9/17/10 | 6.21 |
| 9/17/10 | 6.26 |
| 9/17/10 | 6.26 |
| 9/17/10 | 6.32 |
| 9/17/10 | 6.13 |
| 9/17/10 | 5.91 |
| 9/17/10 | 6.33 |
| 9/17/10 | 6.33 |
| 9/17/10 | 6.32 |
| 9/17/10 | 6.29 |
| 9/17/10 | 5.96 |
| 9/17/10 | 5.97 |
| 9/17/10 | 6.15 |
| 9/17/10 | 6.5 |
| 9/17/10 | 6.41 |
| 9/17/10 | 6.17 |
| 9/17/10 | 5.99 |
| 9/17/10 | 5.98 |
| 9/17/10 | 5.99 |
| 9/17/10 | 6.02 |
| 9/17/10 | 5.84 |
| 9/18/10 | 5.95 |
| 9/18/10 | 5.75 |
| 9/18/10 | 5.94 |
| 9/18/10 | 5.81 |
| 9/18/10 | 5.87 |
| 9/18/10 | 5.79 |
| 9/18/10 | 5.83 |
| 9/18/10 | 5.73 |
| 9/18/10 | 5.71 |
| 9/18/10 | 5.64 |
| 9/18/10 | 5.69 |
| 9/18/10 | 5.76 |
| 9/18/10 | 5.79 |
| 9/18/10 | 5.99 |
| 9/18/10 | 5.81 |
| 9/18/10 | 5.88 |
| 9/18/10 | 5.75 |
| 9/18/10 | 5.89 |
| 9/18/10 | 5.61 |
| 9/18/10 | 5.86 |
| 9/18/10 | 5.65 |
| 9/18/10 | 5.73 |
| 9/18/10 | 5.82 |
| 9/18/10 | 6.05 |
| 9/18/10 | 6.23 |
| 9/18/10 | 6.31 |
| 9/18/10 | 6.52 |
| 9/18/10 | 6.65 |
| 9/18/10 | 6.89 |
| 9/18/10 | 7.32 |
| 9/18/10 | 6.97 |
| 9/18/10 | 7.34 |
| 9/18/10 | 7.82 |
| 9/18/10 | 6.72 |
| 9/18/10 | 7.47 |
| 9/18/10 | 7.72 |
| 9/18/10 | 7.69 |
| 9/18/10 | 7.85 |
| 9/18/10 | 7.74 |
| 9/18/10 | 7.68 |
| 9/18/10 | 7.56 |
| 9/18/10 | 7.58 |
| 9/18/10 | 7.78 |
| 9/18/10 | 7.61 |
| 9/18/10 | 7.55 |
| 9/18/10 | 7.65 |
| 9/18/10 | 7.56 |
| 9/18/10 | 7.4 |
| 9/19/10 | 7.62 |
| 9/19/10 | 7.56 |
| 9/19/10 | 7.53 |
| 9/19/10 | 7.4 |
| 9/19/10 | 7.65 |
| 9/19/10 | 7.69 |
| 9/19/10 | 7.73 |
| 9/19/10 | 7.33 |
| 9/19/10 | 7.5 |
| 9/19/10 | 7.43 |
| 9/19/10 | 7.43 |
| 9/19/10 | 7.52 |
| 9/19/10 | 7.23 |
| 9/19/10 | 7.14 |
| 9/19/10 | 7.4 |
| 9/19/10 | 7.19 |
| 9/19/10 | 7.22 |
| 9/19/10 | 7.33 |
| 9/19/10 | 7.32 |
| 9/19/10 | 7.46 |
| 9/19/10 | 7.4 |
| 9/19/10 | 7.33 |
| 9/19/10 | 7.51 |
| 9/19/10 | 7.45 |
| 9/19/10 | 7.6 |
| 9/19/10 | 7.61 |
| 9/19/10 | 7.79 |
| 9/19/10 | 7.93 |
| 9/19/10 | 8.34 |
| 9/19/10 | 8.4 |
| 9/19/10 | 8.46 |
| 9/19/10 | 8.51 |
| 9/19/10 | 8.56 |
| 9/19/10 | 8.42 |
| 9/19/10 | 8.14 |
| 9/19/10 | 8.15 |
| 9/19/10 | 8.19 |
| 9/19/10 | 8.4 |
| 9/19/10 | 8.01 |
| 9/19/10 | 8.47 |
| 9/19/10 | 8.51 |
| 9/19/10 | 8.37 |
| 9/19/10 | 8.17 |
| 9/19/10 | 8.41 |
| 9/19/10 | 8.28 |
| 9/19/10 | 8.16 |
| 9/19/10 | 8.19 |
| 9/19/10 | 7.96 |
| 9/20/10 | 8.05 |
| 9/20/10 | 7.89 |
| 9/20/10 | 8.09 |
| 9/20/10 | 7.76 |
| 9/20/10 | 7.76 |
| 9/20/10 | 7.54 |
| 9/20/10 | 7.75 |
| 9/20/10 | 7.46 |
| 9/20/10 | 7.34 |
| 9/20/10 | 7.03 |
| 9/20/10 | 7.08 |
| 9/20/10 | 7.04 |
| 9/20/10 | 6.46 |
| 9/20/10 | 6.73 |
| 9/20/10 | 6.39 |
| 9/20/10 | 6.49 |
| 9/20/10 | 6.46 |
| 9/20/10 | 6.43 |
| 9/20/10 | 6.58 |
| 9/20/10 | 6.52 |
| 9/20/10 | 6.61 |
| 9/20/10 | 6.58 |
| 9/20/10 | 7 |
| 9/20/10 | 7.16 |
| 9/20/10 | 7.34 |
| 9/20/10 | 7.49 |
| 9/20/10 | 7.69 |
| 9/20/10 | 7.83 |
| 9/20/10 | 7.98 |
| 9/20/10 | 8.14 |
| 9/20/10 | 8.36 |
| 9/20/10 | 8.53 |
| 9/20/10 | 8.62 |
| 9/20/10 | 8.62 |
| 9/20/10 | 8.77 |
| 9/20/10 | 8.69 |
| 9/20/10 | 7.45 |
| 9/20/10 | 8.33 |
| 9/20/10 | 8.24 |
| 9/20/10 | 8.48 |
| 9/20/10 | 8.16 |
| 9/20/10 | 8.12 |
| 9/20/10 | 8.34 |
| 9/20/10 | 8.35 |
| 9/20/10 | 8.35 |
| 9/20/10 | 8.29 |
| 9/20/10 | 8.26 |
| 9/20/10 | 8.15 |
| 9/21/10 | 8.08 |
| 9/21/10 | 7.86 |
| 9/21/10 | 7.92 |
| 9/21/10 | 7.72 |
| 9/21/10 | 7.55 |
| 9/21/10 | 7.46 |
| 9/21/10 | 7.47 |
| 9/21/10 | 7.59 |
| 9/21/10 | 7.28 |
| 9/21/10 | 6.84 |
| 9/21/10 | 6.64 |
| 9/21/10 | 6.96 |
| 9/21/10 | 6.91 |
| 9/21/10 | 6.83 |
| 9/21/10 | 6.96 |
| 9/21/10 | 6.99 |
| 9/21/10 | 6.91 |
| 9/21/10 | 6.9 |
| 9/21/10 | 6.94 |
| 9/21/10 | 6.84 |
| 9/21/10 | 6.86 |
| 9/21/10 | 6.83 |
| 9/21/10 | 7.09 |
| 9/21/10 | 7.06 |
| 9/21/10 | 7.36 |
| 9/21/10 | 7.4 |
| 9/21/10 | 7.24 |
| 9/21/10 | 7.8 |
| 9/21/10 | 8 |
| 9/21/10 | 7.21 |
| 9/21/10 | 8.37 |
| 9/21/10 | 8.28 |
| 9/21/10 | 8.69 |
| 9/21/10 | 8.59 |
| 9/21/10 | 8.13 |
| 9/21/10 | 7.95 |
| 9/21/10 | 7.38 |
| 9/21/10 | 8.63 |
| 9/21/10 | 8.18 |
| 9/21/10 | 7.99 |
| 9/21/10 | 8.37 |
| 9/21/10 | 7.77 |
| 9/21/10 | 8.13 |
| 9/21/10 | 8.18 |
| 9/21/10 | 8.21 |
| 9/21/10 | 8.29 |
| 9/21/10 | 8.28 |
| 9/21/10 | 8.47 |
| 9/22/10 | 8.44 |
| 9/22/10 | 8.32 |
| 9/22/10 | 7.87 |
| 9/22/10 | 7.88 |
| 9/22/10 | 7.96 |
| 9/22/10 | 7.53 |
| 9/22/10 | 7.55 |
| 9/22/10 | 7.42 |
| 9/22/10 | 7.53 |
| 9/22/10 | 7.43 |
| 9/22/10 | 7.39 |
| 9/22/10 | 7.2 |
| 9/22/10 | 7.22 |
| 9/22/10 | 7.41 |
| 9/22/10 | 7.34 |
| 9/22/10 | 7.57 |
| 9/22/10 | 7.29 |
| 9/22/10 | 7.33 |
| 9/22/10 | 7.24 |
| 9/22/10 | 7.39 |
| 9/22/10 | 7.26 |
| 9/22/10 | 7.15 |
| 9/22/10 | 7.38 |
| 9/22/10 | 7.34 |
| 9/22/10 | 7.76 |
| 9/22/10 | 7.72 |
| 9/22/10 | 7.56 |
| 9/22/10 | 7.69 |
| 9/22/10 | 7.49 |
| 9/22/10 | 8.07 |
| 9/22/10 | 8.1 |
| 9/22/10 | 7.79 |
| 9/22/10 | 8.11 |
| 9/22/10 | 8.24 |
| 9/22/10 | 8.33 |
| 9/22/10 | 8.42 |
| 9/22/10 | 8.44 |
| 9/22/10 | 7.96 |
| 9/22/10 | 8.5 |
| 9/22/10 | 8.3 |
| 9/22/10 | 8.03 |
| 9/22/10 | 8.58 |
| 9/22/10 | 8.63 |
| 9/22/10 | 8.55 |
| 9/22/10 | 8.31 |
| 9/22/10 | 8.2 |
| 9/22/10 | 7.96 |
| 9/22/10 | 7.69 |
| 9/23/10 | 7.61 |
| 9/23/10 | 7.52 |
| 9/23/10 | 7.62 |
| 9/23/10 | 7.51 |
| 9/23/10 | 7.28 |
| 9/23/10 | 7.21 |
| 9/23/10 | 6.97 |
| 9/23/10 | 7.16 |
| 9/23/10 | 7.37 |
| 9/23/10 | 7.1 |
| 9/23/10 | 6.82 |
| 9/23/10 | 6.81 |
| 9/23/10 | 6.92 |
| 9/23/10 | 7.42 |
| 9/23/10 | 7.02 |
| 9/23/10 | 7.07 |
| 9/23/10 | 7.41 |
| 9/23/10 | 7.55 |
| 9/23/10 | 7.39 |
| 9/23/10 | 7.15 |
| 9/23/10 | 7.15 |
| 9/23/10 | 7.4 |
| 9/23/10 | 7.64 |
| 9/23/10 | 8.09 |
| 9/23/10 | 7.99 |
| 9/23/10 | 8.07 |
| 9/23/10 | 8.13 |
| 9/23/10 | 8.27 |
| 9/23/10 | 8.54 |
| 9/23/10 | 8.32 |
| 9/23/10 | 8.18 |
| 9/23/10 | 8.4 |
| 9/23/10 | 8.37 |
| 9/23/10 | 7.76 |
| 9/23/10 | 7.95 |
| 9/23/10 | 8.89 |
| 9/23/10 | 9.05 |
| 9/23/10 | 9.5 |
| 9/23/10 | 9.11 |
| 9/23/10 | 8.85 |
| 9/23/10 | 9.09 |
| 9/23/10 | 8.28 |
| 9/23/10 | 8.9 |
| 9/23/10 | 8.64 |
| 9/23/10 | 8.59 |
| 9/23/10 | 8.8 |
| 9/23/10 | 8.93 |
| 9/23/10 | 8.79 |
| 9/24/10 | 8.75 |
| 9/24/10 | 8.82 |
| 9/24/10 | 8.52 |
| 9/24/10 | 8.23 |
| 9/24/10 | 8.27 |
| 9/24/10 | 8.33 |
| 9/24/10 | 8.09 |
| 9/24/10 | 8.23 |
| 9/24/10 | 7.93 |
| 9/24/10 | 7.84 |
| 9/24/10 | 7.77 |
| 9/24/10 | 7.51 |
| 9/24/10 | 7.23 |
| 9/24/10 | 7.59 |
| 9/24/10 | 7.51 |
| 9/24/10 | 7.5 |
| 9/24/10 | 7.77 |
| 9/24/10 | 7.39 |
| 9/24/10 | 7.51 |
| 9/24/10 | 7.55 |
| 9/24/10 | 7.57 |
| 9/24/10 | 7.6 |
| 9/24/10 | 7.86 |
| 9/24/10 | 7.95 |
| 9/24/10 | 8.05 |
| 9/24/10 | 8.01 |
| 9/24/10 | 8.49 |
| 9/24/10 | 8.31 |
| 9/24/10 | 8.47 |
| 9/24/10 | 8.72 |
| 9/24/10 | 8.11 |
| 9/24/10 | 7.81 |
| 9/24/10 | 8.09 |
| 9/24/10 | 8.24 |
| 9/24/10 | 8.4 |
| 9/24/10 | 8.43 |
| 9/24/10 | 8.75 |
| 9/24/10 | 9.07 |
| 9/24/10 | 9.02 |
| 9/24/10 | 8.9 |
| 9/24/10 | 8.44 |
| 9/24/10 | 8.67 |
| 9/24/10 | 8.15 |
| 9/24/10 | 8.22 |
| 9/24/10 | 8.08 |
| 9/24/10 | 7.98 |
| 9/24/10 | 8.2 |
| 9/24/10 | 8.26 |
| 9/25/10 | 8.22 |
| 9/25/10 | 8.24 |
| 9/25/10 | 8.01 |
| 9/25/10 | 7.87 |
| 9/25/10 | 7.98 |
| 9/25/10 | 7.94 |
| 9/25/10 | 7.6 |
| 9/25/10 | 7.63 |
| 9/25/10 | 7.49 |
| 9/25/10 | 7.56 |
| 9/25/10 | 7.61 |
| 9/25/10 | 7.45 |
| 9/25/10 | 7.38 |
| 9/25/10 | 7.32 |
| 9/25/10 | 7.29 |
| 9/25/10 | 7.37 |
| 9/25/10 | 7.27 |
| 9/25/10 | 7.42 |
| 9/25/10 | 7.63 |
| 9/25/10 | 7.66 |
| 9/25/10 | 7.49 |
| 9/25/10 | 7.51 |
| 9/25/10 | 7.59 |
| 9/25/10 | 7.57 |
| 9/25/10 | 7.66 |
| 9/25/10 | 7.79 |
| 9/25/10 | 7.88 |
| 9/25/10 | 7.92 |
| 9/25/10 | 7.41 |
| 9/25/10 | 6.55 |
| 9/25/10 | 7.35 |
| 9/25/10 | 7.52 |
| 9/25/10 | 7.52 |
| 9/25/10 | 7.47 |
| 9/25/10 | 7.49 |
| 9/25/10 | 7.52 |
| 9/25/10 | 7.62 |
| 9/25/10 | 8.38 |
| 9/25/10 | 8.27 |
| 9/25/10 | 8.52 |
| 9/25/10 | 8.4 |
| 9/25/10 | 8.16 |
| 9/25/10 | 8.02 |
| 9/25/10 | 7.98 |
| 9/25/10 | 7.79 |
| 9/25/10 | 7.78 |
| 9/25/10 | 7.56 |
| 9/25/10 | 7.73 |
| 9/26/10 | 7.52 |
| 9/26/10 | 7.51 |
| 9/26/10 | 7.48 |
| 9/26/10 | 7.35 |
| 9/26/10 | 7.04 |
| 9/26/10 | 7.08 |
| 9/26/10 | 7.06 |
| 9/26/10 | 6.82 |
| 9/26/10 | 6.76 |
| 9/26/10 | 6.8 |
| 9/26/10 | 6.81 |
| 9/26/10 | 6.79 |
| 9/26/10 | 6.76 |
| 9/26/10 | 6.65 |
| 9/26/10 | 6.56 |
| 9/26/10 | 6.6 |
| 9/26/10 | 6.44 |
| 9/26/10 | 6.53 |
| 9/26/10 | 6.69 |
| 9/26/10 | 6.65 |
| 9/26/10 | 6.46 |
| 9/26/10 | 6.77 |
| 9/26/10 | 6.78 |
| 9/26/10 | 6.83 |
| 9/26/10 | 6.92 |
| 9/26/10 | 7.06 |
| 9/26/10 | 7.14 |
| 9/26/10 | 6.92 |
| 9/26/10 | 7.34 |
| 9/26/10 | 7.49 |
| 9/26/10 | 7.5 |
| 9/26/10 | 7.66 |
| 9/26/10 | 7.53 |
| 9/26/10 | 7.63 |
| 9/26/10 | 7.72 |
| 9/26/10 | 7.72 |
| 9/26/10 | 7.39 |
| 9/26/10 | 7.65 |
| 9/26/10 | 7.38 |
| 9/26/10 | 7.41 |
| 9/26/10 | 7.29 |
| 9/26/10 | 7.29 |
| 9/26/10 | 7.31 |
| 9/26/10 | 7 |
| 9/26/10 | 7.09 |
| 9/26/10 | 7.18 |
| 9/26/10 | 7.01 |
| 9/26/10 | 6.93 |
| 9/27/10 | 6.62 |
| 9/27/10 | 6.88 |
| 9/27/10 | 6.7 |
| 9/27/10 | 6.61 |
| 9/27/10 | 6.67 |
| 9/27/10 | 6.88 |
| 9/27/10 | 6.78 |
| 9/27/10 | 6.61 |
| 9/27/10 | 6.47 |
| 9/27/10 | 6.49 |
| 9/27/10 | 6.49 |
| 9/27/10 | 6.5 |
| 9/27/10 | 6.44 |
| 9/27/10 | 6.48 |
| 9/27/10 | 6.47 |
| 9/27/10 | 6.51 |
| 9/27/10 | 6.36 |
| 9/27/10 | 6.32 |
| 9/27/10 | 6.19 |
| 9/27/10 | 6.22 |
| 9/27/10 | 6.23 |
| 9/27/10 | 6.37 |
| 9/27/10 | 6.26 |
| 9/27/10 | 6.08 |
| 9/27/10 | 6.14 |
| 9/27/10 | 6.42 |
| 9/27/10 | 6.35 |
| 9/27/10 | 6.52 |
| 9/27/10 | 6.34 |
| 9/27/10 | 6.55 |
| 9/27/10 | 6.68 |
| 9/27/10 | 6.41 |
| 9/27/10 | 6.71 |
| 9/27/10 | 6.72 |
| 9/27/10 | 7 |
| 9/27/10 | 7.08 |
| 9/27/10 | 7.04 |
| 9/27/10 | 7.2 |
| 9/27/10 | 7.22 |
| 9/27/10 | 7.25 |
| 9/27/10 | 7.09 |
| 9/27/10 | 6.82 |
| 9/27/10 | 6.64 |
| 9/27/10 | 6.68 |
| 9/27/10 | 6.71 |
| 9/27/10 | 6.48 |
| 9/27/10 | 6.41 |
| 9/27/10 | 6.6 |
| 9/28/10 | 6.46 |
| 9/28/10 | 6.46 |
| 9/28/10 | 6.54 |
| 9/28/10 | 6.32 |
| 9/28/10 | 6.2 |
| 9/28/10 | 6.1 |
| 9/28/10 | 6.15 |
| 9/28/10 | 6.04 |
| 9/28/10 | 6.34 |
| 9/28/10 | 6.19 |
| 9/28/10 | 5.87 |
| 9/28/10 | 6.01 |
| 9/28/10 | 6.22 |
| 9/28/10 | 6.09 |
| 9/28/10 | 5.86 |
| 9/28/10 | 5.67 |
| 9/28/10 | 5.62 |
| 9/28/10 | 5.66 |
| 9/28/10 | 5.76 |
| 9/28/10 | 5.7 |
| 9/28/10 | 5.81 |
| 9/28/10 | 5.96 |
| 9/28/10 | 6.09 |
| 9/28/10 | 6.12 |
| 9/28/10 | 6.14 |
| 9/28/10 | 6.22 |
| 9/28/10 | 6.12 |
| 9/28/10 | 6.22 |
| 9/28/10 | 6.2 |
| 9/28/10 | 6.07 |
| 9/28/10 | 6.03 |
| 9/28/10 | 5.93 |
| 9/28/10 | 5.99 |
| 9/28/10 | 5.86 |
| 9/28/10 | 5.96 |
| 9/28/10 | 6.02 |
| 9/28/10 | 6.04 |
| 9/28/10 | 6.01 |
| 9/28/10 | 5.93 |
| 9/28/10 | 5.77 |
| 9/28/10 | 5.93 |
| 9/28/10 | 5.85 |
| 9/28/10 | 5.7 |
| 9/28/10 | 5.87 |
| 9/28/10 | 5.9 |
| 9/28/10 | 5.65 |
| 9/28/10 | 5.61 |
| 9/28/10 | 5.58 |
| 9/29/10 | 5.72 |
| 9/29/10 | 5.73 |
| 9/29/10 | 5.44 |
| 9/29/10 | 5.56 |
| 9/29/10 | 5.52 |
| 9/29/10 | 5.49 |
| 9/29/10 | 5.51 |
| 9/29/10 | 5.54 |
| 9/29/10 | 5.3 |
| 9/29/10 | 5.38 |
| 9/29/10 | 5.34 |
| 9/29/10 | 5.49 |
| 9/29/10 | 5.22 |
| 9/29/10 | 5.22 |
| 9/29/10 | 5.31 |
| 9/29/10 | 5.27 |
| 9/29/10 | 5.25 |
| 9/29/10 | 5.1 |
| 9/29/10 | 5.33 |
| 9/29/10 | 5.25 |
| 9/29/10 | 5.44 |
| 9/29/10 | 5.66 |
| 9/29/10 | 5.63 |
| 9/29/10 | 5.55 |
| 9/29/10 | 5.6 |
| 9/29/10 | 5.73 |
| 9/29/10 | 5.95 |
| 9/29/10 | 5.86 |
| 9/29/10 | 5.57 |
| 9/29/10 | 5.81 |
| 9/29/10 | 5.8 |
| 9/29/10 | 5.75 |
| 9/29/10 | 5.98 |
| 9/29/10 | 6 |
| 9/29/10 | 5.82 |
| 9/29/10 | 6.4 |
| 9/29/10 | 6.07 |
| 9/29/10 | 5.9 |
| 9/29/10 | 5.57 |
| 9/29/10 | 5.23 |
| 9/29/10 | 4.89 |
| 9/29/10 | 5.28 |
| 9/29/10 | 5.54 |
| 9/29/10 | 5.21 |
| 9/29/10 | 4.85 |
| 9/29/10 | 5.43 |
| 9/29/10 | 5.31 |
| 9/29/10 | 7.27 |
| 9/30/10 | 6.51 |
| 9/30/10 | 7.05 |
| 9/30/10 | 5.59 |
| 9/30/10 | 6.56 |
| 9/30/10 | 5.99 |
| 9/30/10 | 5.79 |
| 9/30/10 | 5.8 |
| 9/30/10 | 6.02 |
| 9/30/10 | 6.18 |
| 9/30/10 | 6.4 |
| 9/30/10 | 6.41 |
| 9/30/10 | 6.03 |
| 9/30/10 | 6.27 |
| 9/30/10 | 6.04 |
| 9/30/10 | 6.01 |
| 9/30/10 | 6.04 |
| 9/30/10 | 5.9 |
| 9/30/10 | 5.76 |
| 9/30/10 | 5.57 |
| 9/30/10 | 5.74 |
| 9/30/10 | 5.98 |
| 9/30/10 | 5.73 |
| 9/30/10 | 5.41 |
| 9/30/10 | 5.5 |
| 9/30/10 | 5.72 |
| 9/30/10 | 5.6 |
| 9/30/10 | 5.58 |
| 9/30/10 | 5.41 |
| 9/30/10 | 5.7 |
| 9/30/10 | 5.89 |
| 9/30/10 | 6.11 |
| 9/30/10 | 6.12 |
| 9/30/10 | 6.39 |
| 9/30/10 | 6.05 |
| 9/30/10 | 6.26 |
| 9/30/10 | 5.94 |
| 9/30/10 | 6.2 |
| 9/30/10 | 5.9 |
| 9/30/10 | 6.2 |
| 9/30/10 | 6.1 |
| 9/30/10 | 5.97 |
| 9/30/10 | 5.87 |
| 9/30/10 | 5.82 |
| 9/30/10 | 5.66 |
| 9/30/10 | 5.71 |
| 9/30/10 | 5.8 |
| 9/30/10 | 5.68 |
| 9/30/10 | 6.01 |
| 10/1/10 | 5.8 |
| 10/1/10 | 5.8 |
| 10/1/10 | 6.17 |
| 10/1/10 | 6.21 |
| 10/1/10 | 6.09 |
| 10/1/10 | 6.02 |
| 10/1/10 | 5.94 |
| 10/1/10 | 5.78 |
| 10/1/10 | 5.61 |
| 10/1/10 | 5.53 |
| 10/1/10 | 5.78 |
| 10/1/10 | 5.59 |
| 10/1/10 | 5.73 |
| 10/1/10 | 5.61 |
| 10/1/10 | 5.52 |
| 10/1/10 | 5.46 |
| 10/1/10 | 5.5 |
| 10/1/10 | 5.6 |
| 10/1/10 | 5.62 |
| 10/1/10 | 5.3 |
| 10/1/10 | 5.86 |
| 10/1/10 | 5.71 |
| 10/1/10 | 5.68 |
| 10/1/10 | 6.12 |
| 10/1/10 | 6.01 |
| 10/1/10 | 5.91 |
| 10/1/10 | 6.07 |
| 10/1/10 | 6.29 |
| 10/1/10 | 6.34 |
| 10/1/10 | 6.64 |
| 10/1/10 | 6.69 |
| 10/1/10 | 6.86 |
| 10/1/10 | 6.9 |
| 10/1/10 | 6.79 |
| 10/1/10 | 6.97 |
| 10/1/10 | 6.85 |
| 10/1/10 | 6.83 |
| 10/1/10 | 7.1 |
| 10/1/10 | 6.96 |
| 10/1/10 | 6.93 |
| 10/1/10 | 7.02 |
| 10/1/10 | 6.84 |
| 10/1/10 | 6.95 |
| 10/1/10 | 6.77 |
| 10/1/10 | 6.67 |
| 10/1/10 | 6.66 |
| 10/1/10 | 6.45 |
| 10/1/10 | 6.44 |
| 10/2/10 | 6.65 |
| 10/2/10 | 6.65 |
| 10/2/10 | 6.51 |
| 10/2/10 | 6.52 |
| 10/2/10 | 6.4 |
| 10/2/10 | 6.51 |
| 10/2/10 | 6.41 |
| 10/2/10 | 6.46 |
| 10/2/10 | 6.55 |
| 10/2/10 | 6.3 |
| 10/2/10 | 6.11 |
| 10/2/10 | 6.35 |
| 10/2/10 | 6.27 |
| 10/2/10 | 6.18 |
| 10/2/10 | 6.08 |
| 10/2/10 | 5.86 |
| 10/2/10 | 5.93 |
| 10/2/10 | 6.06 |
| 10/2/10 | 6.18 |
| 10/2/10 | 5.94 |
| 10/2/10 | 5.95 |
| 10/2/10 | 5.86 |
| 10/2/10 | 6.01 |
| 10/2/10 | 6.34 |
| 10/2/10 | 6.27 |
| 10/2/10 | 6.04 |
| 10/2/10 | 6.95 |
| 10/2/10 | 6.63 |
| 10/2/10 | 6.77 |
| 10/2/10 | 6.92 |
| 10/2/10 | 6.72 |
| 10/2/10 | 6.85 |
| 10/2/10 | 6.83 |
| 10/2/10 | 6.96 |
| 10/2/10 | 6.88 |
| 10/2/10 | 7.08 |
| 10/2/10 | 6.95 |
| 10/2/10 | 7.39 |
| 10/2/10 | 6.81 |
| 10/2/10 | 6.58 |
| 10/2/10 | 6.81 |
| 10/2/10 | 6.75 |
| 10/2/10 | 7.11 |
| 10/2/10 | 7.18 |
| 10/2/10 | 6.9 |
| 10/2/10 | 6.91 |
| 10/2/10 | 7.07 |
| 10/2/10 | 6.92 |
| 10/3/10 | 6.85 |
| 10/3/10 | 6.47 |
| 10/3/10 | 6.56 |
| 10/3/10 | 6.83 |
| 10/3/10 | 6.95 |
| 10/3/10 | 7.06 |
| 10/3/10 | 7.26 |
| 10/3/10 | 7.04 |
| 10/3/10 | 6.91 |
| 10/3/10 | 6.69 |
| 10/3/10 | 6.64 |
| 10/3/10 | 6.52 |
| 10/3/10 | 6.8 |
| 10/3/10 | 6.77 |
| 10/3/10 | 6.94 |
| 10/3/10 | 6.79 |
| 10/3/10 | 6.64 |
| 10/3/10 | 6.52 |
| 10/3/10 | 6.56 |
| 10/3/10 | 6.19 |
| 10/3/10 | 6.41 |
| 10/3/10 | 6.46 |
| 10/3/10 | 6.24 |
| 10/3/10 | 6.14 |
| 10/3/10 | 6.67 |
| 10/3/10 | 6.45 |
| 10/3/10 | 6.13 |
| 10/3/10 | 6.1 |
| 10/3/10 | 6.24 |
| 10/3/10 | 6.34 |
| 10/3/10 | 6.24 |
| 10/3/10 | 6.63 |
| 10/3/10 | 6.44 |
| 10/3/10 | 6.43 |
| 10/3/10 | 6.56 |
| 10/3/10 | 6.34 |
| 10/3/10 | 6.43 |
| 10/3/10 | 6.37 |
| 10/3/10 | 6.28 |
| 10/3/10 | 6.39 |
| 10/3/10 | 6.23 |
| 10/3/10 | 5.9 |
| 10/3/10 | 6.09 |
| 10/3/10 | 6.06 |
| 10/3/10 | 6.23 |
| 10/3/10 | 6.23 |
| 10/3/10 | 6.23 |
| 10/3/10 | 6.34 |
| 10/4/10 | 6.26 |
| 10/4/10 | 6.15 |
| 10/4/10 | 6.14 |
| 10/4/10 | 6.23 |
| 10/4/10 | 6.18 |
| 10/4/10 | 5.88 |
| 10/4/10 | 6.22 |
| 10/4/10 | 5.88 |
| 10/4/10 | 6.15 |
| 10/4/10 | 6.06 |
| 10/4/10 | 5.97 |
| 10/4/10 | 6.02 |
| 10/4/10 | 6 |
| 10/4/10 | 6.34 |
| 10/4/10 | 6.17 |
| 10/4/10 | 6.13 |
| 10/4/10 | 6.17 |
| 10/4/10 | 6.09 |
| 10/4/10 | 6.05 |
| 10/4/10 | 6.01 |
| 10/4/10 | 6.01 |
| 10/4/10 | 6.13 |
| 10/4/10 | 6.22 |
| 10/4/10 | 5.72 |
| 10/4/10 | 5.95 |
| 10/4/10 | 6.23 |
| 10/4/10 | 6.5 |
| 10/4/10 | 6.5 |
| 10/4/10 | 6.54 |
| 10/4/10 | 6.19 |
| 10/4/10 | 5.78 |
| 10/4/10 | 6.21 |
| 10/4/10 | 6.2 |
| 10/4/10 | 6.46 |
| 10/4/10 | 6.4 |
| 10/4/10 | 6.47 |
| 10/4/10 | 6.45 |
| 10/4/10 | 5.9 |
| 10/4/10 | 5.89 |
| 10/4/10 | 6.09 |
| 10/4/10 | 6.08 |
| 10/4/10 | 6 |
| 10/4/10 | 6.14 |
| 10/4/10 | 6.08 |
| 10/4/10 | 6.01 |
| 10/4/10 | 6.07 |
| 10/4/10 | 5.68 |
| 10/4/10 | 6.05 |
| 10/5/10 | 6.18 |
| 10/5/10 | 6.08 |
| 10/5/10 | 6 |
| 10/5/10 | 5.78 |
| 10/5/10 | 5.76 |
| 10/5/10 | 5.47 |
| 10/5/10 | 5.84 |
| 10/5/10 | 5.91 |
| 10/5/10 | 5.64 |
| 10/5/10 | 5.88 |
| 10/5/10 | 6 |
| 10/5/10 | 5.96 |
| 10/5/10 | 5.88 |
| 10/5/10 | 5.84 |
| 10/5/10 | 6.02 |
| 10/5/10 | 6.23 |
| 10/5/10 | 6.05 |
| 10/5/10 | 5.8 |
| 10/5/10 | 5.85 |
| 10/5/10 | 6.15 |
| 10/5/10 | 6.25 |
| 10/5/10 | 6.08 |
| 10/5/10 | 6 |
| 10/5/10 | 6.07 |
| 10/5/10 | 6.4 |
| 10/5/10 | 6.33 |
| 10/5/10 | 6.16 |
| 10/5/10 | 6.15 |
| 10/5/10 | 6.23 |
| 10/5/10 | 6.5 |
| 10/5/10 | 6.29 |
| 10/5/10 | 6.36 |
| 10/5/10 | 6.8 |
| 10/5/10 | 6.6 |
| 10/5/10 | 6.61 |
| 10/5/10 | 6.5 |
| 10/5/10 | 6.3 |
| 10/5/10 | 6.13 |
| 10/5/10 | 6.35 |
| 10/5/10 | 6.3 |
| 10/5/10 | 6.45 |
| 10/5/10 | 6.41 |
| 10/5/10 | 6.45 |
| 10/5/10 | 6.33 |
| 10/5/10 | 6.41 |
| 10/5/10 | 6.36 |
| 10/5/10 | 6.03 |
| 10/5/10 | 6.36 |
| 10/6/10 | 6.35 |
| 10/6/10 | 5.91 |
| 10/6/10 | 5.75 |
| 10/6/10 | 5.81 |
| 10/6/10 | 6 |
| 10/6/10 | 5.81 |
| 10/6/10 | 5.92 |
| 10/6/10 | 5.83 |
| 10/6/10 | 5.92 |
| 10/6/10 | 5.96 |
| 10/6/10 | 6.03 |
| 10/6/10 | 5.69 |
| 10/6/10 | 6 |
| 10/6/10 | 6.06 |
| 10/6/10 | 6.13 |
| 10/6/10 | 6.17 |
| 10/6/10 | 6.28 |
| 10/6/10 | 6.07 |
| 10/6/10 | 5.94 |
| 10/6/10 | 6.32 |
| 10/6/10 | 6.47 |
| 10/6/10 | 6.37 |
| 10/6/10 | 6.35 |
| 10/6/10 | 6.39 |
| 10/6/10 | 6.27 |
| 10/6/10 | 5.92 |
| 10/6/10 | 6.24 |
| 10/6/10 | 6.34 |
| 10/6/10 | 6.43 |
| 10/6/10 | 6.6 |
| 10/6/10 | 6.64 |
| 10/6/10 | 6.58 |
| 10/6/10 | 6.64 |
| 10/6/10 | 6.65 |
| 10/6/10 | 6.56 |
| 10/6/10 | 6.4 |
| 10/6/10 | 6.45 |
| 10/6/10 | 6.31 |
| 10/6/10 | 6.43 |
| 10/6/10 | 6.32 |
| 10/6/10 | 6.26 |
| 10/6/10 | 6.33 |
| 10/6/10 | 6.02 |
| 10/6/10 | 5.77 |
| 10/6/10 | 5.77 |
| 10/6/10 | 6.24 |
| 10/6/10 | 6.12 |
| 10/6/10 | 5.77 |
| 10/7/10 | 5.88 |
| 10/7/10 | 6.24 |
| 10/7/10 | 6.14 |
| 10/7/10 | 6.1 |
| 10/7/10 | 5.9 |
| 10/7/10 | 6.04 |
| 10/7/10 | 5.82 |
| 10/7/10 | 5.57 |
| 10/7/10 | 5.53 |
| 10/7/10 | 5.79 |
| 10/7/10 | 5.88 |
| 10/7/10 | 5.91 |
| 10/7/10 | 5.27 |
| 10/7/10 | 6.11 |
| 10/7/10 | 6.41 |
| 10/7/10 | 5.88 |
| 10/7/10 | 5.8 |
| 10/7/10 | 5.93 |
| 10/7/10 | 6.05 |
| 10/7/10 | 6.38 |
| 10/7/10 | 6.65 |
| 10/7/10 | 6.55 |
| 10/7/10 | 6.04 |
| 10/7/10 | 6.16 |
| 10/7/10 | 6.42 |
| 10/7/10 | 6.71 |
| 10/7/10 | 6.79 |
| 10/7/10 | 6.97 |
| 10/7/10 | 7.1 |
| 10/7/10 | 7.16 |
| 10/7/10 | 7.25 |
| 10/7/10 | 7.06 |
| 10/7/10 | 7.08 |
| 10/7/10 | 7.22 |
| 10/7/10 | 7.33 |
| 10/7/10 | 7.28 |
| 10/7/10 | 7.23 |
| 10/7/10 | 7.18 |
| 10/7/10 | 7.28 |
| 10/7/10 | 7.4 |
| 10/7/10 | 7.48 |
| 10/7/10 | 7.55 |
| 10/7/10 | 7.48 |
| 10/7/10 | 7.43 |
| 10/7/10 | 7.43 |
| 10/7/10 | 7.35 |
| 10/7/10 | 7.2 |
| 10/7/10 | 7.21 |
| 10/8/10 | 7.14 |
| 10/8/10 | 7.31 |
| 10/8/10 | 7.2 |
| 10/8/10 | 7.16 |
| 10/8/10 | 7.11 |
| 10/8/10 | 7.09 |
| 10/8/10 | 6.96 |
| 10/8/10 | 6.72 |
| 10/8/10 | 6.71 |
| 10/8/10 | 6.96 |
| 10/8/10 | 6.88 |
| 10/8/10 | 6.92 |
| 10/8/10 | 6.78 |
| 10/8/10 | 6.68 |
| 10/8/10 | 6.99 |
| 10/8/10 | 6.83 |
| 10/8/10 | 6.79 |
| 10/8/10 | 6.93 |
| 10/8/10 | 6.81 |
| 10/8/10 | 6.81 |
| 10/8/10 | 6.59 |
| 10/8/10 | 6.66 |
| 10/8/10 | 6.74 |
| 10/8/10 | 7.29 |
| 10/8/10 | 7.38 |
| 10/8/10 | 7.45 |
| 10/8/10 | 7.61 |
| 10/8/10 | 7.55 |
| 10/8/10 | 7.46 |
| 10/8/10 | 7.68 |
| 10/8/10 | 7.9 |
| 10/8/10 | 7.83 |
| 10/8/10 | 7.85 |
| 10/8/10 | 7.76 |
| 10/8/10 | 7.85 |
| 10/8/10 | 7.75 |
| 10/8/10 | 7.66 |
| 10/8/10 | 7.96 |
| 10/8/10 | 7.7 |
| 10/8/10 | 7.8 |
| 10/8/10 | 7.74 |
| 10/8/10 | 7.73 |
| 10/8/10 | 7.83 |
| 10/8/10 | 7.81 |
| 10/8/10 | 7.74 |
| 10/8/10 | 7.78 |
| 10/8/10 | 7.81 |
| 10/8/10 | 7.56 |
| 10/9/10 | 7.71 |
| 10/9/10 | 7.87 |
| 10/9/10 | 7.72 |
| 10/9/10 | 7.68 |
| 10/9/10 | 7.38 |
| 10/9/10 | 7.53 |
| 10/9/10 | 7.47 |
| 10/9/10 | 7.53 |
| 10/9/10 | 7.32 |
| 10/9/10 | 7.48 |
| 10/9/10 | 7.27 |
| 10/9/10 | 7.21 |
| 10/9/10 | 7.28 |
| 10/9/10 | 7.2 |
| 10/9/10 | 7.08 |
| 10/9/10 | 7.05 |
| 10/9/10 | 6.93 |
| 10/9/10 | 7 |
| 10/9/10 | 6.82 |
| 10/9/10 | 6.98 |
| 10/9/10 | 6.96 |
| 10/9/10 | 6.7 |
| 10/9/10 | 7.06 |
| 10/9/10 | 7.09 |
| 10/9/10 | 7.61 |
| 10/9/10 | 7.77 |
| 10/9/10 | 7.72 |
| 10/9/10 | 7.65 |
| 10/9/10 | 7.86 |
| 10/9/10 | 7.75 |
| 10/9/10 | 8.1 |
| 10/9/10 | 7.99 |
| 10/9/10 | 8.18 |
| 10/9/10 | 8.24 |
| 10/9/10 | 7.97 |
| 10/9/10 | 8.18 |
| 10/9/10 | 7.53 |
| 10/9/10 | 7.87 |
| 10/9/10 | 8.04 |
| 10/9/10 | 7.81 |
| 10/9/10 | 7.11 |
| 10/9/10 | 7.97 |
| 10/9/10 | 8.11 |
| 10/9/10 | 8.35 |
| 10/9/10 | 8.05 |
| 10/9/10 | 7.84 |
| 10/9/10 | 7.73 |
| 10/9/10 | 7.55 |
| 10/10/10 | 7.62 |
| 10/10/10 | 7.66 |
| 10/10/10 | 7.17 |
| 10/10/10 | 7.34 |
| 10/10/10 | 7.64 |
| 10/10/10 | 7.56 |
| 10/10/10 | 7.65 |
| 10/10/10 | 7.65 |
| 10/10/10 | 7.65 |
| 10/10/10 | 7.41 |
| 10/10/10 | 7.61 |
| 10/10/10 | 7.95 |
| 10/10/10 | 7.91 |
| 10/10/10 | 8.03 |
| 10/10/10 | 7.88 |
| 10/10/10 | 7.87 |
| 10/10/10 | 7.89 |
| 10/10/10 | 7.87 |
| 10/10/10 | 7.64 |
| 10/10/10 | 7.66 |
| 10/10/10 | 7.62 |
| 10/10/10 | 7.91 |
| 10/10/10 | 8.1 |
| 10/10/10 | 8.19 |
| 10/10/10 | 8.18 |
| 10/10/10 | 7.92 |
| 10/10/10 | 8.21 |
| 10/10/10 | 8.07 |
| 10/10/10 | 8.14 |
| 10/10/10 | 8.32 |
| 10/10/10 | 8.34 |
| 10/10/10 | 8.46 |
| 10/10/10 | 8.41 |
| 10/10/10 | 8.4 |
| 10/10/10 | 8.04 |
| 10/10/10 | 8.6 |
| 10/10/10 | 8.34 |
| 10/10/10 | 8.05 |
| 10/10/10 | 7.99 |
| 10/10/10 | 8.28 |
| 10/10/10 | 7.94 |
| 10/10/10 | 7.92 |
| 10/10/10 | 7.72 |
| 10/10/10 | 8.09 |
| 10/10/10 | 7.92 |
| 10/10/10 | 7.9 |
| 10/10/10 | 8.01 |
| 10/10/10 | 7.98 |
| 10/11/10 | 7.8 |
| 10/11/10 | 7.71 |
| 10/11/10 | 7.85 |
| 10/11/10 | 7.76 |
| 10/11/10 | 7.67 |
| 10/11/10 | 7.26 |
| 10/11/10 | 7.4 |
| 10/11/10 | 7.66 |
| 10/11/10 | 7.59 |
| 10/11/10 | 7.51 |
| 10/11/10 | 7.48 |
| 10/11/10 | 7.64 |
| 10/11/10 | 7.6 |
| 10/11/10 | 7.72 |
| 10/11/10 | 7.55 |
| 10/11/10 | 7.31 |
| 10/11/10 | 7.22 |
| 10/11/10 | 6.92 |
| 10/11/10 | 7.2 |
| 10/11/10 | 8 |
| 10/11/10 | 7.5 |
| 10/11/10 | 7.45 |
| 10/11/10 | 7.73 |
| 10/11/10 | 7.7 |
| 10/11/10 | 7.69 |
| 10/11/10 | 7.88 |
| 10/11/10 | 7.85 |
| 10/11/10 | 7.89 |
| 10/11/10 | 8.17 |
| 10/11/10 | 8.12 |
| 10/11/10 | 8.16 |
| 10/11/10 | 8.16 |
| 10/11/10 | 8.22 |
| 10/11/10 | 8.3 |
| 10/11/10 | 8.29 |
| 10/11/10 | 7.88 |
| 10/11/10 | 8.4 |
| 10/11/10 | 7.71 |
| 10/11/10 | 8.09 |
| 10/11/10 | 8.1 |
| 10/11/10 | 8.08 |
| 10/11/10 | 8.29 |
| 10/11/10 | 7.82 |
| 10/11/10 | 7.48 |
| 10/11/10 | 7.77 |
| 10/11/10 | 7.85 |
| 10/11/10 | 7.88 |
| 10/11/10 | 7.7 |
| 10/12/10 | 7.43 |
| 10/12/10 | 7.38 |
| 10/12/10 | 7.23 |
| 10/12/10 | 7.51 |
| 10/12/10 | 7.52 |
| 10/12/10 | 7.41 |
| 10/12/10 | 7.4 |
| 10/12/10 | 7.46 |
| 10/12/10 | 7.33 |
| 10/12/10 | 7.43 |
| 10/12/10 | 7.09 |
| 10/12/10 | 7.67 |
| 10/12/10 | 7.43 |
| 10/12/10 | 7.38 |
| 10/12/10 | 7.21 |
| 10/12/10 | 7.23 |
| 10/12/10 | 7.21 |
| 10/12/10 | 7.39 |
| 10/12/10 | 7.33 |
| 10/12/10 | 7.56 |
| 10/12/10 | 7.67 |
| 10/12/10 | 7.71 |
| 10/12/10 | 7.76 |
| 10/12/10 | 7.86 |
| 10/12/10 | 7.77 |
| 10/12/10 | 7.94 |
| 10/12/10 | 8.03 |
| 10/12/10 | 7.9 |
| 10/12/10 | 8.32 |
| 10/12/10 | 7.62 |
| 10/12/10 | 7.99 |
| 10/12/10 | 8.11 |
| 10/12/10 | 8.11 |
| 10/12/10 | 7.97 |
| 10/12/10 | 7.99 |
| 10/12/10 | 8.04 |
| 10/12/10 | 7.94 |
| 10/12/10 | 7.99 |
| 10/12/10 | 7.98 |
| 10/12/10 | 7.87 |
| 10/12/10 | 7.72 |
| 10/12/10 | 7.66 |
| 10/12/10 | 7.83 |
| 10/12/10 | 7.82 |
| 10/12/10 | 7.82 |
| 10/12/10 | 7.82 |
| 10/12/10 | 7.73 |
| 10/12/10 | 7.59 |
| 10/13/10 | 7.78 |
| 10/13/10 | 7.63 |
| 10/13/10 | 7.43 |
| 10/13/10 | 7.46 |
| 10/13/10 | 7.63 |
| 10/13/10 | 7.03 |
| 10/13/10 | 7.28 |
| 10/13/10 | 7.38 |
| 10/13/10 | 7.32 |
| 10/13/10 | 7.29 |
| 10/13/10 | 7.34 |
| 10/13/10 | 7.2 |
| 10/13/10 | 7.02 |
| 10/13/10 | 7.25 |
| 10/13/10 | 7.22 |
| 10/13/10 | 7.2 |
| 10/13/10 | 7.23 |
| 10/13/10 | 7.18 |
| 10/13/10 | 7.11 |
| 10/13/10 | 7.21 |
| 10/13/10 | 7.3 |
| 10/13/10 | 7.34 |
| 10/13/10 | 7.31 |
| 10/13/10 | 7.43 |
| 10/13/10 | 7.3 |
| 10/13/10 | 6.9 |
| 10/13/10 | 7.48 |
| 10/13/10 | 7.65 |
| 10/13/10 | 7.72 |
| 10/13/10 | 7.71 |
| 10/13/10 | 7.61 |
| 10/13/10 | 7.94 |
| 10/13/10 | 7.71 |
| 10/13/10 | 7.39 |
| 10/13/10 | 7.57 |
| 10/13/10 | 7.65 |
| 10/13/10 | 7.53 |
| 10/13/10 | 7.61 |
| 10/13/10 | 7.56 |
| 10/13/10 | 7.63 |
| 10/13/10 | 7.73 |
| 10/13/10 | 7.61 |
| 10/13/10 | 7.43 |
| 10/13/10 | 7.46 |
| 10/13/10 | 7.59 |
| 10/13/10 | 7.7 |
| 10/13/10 | 7.23 |
| 10/13/10 | 7.05 |
| 10/14/10 | 7.2 |
| 10/14/10 | 7.07 |
| 10/14/10 | 7.67 |
| 10/14/10 | 7.6 |
| 10/14/10 | 7.44 |
| 10/14/10 | 7.1 |
| 10/14/10 | 7.59 |
| 10/14/10 | 7.44 |
| 10/14/10 | 7.06 |
| 10/14/10 | 6.99 |
| 10/14/10 | 7.16 |
| 10/14/10 | 7.28 |
| 10/14/10 | 7.3 |
| 10/14/10 | 7.22 |
| 10/14/10 | 6.95 |
| 10/14/10 | 7.11 |
| 10/14/10 | 7.04 |
| 10/14/10 | 6.98 |
| 10/14/10 | 6.8 |
| 10/14/10 | 7.04 |
| 10/14/10 | 6.67 |
| 10/14/10 | 6.9 |
| 10/14/10 | 6.83 |
| 10/14/10 | 7.08 |
| 10/14/10 | 7.14 |
| 10/14/10 | 7.24 |
| 10/14/10 | 7.24 |
| 10/14/10 | 7.39 |
| 10/14/10 | 7.41 |
| 10/14/10 | 7.41 |
| 10/14/10 | 7.45 |
| 10/14/10 | 7.58 |
| 10/14/10 | 7.58 |
| 10/14/10 | 7.68 |
| 10/14/10 | 7.73 |
| 10/14/10 | 7.67 |
| 10/14/10 | 7.56 |
| 10/14/10 | 7.48 |
| 10/14/10 | 7.4 |
| 10/14/10 | 6.93 |
| 10/14/10 | 7.2 |
| 10/14/10 | 6.83 |
| 10/14/10 | 7.3 |
| 10/14/10 | 7.34 |
| 10/14/10 | 7.38 |
| 10/14/10 | 6.76 |
| 10/14/10 | 7.12 |
| 10/14/10 | 7.11 |
| 10/15/10 | 6.77 |
| 10/15/10 | 7.22 |
| 10/15/10 | 6.97 |
| 10/15/10 | 7.12 |
| 10/15/10 | 7.07 |
| 10/15/10 | 6.81 |
| 10/15/10 | 6.95 |
| 10/15/10 | 6.86 |
| 10/15/10 | 6.85 |
| 10/15/10 | 6.71 |
| 10/15/10 | 6.61 |
| 10/15/10 | 6.7 |
| 10/15/10 | 6.83 |
| 10/15/10 | 6.68 |
| 10/15/10 | 6.41 |
| 10/15/10 | 6.74 |
| 10/15/10 | 6.6 |
| 10/15/10 | 6.77 |
| 10/15/10 | 6.66 |
| 10/15/10 | 6.71 |
| 10/15/10 | 6.75 |
| 10/15/10 | 6.87 |
| 10/15/10 | 7.01 |
| 10/15/10 | 6.99 |
| 10/15/10 | 6.91 |
| 10/15/10 | 7.13 |
| 10/15/10 | 7.29 |
| 10/15/10 | 7.38 |
| 10/15/10 | 7.41 |
| 10/15/10 | 7.5 |
| 10/15/10 | 7.6 |
| 10/15/10 | 7.71 |
| 10/15/10 | 7.7 |
| 10/15/10 | 7.65 |
| 10/15/10 | 7.81 |
| 10/15/10 | 7.86 |
| 10/15/10 | 7.78 |
| 10/15/10 | 7.72 |
| 10/15/10 | 7.73 |
| 10/15/10 | 7.64 |
| 10/15/10 | 7.72 |
| 10/15/10 | 7.73 |
| 10/15/10 | 7.43 |
| 10/15/10 | 7.55 |
| 10/15/10 | 7.41 |
| 10/15/10 | 7.28 |
| 10/15/10 | 7.21 |
| 10/15/10 | 7.31 |
| 10/16/10 | 7.28 |
| 10/16/10 | 7.17 |
| 10/16/10 | 7.19 |
| 10/16/10 | 7.09 |
| 10/16/10 | 7.17 |
| 10/16/10 | 7.17 |
| 10/16/10 | 6.99 |
| 10/16/10 | 6.99 |
| 10/16/10 | 6.94 |
| 10/16/10 | 6.74 |
| 10/16/10 | 6.7 |
| 10/16/10 | 6.73 |
| 10/16/10 | 6.69 |
| 10/16/10 | 6.75 |
| 10/16/10 | 6.86 |
| 10/16/10 | 6.89 |
| 10/16/10 | 6.95 |
| 10/16/10 | 6.9 |
| 10/16/10 | 7.03 |
| 10/16/10 | 7.11 |
| 10/16/10 | 7.17 |
| 10/16/10 | 7.27 |
| 10/16/10 | 7.47 |
| 10/16/10 | 7.28 |
| 10/16/10 | 7.47 |
| 10/16/10 | 7.7 |
| 10/16/10 | 7.66 |
| 10/16/10 | 7.76 |
| 10/16/10 | 7.89 |
| 10/16/10 | 7.8 |
| 10/16/10 | 7.82 |
| 10/16/10 | 8.06 |
| 10/16/10 | 7.85 |
| 10/16/10 | 7.88 |
| 10/16/10 | 8 |
| 10/16/10 | 8.01 |
| 10/16/10 | 7.95 |
| 10/16/10 | 8.03 |
| 10/16/10 | 8.03 |
| 10/16/10 | 8.04 |
| 10/16/10 | 8.08 |
| 10/16/10 | 8.05 |
| 10/16/10 | 7.77 |
| 10/16/10 | 7.49 |
| 10/16/10 | 7.63 |
| 10/16/10 | 7.67 |
| 10/16/10 | 7.58 |
| 10/16/10 | 7.45 |
| 10/17/10 | 7.28 |
| 10/17/10 | 7.44 |
| 10/17/10 | 7.35 |
| 10/17/10 | 7.39 |
| 10/17/10 | 7.21 |
| 10/17/10 | 7.3 |
| 10/17/10 | 7.19 |
| 10/17/10 | 6.92 |
| 10/17/10 | 7.2 |
| 10/17/10 | 7.27 |
| 10/17/10 | 7.29 |
| 10/17/10 | 7.37 |
| 10/17/10 | 7.35 |
| 10/17/10 | 7.29 |
| 10/17/10 | 7.38 |
| 10/17/10 | 7.49 |
| 10/17/10 | 7.37 |
| 10/17/10 | 7.37 |
| 10/17/10 | 7.39 |
| 10/17/10 | 7.34 |
| 10/17/10 | 7.69 |
| 10/17/10 | 7.76 |
| 10/17/10 | 7.81 |
| 10/17/10 | 7.8 |
| 10/17/10 | 7.71 |
| 10/17/10 | 7.9 |
| 10/17/10 | 7.96 |
| 10/17/10 | 8.06 |
| 10/17/10 | 8.02 |
| 10/17/10 | 8.11 |
| 10/17/10 | 7.97 |
| 10/17/10 | 8.05 |
| 10/17/10 | 8.14 |
| 10/17/10 | 8.15 |
| 10/17/10 | 8.16 |
| 10/17/10 | 8.3 |
| 10/17/10 | 8.08 |
| 10/17/10 | 7.95 |
| 10/17/10 | 8.26 |
| 10/17/10 | 8.3 |
| 10/17/10 | 8.15 |
| 10/17/10 | 8.25 |
| 10/17/10 | 8.26 |
| 10/17/10 | 8.15 |
| 10/17/10 | 8.12 |
| 10/17/10 | 8.09 |
| 10/17/10 | 8.04 |
| 10/17/10 | 7.87 |
| 10/18/10 | 7.89 |
| 10/18/10 | 7.96 |
| 10/18/10 | 7.84 |
| 10/18/10 | 7.8 |
| 10/18/10 | 7.69 |
| 10/18/10 | 7.72 |
| 10/18/10 | 7.67 |
| 10/18/10 | 7.67 |
| 10/18/10 | 7.54 |
| 10/18/10 | 7.7 |
| 10/18/10 | 7.63 |
| 10/18/10 | 7.66 |
| 10/18/10 | 7.55 |
| 10/18/10 | 7.53 |
| 10/18/10 | 7.54 |
| 10/18/10 | 7.55 |
| 10/18/10 | 7.55 |
| 10/18/10 | 7.7 |
| 10/18/10 | 7.51 |
| 10/18/10 | 7.39 |
| 10/18/10 | 7.38 |
| 10/18/10 | 7.33 |
| 10/18/10 | 7.11 |
| 10/18/10 | 7.41 |
| 10/18/10 | 7.58 |
| 10/18/10 | 7.41 |
| 10/18/10 | 7.44 |
| 10/18/10 | 7.73 |
| 10/18/10 | 7.98 |
| 10/18/10 | 7.83 |
| 10/18/10 | 7.74 |
| 10/18/10 | 7.83 |
| 10/18/10 | 7.75 |
| 10/18/10 | 7.97 |
| 10/18/10 | 7.8 |
| 10/18/10 | 8.08 |
| 10/18/10 | 7.71 |
| 10/18/10 | 7.78 |
| 10/18/10 | 7.66 |
| 10/18/10 | 7.19 |
| 10/18/10 | 7.11 |
| 10/18/10 | 7.24 |
| 10/18/10 | 7.44 |
| 10/18/10 | 7.3 |
| 10/18/10 | 7.12 |
| 10/18/10 | 7.06 |
| 10/18/10 | 7.07 |
| 10/18/10 | 7.06 |
| 10/19/10 | 7.53 |
| 10/19/10 | 7.27 |
| 10/19/10 | 7.21 |
| 10/19/10 | 7.24 |
| 10/19/10 | 7.31 |
| 10/19/10 | 7.13 |
| 10/19/10 | 7.21 |
| 10/19/10 | 6.92 |
| 10/19/10 | 7.15 |
| 10/19/10 | 7.03 |
| 10/19/10 | 7.04 |
| 10/19/10 | 7.4 |
| 10/19/10 | 7.29 |
| 10/19/10 | 7.43 |
| 10/19/10 | 7.43 |
| 10/19/10 | 7.38 |
| 10/19/10 | 7.27 |
| 10/19/10 | 7.26 |
| 10/19/10 | 7.31 |
| 10/19/10 | 7.31 |
| 10/19/10 | 7.53 |
| 10/19/10 | 7.43 |
| 10/19/10 | 7.54 |
| 10/19/10 | 7.51 |
| 10/19/10 | 7.43 |
| 10/19/10 | 7.35 |
| 10/19/10 | 7.59 |
| 10/19/10 | 7.58 |
| 10/19/10 | 7.74 |
| 10/19/10 | 7.53 |
| 10/19/10 | 7.54 |
| 10/19/10 | 7.67 |
| 10/19/10 | 7.78 |
| 10/19/10 | 7.97 |
| 10/19/10 | 7.87 |
| 10/19/10 | 7.81 |
| 10/19/10 | 7.71 |
| 10/19/10 | 7.92 |
| 10/19/10 | 7.24 |
| 10/19/10 | 7.59 |
| 10/19/10 | 7.71 |
| 10/19/10 | 7.78 |
| 10/19/10 | 7.78 |
| 10/19/10 | 7.62 |
| 10/19/10 | 7.82 |
| 10/19/10 | 7.79 |
| 10/19/10 | 7.76 |
| 10/19/10 | 7.79 |
| 10/20/10 | 7.72 |
| 10/20/10 | 7.66 |
| 10/20/10 | 7.69 |
| 10/20/10 | 7.69 |
| 10/20/10 | 7.77 |
| 10/20/10 | 7.68 |
| 10/20/10 | 7.79 |
| 10/20/10 | 7.75 |
| 10/20/10 | 7.59 |
| 10/20/10 | 7.72 |
| 10/20/10 | 7.56 |
| 10/20/10 | 7.63 |
| 10/20/10 | 7.63 |
| 10/20/10 | 7.53 |
| 10/20/10 | 7.55 |
| 10/20/10 | 7.73 |
| 10/20/10 | 7.59 |
| 10/20/10 | 7.44 |
| 10/20/10 | 7.56 |
| 10/20/10 | 7.49 |
| 10/20/10 | 7.56 |
| 10/20/10 | 7.51 |
| 10/20/10 | 7.53 |
| 10/20/10 | 7.87 |
| 10/20/10 | 7.86 |
| 10/20/10 | 7.97 |
| 10/20/10 | 8.19 |
| 10/20/10 | 8.18 |
| 10/20/10 | 8.2 |
| 10/20/10 | 7.92 |
| 10/20/10 | 7.95 |
| 10/20/10 | 8.11 |
| 10/20/10 | 8.2 |
| 10/20/10 | 8.17 |
| 10/20/10 | 8.24 |
| 10/20/10 | 8.2 |
| 10/20/10 | 8.3 |
| 10/20/10 | 8.17 |
| 10/20/10 | 7.96 |
| 10/20/10 | 8.23 |
| 10/20/10 | 8.35 |
| 10/20/10 | 8.18 |
| 10/20/10 | 7.5 |
| 10/20/10 | 6.99 |
| 10/20/10 | 7.18 |
| 10/20/10 | 7.45 |
| 10/20/10 | 7.6 |
| 10/20/10 | 7.58 |
| 10/21/10 | 7.8 |
| 10/21/10 | 7.7 |
| 10/21/10 | 7.75 |
| 10/21/10 | 8.03 |
| 10/21/10 | 7.98 |
| 10/21/10 | 8.16 |
| 10/21/10 | 8.08 |
| 10/21/10 | 7.98 |
| 10/21/10 | 8.1 |
| 10/21/10 | 8.06 |
| 10/21/10 | 8.26 |
| 10/21/10 | 8.01 |
| 10/21/10 | 7.84 |
| 10/21/10 | 8.16 |
| 10/21/10 | 7.84 |
| 10/21/10 | 7.67 |
| 10/21/10 | 7.6 |
| 10/21/10 | 7.59 |
| 10/21/10 | 7.9 |
| 10/21/10 | 8.04 |
| 10/21/10 | 8.23 |
| 10/21/10 | 8.18 |
| 10/21/10 | 8.26 |
| 10/21/10 | 8.4 |
| 10/21/10 | 8.42 |
| 10/21/10 | 8.35 |
| 10/21/10 | 8.42 |
| 10/21/10 | 8.5 |
| 10/21/10 | 8.55 |
| 10/21/10 | 8.48 |
| 10/21/10 | 8.38 |
| 10/21/10 | 8.6 |
| 10/21/10 | 8.51 |
| 10/21/10 | 8.38 |
| 10/21/10 | 8.55 |
| 10/21/10 | 8.63 |
| 10/21/10 | 8.5 |
| 10/21/10 | 8.49 |
| 10/21/10 | 8.6 |
| 10/21/10 | 8.61 |
| 10/21/10 | 8.59 |
| 10/21/10 | 8.41 |
| 10/21/10 | 8.41 |
| 10/21/10 | 8.39 |
| 10/21/10 | 8.02 |
| 10/21/10 | 8.07 |
| 10/21/10 | 8.04 |
| 10/21/10 | 8.27 |
| 10/22/10 | 8.23 |
| 10/22/10 | 8.43 |
| 10/22/10 | 8.32 |
| 10/22/10 | 8.18 |
| 10/22/10 | 8.25 |
| 10/22/10 | 8.21 |
| 10/22/10 | 8 |
| 10/22/10 | 8.17 |
| 10/22/10 | 8.2 |
| 10/22/10 | 7.96 |
| 10/22/10 | 7.97 |
| 10/22/10 | 7.93 |
| 10/22/10 | 7.89 |
| 10/22/10 | 7.75 |
| 10/22/10 | 7.77 |
| 10/22/10 | 7.94 |
| 10/22/10 | 7.93 |
| 10/22/10 | 8.11 |
| 10/22/10 | 8.24 |
| 10/22/10 | 8.16 |
| 10/22/10 | 8.23 |
| 10/22/10 | 8.23 |
| 10/22/10 | 8.41 |
| 10/22/10 | 8.46 |
| 10/22/10 | 8.39 |
| 10/22/10 | 8.51 |
| 10/22/10 | 8.64 |
| 10/22/10 | 8.51 |
| 10/22/10 | 8.61 |
| 10/22/10 | 8.68 |
| 10/22/10 | 8.53 |
| 10/22/10 | 8.69 |
| 10/22/10 | 8.69 |
| 10/22/10 | 8.68 |
| 10/22/10 | 8.76 |
| 10/22/10 | 8.73 |
| 10/22/10 | 8.61 |
| 10/22/10 | 8.55 |
| 10/22/10 | 8.64 |
| 10/22/10 | 8.65 |
| 10/22/10 | 8.46 |
| 10/22/10 | 8.42 |
| 10/22/10 | 8.12 |
| 10/22/10 | 8.42 |
| 10/22/10 | 8.37 |
| 10/22/10 | 8.17 |
| 10/22/10 | 8.35 |
| 10/22/10 | 8.27 |
| 10/23/10 | 8.15 |
| 10/23/10 | 8.05 |
| 10/23/10 | 8.2 |
| 10/23/10 | 8.24 |
| 10/23/10 | 8.18 |
| 10/23/10 | 8.27 |
| 10/23/10 | 8.17 |
| 10/23/10 | 8.18 |
| 10/23/10 | 8.11 |
| 10/23/10 | 8.28 |
| 10/23/10 | 8.05 |
| 10/23/10 | 8.14 |
| 10/23/10 | 8.13 |
| 10/23/10 | 8.03 |
| 10/23/10 | 8.08 |
| 10/23/10 | 8.09 |
| 10/23/10 | 8.14 |
| 10/23/10 | 7.92 |
| 10/23/10 | 7.93 |
| 10/23/10 | 7.96 |
| 10/23/10 | 7.73 |
| 10/23/10 | 7.96 |
| 10/23/10 | 8.4 |
| 10/23/10 | 8.54 |
| 10/23/10 | 8.55 |
| 10/23/10 | 8.49 |
| 10/23/10 | 8.65 |
| 10/23/10 | 8.69 |
| 10/23/10 | 8.72 |
| 10/23/10 | 8.84 |
| 10/23/10 | 8.92 |
| 10/23/10 | 8.9 |
| 10/23/10 | 8.74 |
| 10/23/10 | 8.71 |
| 10/23/10 | 7.94 |
| 10/23/10 | 8.12 |
| 10/23/10 | 8.23 |
| 10/23/10 | 7.45 |
| 10/23/10 | 6.91 |
| 10/23/10 | 7.92 |
| 10/23/10 | 7.8 |
| 10/23/10 | 8.05 |
| 10/23/10 | 7.96 |
| 10/23/10 | 7.66 |
| 10/23/10 | 7.95 |
| 10/23/10 | 8.3 |
| 10/23/10 | 8.39 |
| 10/23/10 | 7.83 |
| 10/24/10 | 8.22 |
| 10/24/10 | 8.18 |
| 10/24/10 | 8.19 |
| 10/24/10 | 8.2 |
| 10/24/10 | 8.21 |
| 10/24/10 | 8.29 |
| 10/24/10 | 8.3 |
| 10/24/10 | 8.29 |
| 10/24/10 | 8.37 |
| 10/24/10 | 8.3 |
| 10/24/10 | 8.48 |
| 10/24/10 | 8.34 |
| 10/24/10 | 8.1 |
| 10/24/10 | 8.1 |
| 10/24/10 | 8.19 |
| 10/24/10 | 8.07 |
| 10/24/10 | 7.96 |
| 10/24/10 | 8.15 |
| 10/24/10 | 8.25 |
| 10/24/10 | 7.9 |
| 10/24/10 | 8.24 |
| 10/24/10 | 8.02 |
| 10/24/10 | 8.67 |
| 10/24/10 | 8.64 |
| 10/24/10 | 8.66 |
| 10/24/10 | 8.68 |
| 10/24/10 | 8.71 |
| 10/24/10 | 8.94 |
| 10/24/10 | 8.88 |
| 10/24/10 | 8.9 |
| 10/24/10 | 9.11 |
| 10/24/10 | 8.9 |
| 10/24/10 | 8.96 |
| 10/24/10 | 9 |
| 10/24/10 | 8.89 |
| 10/24/10 | 8.87 |
| 10/24/10 | 8.46 |
| 10/24/10 | 8.49 |
| 10/24/10 | 8.16 |
| 10/24/10 | 8.61 |
| 10/24/10 | 8.39 |
| 10/24/10 | 8.14 |
| 10/24/10 | 8.44 |
| 10/24/10 | 8.54 |
| 10/24/10 | 8.46 |
| 10/24/10 | 7.9 |
| 10/24/10 | 8.29 |
| 10/24/10 | 8.82 |
| 10/25/10 | 8.83 |
| 10/25/10 | 8.47 |
| 10/25/10 | 7.89 |
| 10/25/10 | 8 |
| 10/25/10 | 7.95 |
| 10/25/10 | 8.49 |
| 10/25/10 | 8.72 |
| 10/25/10 | 8.81 |
| 10/25/10 | 8.77 |
| 10/25/10 | 8.74 |
| 10/25/10 | 8.62 |
| 10/25/10 | 8.64 |
| 10/25/10 | 8.69 |
| 10/25/10 | 8.61 |
| 10/25/10 | 8.58 |
| 10/25/10 | 8.63 |
| 10/25/10 | 8.7 |
| 10/25/10 | 8.56 |
| 10/25/10 | 8.82 |
| 10/25/10 | 8.47 |
| 10/25/10 | 8.31 |
| 10/25/10 | 8.67 |
| 10/25/10 | 8.74 |
| 10/25/10 | 8.79 |
| 10/25/10 | 8.54 |
| 10/25/10 | 8.67 |
| 10/25/10 | 8.59 |
| 10/25/10 | 8.64 |
| 10/25/10 | 8.46 |
| 10/25/10 | 8.41 |
| 10/25/10 | 8.89 |
| 10/25/10 | 8.41 |
| 10/25/10 | 8.07 |
| 10/25/10 | 8.89 |
| 10/25/10 | 8.96 |
| 10/25/10 | 8.6 |
| 10/25/10 | 8.14 |
| 10/25/10 | 8.04 |
| 10/25/10 | 8.61 |
| 10/25/10 | 8.73 |
| 10/25/10 | 8.76 |
| 10/25/10 | 7.62 |
| 10/25/10 | 8.7 |
| 10/25/10 | 8.14 |
| 10/25/10 | 8.26 |
| 10/25/10 | 8.34 |
| 10/25/10 | 8.5 |
| 10/25/10 | 7.53 |
| 10/26/10 | 8.15 |
| 10/26/10 | 8.25 |
| 10/26/10 | 8.13 |
| 10/26/10 | 8.02 |
| 10/26/10 | 7.92 |
| 10/26/10 | 7.89 |
| 10/26/10 | 7.54 |
| 10/26/10 | 7.85 |
| 10/26/10 | 8.26 |
| 10/26/10 | 7.95 |
| 10/26/10 | 7.63 |
| 10/26/10 | 7.7 |
| 10/26/10 | 7.67 |
| 10/26/10 | 7.44 |
| 10/26/10 | 7.5 |
| 10/26/10 | 7.73 |
| 10/26/10 | 8 |
| 10/26/10 | 7.77 |
| 10/26/10 | 8.01 |
| 10/26/10 | 8.11 |
| 10/26/10 | 7.17 |
| 10/26/10 | 7.4 |
| 10/26/10 | 7.21 |
| 10/26/10 | 8.19 |
| 10/26/10 | 8.45 |
| 10/26/10 | 8.5 |
| 10/26/10 | 9.01 |
| 10/26/10 | 8.69 |
| 10/26/10 | 8.58 |
| 10/26/10 | 8.82 |
| 10/26/10 | 9.04 |
| 10/26/10 | 9.11 |
| 10/26/10 | 8.49 |
| 10/26/10 | 8.98 |
| 10/26/10 | 8.95 |
| 10/26/10 | 9.06 |
| 10/26/10 | 9.05 |
| 10/26/10 | 7.9 |
| 10/26/10 | 8.57 |
| 10/26/10 | 8.59 |
| 10/26/10 | 8.64 |
| 10/26/10 | 8.58 |
| 10/26/10 | 8.56 |
| 10/26/10 | 8.6 |
| 10/26/10 | 8.56 |
| 10/26/10 | 8.64 |
| 10/26/10 | 8.52 |
| 10/26/10 | 8.61 |
| 10/27/10 | 8.3 |
| 10/27/10 | 8.5 |
| 10/27/10 | 8.4 |
| 10/27/10 | 8.12 |
| 10/27/10 | 8.08 |
| 10/27/10 | 8.03 |
| 10/27/10 | 7.87 |
| 10/27/10 | 7.67 |
| 10/27/10 | 7.81 |
| 10/27/10 | 7.97 |
| 10/27/10 | 7.66 |
| 10/27/10 | 7.64 |
| 10/27/10 | 7.45 |
| 10/27/10 | 7.86 |
| 10/27/10 | 7.84 |
| 10/27/10 | 8.09 |
| 10/27/10 | 7.67 |
| 10/27/10 | 7.86 |
| 10/27/10 | 7.76 |
| 10/27/10 | 7.41 |
| 10/27/10 | 7.78 |
| 10/27/10 | 8.29 |
| 10/27/10 | 8.5 |
| 10/27/10 | 8.51 |
| 10/27/10 | 8.6 |
| 10/27/10 | 8.59 |
| 10/27/10 | 8.5 |
| 10/27/10 | 8.27 |
| 10/27/10 | 8.15 |
| 10/27/10 | 8.46 |
| 10/27/10 | 8.54 |
| 10/27/10 | 8.57 |
| 10/27/10 | 8.71 |
| 10/27/10 | 8.84 |
| 10/27/10 | 8.72 |
| 10/27/10 | 8.49 |
| 10/27/10 | 8.59 |
| 10/27/10 | 8.48 |
| 10/27/10 | 8.74 |
| 10/27/10 | 8.52 |
| 10/27/10 | 8.58 |
| 10/27/10 | 8.58 |
| 10/27/10 | 8.64 |
| 10/27/10 | 8.68 |
| 10/27/10 | 8.59 |
| 10/27/10 | 8.64 |
| 10/27/10 | 8.7 |
| 10/27/10 | 8.79 |
| 10/28/10 | 8.6 |
| 10/28/10 | 8.81 |
| 10/28/10 | 8.72 |
| 10/28/10 | 8.6 |
| 10/28/10 | 8.51 |
| 10/28/10 | 8.33 |
| 10/28/10 | 8.05 |
| 10/28/10 | 7.99 |
| 10/28/10 | 7.92 |
| 10/28/10 | 7.92 |
| 10/28/10 | 8.01 |
| 10/28/10 | 8.61 |
| 10/28/10 | 8.35 |
| 10/28/10 | 8.49 |
| 10/28/10 | 8.42 |
| 10/28/10 | 8.33 |
| 10/28/10 | 8.37 |
| 10/28/10 | 8.33 |
| 10/28/10 | 8.28 |
| 10/28/10 | 8.15 |
| 10/28/10 | 8.45 |
| 10/28/10 | 8.35 |
| 10/28/10 | 8.37 |
| 10/28/10 | 8.49 |
| 10/28/10 | 8.51 |
| 10/28/10 | 8.6 |
| 10/28/10 | 8.64 |
| 10/28/10 | 8.63 |
| 10/28/10 | 8.76 |
| 10/28/10 | 8.74 |
| 10/28/10 | 8.64 |
| 10/28/10 | 8.75 |
| 10/28/10 | 8.81 |
| 10/28/10 | 8.75 |
| 10/28/10 | 8.76 |
| 10/28/10 | 8.79 |
| 10/28/10 | 8.67 |
| 10/28/10 | 8.8 |
| 10/28/10 | 8.76 |
| 10/28/10 | 8.73 |
| 10/28/10 | 8.53 |
| 10/28/10 | 8.62 |
| 10/28/10 | 8.6 |
| 10/28/10 | 8.66 |
| 10/28/10 | 8.66 |
| 10/28/10 | 8.69 |
| 10/28/10 | 8.65 |
| 10/28/10 | 8.65 |
| 10/29/10 | 8.62 |
| 10/29/10 | 8.67 |
| 10/29/10 | 8.65 |
| 10/29/10 | 8.64 |
| 10/29/10 | 8.56 |
| 10/29/10 | 8.62 |
| 10/29/10 | 8.66 |
| 10/29/10 | 8.62 |
| 10/29/10 | 8.61 |
| 10/29/10 | 8.54 |
| 10/29/10 | 8.61 |
| 10/29/10 | 8.67 |
| 10/29/10 | 8.61 |
| 10/29/10 | 8.61 |
| 10/29/10 | 8.66 |
| 10/29/10 | 8.59 |
| 10/29/10 | 8.58 |
| 10/29/10 | 8.62 |
| 10/29/10 | 8.64 |
| 10/29/10 | 8.63 |
| 10/29/10 | 8.68 |
| 10/29/10 | 8.68 |
| 10/29/10 | 8.76 |
| 10/29/10 | 8.79 |
| 10/29/10 | 8.85 |
| 10/29/10 | 8.83 |